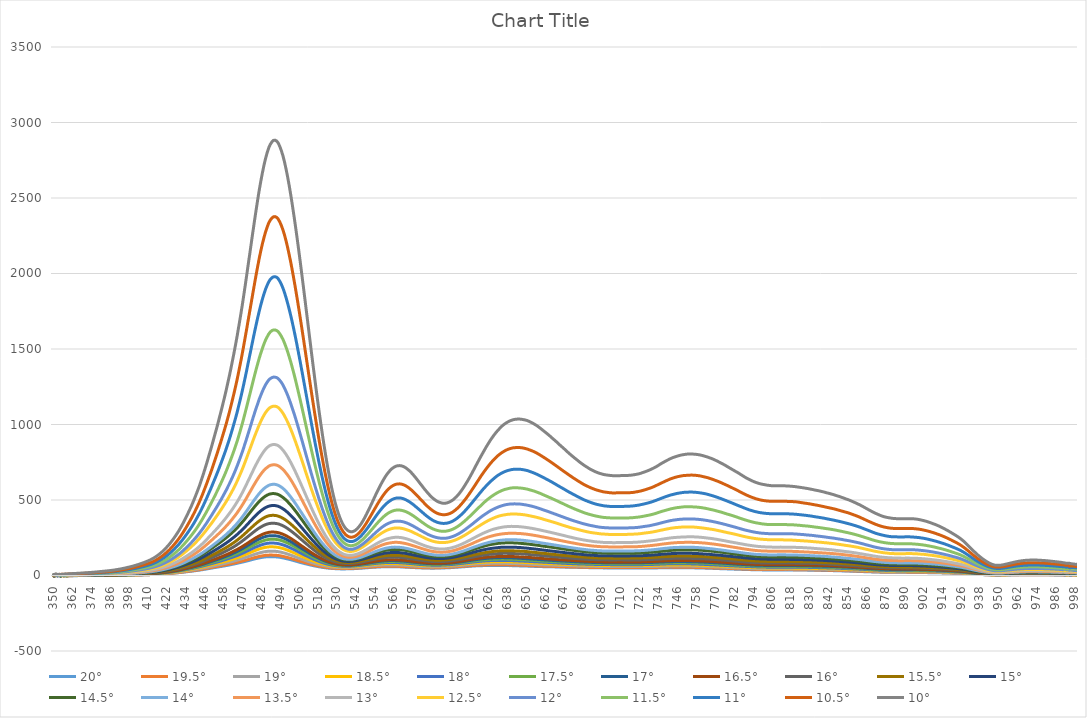
| Category | 20° | 19.5° | 19° | 18.5° | 18° | 17.5° | 17° | 16.5° | 16° | 15.5° | 15° | 14.5° | 14° | 13.5° | 13° | 12.5° | 12° | 11.5° | 11° | 10.5° | 10° |
|---|---|---|---|---|---|---|---|---|---|---|---|---|---|---|---|---|---|---|---|---|---|
| 350.0 | -3.8 | -4.6 | -4.43 | -1.91 | -3.49 | -1.98 | -2.47 | -2.61 | -2.13 | -1.78 | -2.96 | -2.86 | -1.34 | -1.84 | -1.45 | 0.39 | -0.03 | 1.76 | 2.17 | 3.65 | 5.14 |
| 351.0 | -2.59 | -1.88 | -1.63 | -2.56 | -1.35 | -1.81 | -1.64 | -1.21 | -0.99 | 0.06 | -1.39 | 0.5 | 1.16 | -0.02 | 0.41 | 1.13 | 2.72 | 3.41 | 5.08 | 3.66 | 6.78 |
| 352.0 | -0.54 | -1.29 | -0.75 | -0.14 | -0.24 | 0.04 | 0.64 | 1.23 | 2.02 | 0.64 | -0.57 | 2.36 | 0.42 | 1.25 | 1.62 | 4.01 | 4.22 | 3.98 | 5.79 | 7.55 | 10.65 |
| 353.0 | -1.22 | -2.13 | -0.63 | 1.26 | -1.13 | 0.01 | -1.39 | 0.25 | 0.46 | -0.81 | 0.3 | 0.75 | 0.14 | 3.08 | 1.95 | 2.42 | 3.39 | 6.29 | 4.01 | 5.92 | 6.45 |
| 354.0 | -0.59 | 0.29 | 0.73 | 0.08 | -0.95 | 1.05 | 0.68 | -0.36 | 0.46 | 1.74 | 1.89 | 2.37 | 2.81 | 0.76 | 2.65 | 4.52 | 6.3 | 5.73 | 6.57 | 7.53 | 7.84 |
| 355.0 | -4.15 | -2.56 | -2.13 | -1.78 | -2.16 | -3.18 | -1.54 | -1.16 | -0.76 | -0.45 | -1.78 | -1.89 | -0.79 | -0.06 | -0.19 | 1.72 | 3.41 | 2.56 | 4.08 | 7.33 | 5.67 |
| 356.0 | 2.12 | -1.53 | 0.09 | 0.32 | 0.18 | 0.45 | 0.92 | -0.53 | 0.31 | 2.13 | 4.66 | 1.52 | 0.91 | 4.03 | 3.12 | 4.37 | 4.91 | 6.01 | 7.25 | 9.04 | 8.43 |
| 357.0 | -2.07 | -2.23 | -1.25 | -3.31 | -1.07 | -0.15 | -0.63 | 0.37 | -0.02 | -0.28 | -1.48 | 1.65 | 2.5 | 0.69 | 2.95 | 3.8 | 1.18 | 3.75 | 6.34 | 7.11 | 7.34 |
| 358.0 | -2.58 | -1.68 | -1.01 | 0.71 | -0.08 | -0.06 | 0.22 | -0.05 | -0.25 | 0.91 | -0.02 | 1.79 | 1.94 | 1.33 | 1.63 | 3.08 | 2.93 | 3.92 | 6.44 | 8.85 | 11.12 |
| 359.0 | -3.02 | -2.08 | -0.57 | -2.37 | -1.59 | -1.05 | 0.63 | -0.98 | -0.86 | -1.45 | 0.97 | 0.07 | 0.64 | 1.16 | 2.12 | 2.67 | 4.32 | 5.27 | 5.98 | 9.12 | 9.4 |
| 360.0 | -1.5 | -1.32 | -0.93 | -0.48 | -0.77 | -0.09 | 0.18 | 0 | 0.54 | 0.47 | 0.82 | 1.27 | 1.63 | 2.06 | 2.85 | 4 | 4.81 | 6.37 | 7.61 | 9.39 | 11.04 |
| 361.0 | -1.39 | -1.05 | -0.71 | -0.34 | -0.58 | 0 | 0.36 | 0.2 | 0.69 | 0.8 | 1.14 | 1.58 | 1.86 | 2.37 | 3.15 | 4.2 | 5.32 | 6.77 | 8.21 | 10 | 11.64 |
| 362.0 | -1.3 | -0.87 | -0.6 | -0.08 | -0.51 | 0.11 | 0.53 | 0.31 | 0.85 | 0.88 | 1.37 | 1.68 | 1.98 | 2.63 | 3.41 | 4.52 | 5.53 | 7.23 | 8.63 | 10.61 | 12.29 |
| 363.0 | -1.29 | -0.84 | -0.52 | -0.1 | -0.52 | 0.09 | 0.53 | 0.31 | 0.79 | 0.91 | 1.48 | 1.71 | 2.08 | 2.79 | 3.63 | 4.7 | 5.73 | 7.6 | 8.96 | 11 | 12.67 |
| 364.0 | -1.08 | -0.61 | -0.43 | -0.1 | -0.4 | 0.24 | 0.78 | 0.41 | 0.99 | 1.13 | 1.68 | 1.92 | 2.25 | 3 | 3.83 | 5.03 | 6.11 | 7.89 | 9.43 | 11.54 | 13.37 |
| 365.0 | -1.06 | -0.58 | -0.42 | -0.13 | -0.32 | 0.2 | 0.83 | 0.51 | 1.07 | 1.18 | 1.69 | 2.08 | 2.27 | 3.21 | 4.02 | 5.24 | 6.22 | 8.22 | 9.78 | 11.93 | 13.98 |
| 366.0 | -0.79 | -0.4 | -0.27 | 0.01 | -0.17 | 0.52 | 1.03 | 0.6 | 1.25 | 1.35 | 2.01 | 2.24 | 2.53 | 3.47 | 4.41 | 5.63 | 6.54 | 8.69 | 10.26 | 12.47 | 14.68 |
| 367.0 | -0.77 | -0.25 | -0.22 | 0.09 | -0.07 | 0.64 | 1.02 | 0.78 | 1.43 | 1.39 | 2.02 | 2.36 | 2.73 | 3.7 | 4.61 | 5.9 | 6.82 | 9.06 | 10.74 | 12.89 | 15.32 |
| 368.0 | -0.82 | -0.22 | -0.22 | 0.19 | -0.04 | 0.65 | 1.06 | 0.77 | 1.54 | 1.48 | 2.26 | 2.47 | 2.74 | 3.86 | 4.73 | 6.12 | 7.18 | 9.44 | 11.08 | 13.37 | 16.02 |
| 369.0 | -0.77 | -0.11 | -0.16 | 0.24 | 0.02 | 0.73 | 1.17 | 0.86 | 1.61 | 1.53 | 2.34 | 2.56 | 2.86 | 4.07 | 4.97 | 6.38 | 7.61 | 9.89 | 11.6 | 13.85 | 16.52 |
| 370.0 | -0.58 | 0.06 | -0.13 | 0.51 | 0.12 | 0.92 | 1.31 | 0.96 | 1.88 | 1.74 | 2.6 | 2.85 | 3.15 | 4.36 | 5.27 | 6.74 | 8.02 | 10.33 | 12.13 | 14.4 | 17.22 |
| 371.0 | -0.46 | 0.09 | -0.09 | 0.56 | 0.33 | 0.97 | 1.38 | 1.12 | 1.94 | 1.81 | 2.79 | 3.02 | 3.36 | 4.51 | 5.52 | 6.96 | 8.41 | 10.76 | 12.47 | 14.99 | 17.81 |
| 372.0 | -0.36 | 0.24 | 0.02 | 0.73 | 0.63 | 1.13 | 1.54 | 1.23 | 2.13 | 1.92 | 2.9 | 3.29 | 3.65 | 4.91 | 5.86 | 7.45 | 8.9 | 11.25 | 13.13 | 15.64 | 18.6 |
| 373.0 | -0.16 | 0.46 | 0.18 | 0.85 | 0.78 | 1.2 | 1.64 | 1.36 | 2.14 | 2.04 | 3.19 | 3.53 | 3.88 | 5.25 | 6.15 | 7.85 | 9.34 | 11.78 | 13.8 | 16.23 | 19.46 |
| 374.0 | -0.21 | 0.5 | 0.13 | 0.91 | 0.89 | 1.26 | 1.8 | 1.43 | 2.11 | 2.12 | 3.2 | 3.63 | 4.09 | 5.41 | 6.38 | 8.24 | 9.7 | 12.15 | 14.37 | 16.85 | 20.12 |
| 375.0 | -0.11 | 0.51 | 0.22 | 0.99 | 0.99 | 1.37 | 1.89 | 1.6 | 2.29 | 2.42 | 3.42 | 4.02 | 4.26 | 5.62 | 6.67 | 8.57 | 10.06 | 12.69 | 14.93 | 17.43 | 21.01 |
| 376.0 | -0.13 | 0.5 | 0.25 | 0.93 | 1.1 | 1.45 | 1.83 | 1.65 | 2.46 | 2.51 | 3.62 | 4.17 | 4.62 | 5.82 | 6.94 | 8.89 | 10.35 | 13.2 | 15.52 | 18.08 | 21.77 |
| 377.0 | 0.09 | 0.57 | 0.51 | 1.11 | 1.32 | 1.66 | 2.03 | 1.89 | 2.69 | 2.65 | 4.02 | 4.63 | 4.91 | 6.19 | 7.42 | 9.37 | 11.01 | 13.85 | 16.17 | 18.95 | 22.77 |
| 378.0 | 0.04 | 0.62 | 0.63 | 1.16 | 1.35 | 1.75 | 2.16 | 2 | 2.8 | 2.79 | 4.18 | 4.91 | 5.02 | 6.48 | 7.65 | 9.7 | 11.48 | 14.38 | 16.78 | 19.76 | 23.73 |
| 379.0 | 0.12 | 0.69 | 0.85 | 1.17 | 1.33 | 1.87 | 2.28 | 2.15 | 2.87 | 2.9 | 4.24 | 5.3 | 5.13 | 6.8 | 8.02 | 10.18 | 11.86 | 14.88 | 17.35 | 20.4 | 24.79 |
| 380.0 | 0.15 | 0.76 | 0.98 | 1.26 | 1.44 | 2.08 | 2.43 | 2.25 | 3.07 | 3.11 | 4.6 | 5.47 | 5.26 | 7.22 | 8.5 | 10.68 | 12.37 | 15.44 | 18.1 | 21.19 | 25.88 |
| 381.0 | 0.18 | 0.9 | 1.02 | 1.2 | 1.63 | 2.14 | 2.55 | 2.35 | 3.18 | 3.32 | 4.79 | 5.73 | 5.46 | 7.48 | 8.92 | 11.16 | 12.94 | 16 | 18.82 | 22.02 | 26.88 |
| 382.0 | 0.27 | 0.91 | 1.25 | 1.27 | 1.76 | 2.3 | 2.68 | 2.44 | 3.33 | 3.38 | 5 | 5.95 | 5.68 | 7.8 | 9.29 | 11.71 | 13.35 | 16.65 | 19.42 | 22.77 | 28.03 |
| 383.0 | 0.37 | 0.92 | 1.27 | 1.32 | 1.91 | 2.43 | 2.79 | 2.54 | 3.37 | 3.64 | 5.24 | 6.27 | 5.93 | 8.01 | 9.6 | 12.1 | 13.95 | 17.1 | 20.15 | 23.55 | 28.92 |
| 384.0 | 0.35 | 0.94 | 1.23 | 1.5 | 2.02 | 2.59 | 2.88 | 2.61 | 3.55 | 3.85 | 5.43 | 6.57 | 6.22 | 8.32 | 9.91 | 12.6 | 14.49 | 17.63 | 20.85 | 24.3 | 29.87 |
| 385.0 | 0.28 | 0.97 | 1.33 | 1.63 | 2.1 | 2.62 | 3.03 | 2.74 | 3.68 | 4.05 | 5.68 | 6.78 | 6.54 | 8.61 | 10.38 | 13.13 | 14.96 | 18.25 | 21.6 | 25.2 | 30.99 |
| 386.0 | 0.36 | 0.92 | 1.38 | 1.78 | 2.19 | 2.9 | 3.13 | 2.94 | 3.9 | 4.37 | 6.02 | 6.97 | 6.91 | 9.03 | 10.79 | 13.72 | 15.59 | 18.96 | 22.49 | 26.27 | 32.14 |
| 387.0 | 0.38 | 0.96 | 1.54 | 1.92 | 2.3 | 2.93 | 3.26 | 3.15 | 3.96 | 4.58 | 6.22 | 7.42 | 7.22 | 9.36 | 11.18 | 14.23 | 16.31 | 19.72 | 23.47 | 27.25 | 33.55 |
| 388.0 | 0.3 | 1.03 | 1.55 | 1.96 | 2.45 | 2.92 | 3.48 | 3.19 | 4.11 | 4.74 | 6.37 | 7.73 | 7.49 | 9.51 | 11.63 | 14.67 | 16.87 | 20.42 | 24.3 | 28.37 | 34.87 |
| 389.0 | 0.5 | 1.11 | 1.62 | 2.09 | 2.51 | 3.06 | 3.61 | 3.49 | 4.33 | 5.02 | 6.56 | 8 | 7.76 | 9.9 | 12.16 | 15.2 | 17.62 | 21.19 | 25.3 | 29.54 | 36.19 |
| 390.0 | 0.72 | 1.22 | 1.88 | 2.21 | 2.78 | 3.29 | 3.98 | 3.8 | 4.65 | 5.38 | 7.08 | 8.53 | 8.35 | 10.51 | 12.82 | 16.09 | 18.43 | 22.29 | 26.54 | 31.07 | 38 |
| 391.0 | 0.79 | 1.23 | 2.04 | 2.2 | 2.93 | 3.34 | 4.1 | 4.07 | 4.77 | 5.71 | 7.38 | 8.84 | 8.65 | 10.95 | 13.31 | 16.83 | 19.18 | 23.16 | 27.77 | 32.42 | 39.64 |
| 392.0 | 0.86 | 1.37 | 2.23 | 2.43 | 3 | 3.67 | 4.34 | 4.32 | 5.07 | 6.09 | 7.87 | 9.19 | 9.03 | 11.47 | 13.89 | 17.62 | 20.12 | 24.17 | 29.29 | 33.95 | 41.44 |
| 393.0 | 1.11 | 1.58 | 2.49 | 2.75 | 3.17 | 3.95 | 4.55 | 4.66 | 5.5 | 6.56 | 8.38 | 9.68 | 9.56 | 12.02 | 14.56 | 18.43 | 21.1 | 25.38 | 30.62 | 35.62 | 43.46 |
| 394.0 | 1.2 | 1.6 | 2.52 | 2.84 | 3.34 | 4.19 | 4.78 | 4.92 | 5.81 | 6.95 | 8.65 | 10.06 | 10.01 | 12.65 | 15.19 | 19.31 | 22.04 | 26.59 | 31.88 | 37.22 | 45.4 |
| 395.0 | 1.44 | 1.74 | 2.82 | 3.12 | 3.53 | 4.41 | 5.01 | 5.36 | 6.13 | 7.54 | 9.18 | 10.72 | 10.58 | 13.46 | 15.89 | 20.18 | 23.18 | 27.92 | 33.25 | 38.83 | 47.51 |
| 396.0 | 1.4 | 1.84 | 2.8 | 3.25 | 3.71 | 4.57 | 5.13 | 5.46 | 6.34 | 7.75 | 9.64 | 11.05 | 11.13 | 14.08 | 16.55 | 21.23 | 24.3 | 29.22 | 34.76 | 40.65 | 49.88 |
| 397.0 | 1.68 | 2.17 | 3.11 | 3.77 | 4.13 | 4.96 | 5.63 | 5.91 | 6.75 | 8.33 | 10.22 | 11.69 | 11.86 | 14.93 | 17.49 | 22.29 | 25.72 | 30.78 | 36.51 | 42.73 | 52.39 |
| 398.0 | 1.87 | 2.44 | 3.3 | 3.97 | 4.41 | 5.22 | 5.94 | 6.21 | 7.1 | 8.8 | 10.61 | 12.05 | 12.42 | 15.62 | 18.19 | 23.4 | 26.81 | 32.13 | 38.17 | 44.76 | 54.84 |
| 399.0 | 2.13 | 2.51 | 3.33 | 4.19 | 4.68 | 5.38 | 6.09 | 6.46 | 7.49 | 9.24 | 11.12 | 12.56 | 12.98 | 16.27 | 19.04 | 24.41 | 27.85 | 33.66 | 39.87 | 46.72 | 57.22 |
| 400.0 | 2.45 | 2.72 | 3.56 | 4.43 | 4.94 | 5.74 | 6.44 | 6.82 | 7.97 | 9.88 | 11.71 | 13.06 | 13.68 | 16.89 | 19.89 | 25.56 | 29.23 | 35.11 | 41.83 | 48.99 | 59.87 |
| 401.0 | 2.57 | 2.93 | 3.68 | 4.68 | 5.12 | 5.94 | 6.82 | 7.13 | 8.34 | 10.18 | 12.07 | 13.65 | 14.33 | 17.65 | 20.72 | 26.75 | 30.59 | 36.57 | 43.82 | 51.39 | 62.68 |
| 402.0 | 2.81 | 3.18 | 4.1 | 5.11 | 5.69 | 6.48 | 7.27 | 7.67 | 8.8 | 10.75 | 12.71 | 14.41 | 15.2 | 18.63 | 21.79 | 28.02 | 32.01 | 38.36 | 45.91 | 53.95 | 65.9 |
| 403.0 | 3.12 | 3.45 | 4.35 | 5.44 | 6.15 | 6.93 | 7.73 | 8.19 | 9.35 | 11.43 | 13.33 | 15.1 | 16.07 | 19.46 | 22.83 | 29.24 | 33.57 | 40.06 | 48.06 | 56.59 | 68.83 |
| 404.0 | 3.37 | 3.59 | 4.7 | 5.72 | 6.56 | 7.43 | 8.07 | 8.59 | 9.97 | 12.01 | 13.97 | 15.77 | 16.87 | 20.41 | 23.9 | 30.5 | 35.11 | 41.94 | 50.33 | 59.14 | 72.01 |
| 405.0 | 3.67 | 3.9 | 5.04 | 6.09 | 6.98 | 7.93 | 8.63 | 9.12 | 10.58 | 12.62 | 14.64 | 16.43 | 17.67 | 21.36 | 25.01 | 31.85 | 36.67 | 43.94 | 52.68 | 61.96 | 75.52 |
| 406.0 | 3.92 | 3.98 | 5.19 | 6.4 | 7.28 | 8.35 | 9.05 | 9.69 | 10.96 | 13.16 | 15.31 | 17.14 | 18.53 | 22.24 | 26.26 | 33.12 | 38.27 | 45.98 | 55.33 | 64.89 | 79.05 |
| 407.0 | 4.12 | 4.29 | 5.48 | 6.78 | 7.67 | 8.75 | 9.55 | 10.07 | 11.42 | 13.61 | 15.99 | 17.99 | 19.41 | 23.2 | 27.35 | 34.53 | 39.97 | 48.02 | 57.79 | 67.84 | 82.76 |
| 408.0 | 4.43 | 4.66 | 5.81 | 7.18 | 8.19 | 9.28 | 10.2 | 10.61 | 12.29 | 14.32 | 16.9 | 18.93 | 20.4 | 24.37 | 28.52 | 36.18 | 41.84 | 50.17 | 60.41 | 70.98 | 86.58 |
| 409.0 | 4.79 | 4.88 | 6.17 | 7.49 | 8.6 | 9.79 | 10.74 | 11.17 | 12.98 | 14.95 | 17.66 | 19.9 | 21.31 | 25.59 | 29.91 | 37.89 | 43.78 | 52.55 | 63.23 | 74.21 | 90.67 |
| 410.0 | 5.08 | 5.19 | 6.51 | 7.9 | 9.16 | 10.24 | 11.31 | 11.68 | 13.59 | 15.65 | 18.54 | 20.9 | 22.5 | 26.76 | 31.45 | 39.64 | 45.87 | 54.97 | 66.13 | 77.72 | 94.86 |
| 411.0 | 5.41 | 5.53 | 6.81 | 8.4 | 9.5 | 10.78 | 11.7 | 12.13 | 14.33 | 16.48 | 19.37 | 21.86 | 23.5 | 27.97 | 32.83 | 41.39 | 48 | 57.38 | 69.02 | 81.08 | 99.21 |
| 412.0 | 5.93 | 5.99 | 7.38 | 8.89 | 10.23 | 11.5 | 12.32 | 12.82 | 15.21 | 17.39 | 20.26 | 23.1 | 24.79 | 29.43 | 34.55 | 43.44 | 50.38 | 60.39 | 72.49 | 85.17 | 104.28 |
| 413.0 | 6.33 | 6.41 | 7.73 | 9.39 | 10.79 | 11.93 | 13 | 13.38 | 16.09 | 18.39 | 21.18 | 24.35 | 26.06 | 30.96 | 36.29 | 45.56 | 52.75 | 63.38 | 75.95 | 89.19 | 109.61 |
| 414.0 | 6.77 | 6.83 | 8.12 | 9.9 | 11.58 | 12.59 | 13.77 | 14.19 | 17.01 | 19.41 | 22.3 | 25.63 | 27.41 | 32.61 | 38.21 | 47.97 | 55.42 | 66.82 | 80.22 | 93.98 | 115.52 |
| 415.0 | 7.28 | 7.38 | 8.75 | 10.62 | 12.37 | 13.44 | 14.58 | 15.07 | 18.21 | 20.61 | 23.68 | 27.13 | 29.01 | 34.42 | 40.35 | 50.66 | 58.52 | 70.61 | 84.91 | 99.36 | 121.9 |
| 416.0 | 7.9 | 8.1 | 9.4 | 11.3 | 13.26 | 14.32 | 15.53 | 15.85 | 19.46 | 21.68 | 25.02 | 28.63 | 30.58 | 36.41 | 42.9 | 53.64 | 61.8 | 74.63 | 89.93 | 105.27 | 129 |
| 417.0 | 8.61 | 8.75 | 10.36 | 12.14 | 14.15 | 15.43 | 16.63 | 17.06 | 20.79 | 23.17 | 26.54 | 30.54 | 32.53 | 38.7 | 45.55 | 56.86 | 65.63 | 79.07 | 95.6 | 111.86 | 136.77 |
| 418.0 | 9.23 | 9.35 | 11.07 | 12.71 | 15.02 | 16.31 | 17.64 | 18.07 | 22.02 | 24.57 | 28.07 | 32.31 | 34.58 | 40.97 | 48.07 | 60.22 | 69.27 | 83.59 | 101.43 | 118.66 | 144.95 |
| 419.0 | 9.78 | 9.85 | 11.73 | 13.52 | 15.89 | 17.32 | 18.53 | 19.22 | 23.27 | 25.98 | 29.74 | 34.21 | 36.73 | 43.25 | 50.87 | 63.71 | 73.4 | 88.68 | 107.65 | 125.91 | 153.74 |
| 420.0 | 10.32 | 10.59 | 12.58 | 14.39 | 16.9 | 18.49 | 19.77 | 20.35 | 24.52 | 27.39 | 31.61 | 36.16 | 38.94 | 45.95 | 54.05 | 67.77 | 77.89 | 93.97 | 114.08 | 133.72 | 163.15 |
| 421.0 | 10.92 | 11.36 | 13.38 | 15.52 | 17.94 | 19.51 | 21.02 | 21.78 | 26.03 | 28.98 | 33.56 | 38.42 | 41.38 | 48.84 | 57.47 | 71.96 | 82.75 | 99.94 | 121.07 | 142.11 | 173.4 |
| 422.0 | 11.77 | 12.13 | 14.39 | 16.63 | 19.05 | 20.74 | 22.18 | 23.26 | 27.79 | 31.07 | 35.7 | 40.96 | 44.05 | 52.05 | 60.96 | 76.84 | 87.82 | 106.28 | 128.69 | 151.1 | 184.44 |
| 423.0 | 12.5 | 12.88 | 15.33 | 17.84 | 20.17 | 21.92 | 23.65 | 24.74 | 29.64 | 33.02 | 37.9 | 43.23 | 46.78 | 55.17 | 64.67 | 81.33 | 93.27 | 112.95 | 136.73 | 160.54 | 195.5 |
| 424.0 | 13.38 | 13.81 | 16.2 | 18.97 | 21.37 | 23.19 | 25.15 | 26.23 | 31.44 | 34.83 | 40.21 | 45.84 | 49.73 | 58.64 | 68.82 | 86.45 | 99.11 | 119.94 | 145.28 | 170.62 | 207.88 |
| 425.0 | 14.13 | 14.78 | 17.31 | 20.15 | 22.61 | 24.54 | 26.77 | 27.9 | 33.3 | 36.87 | 42.64 | 48.72 | 52.74 | 62.41 | 73 | 92.01 | 105.38 | 127.73 | 154.3 | 181.48 | 221.04 |
| 426.0 | 15.16 | 15.7 | 18.44 | 21.35 | 24.05 | 25.96 | 28.38 | 29.44 | 35.32 | 39.04 | 45.39 | 51.78 | 56.04 | 66.19 | 77.53 | 97.74 | 112.07 | 135.73 | 163.86 | 192.99 | 234.96 |
| 427.0 | 16.05 | 16.68 | 19.65 | 22.61 | 25.62 | 27.47 | 29.84 | 31.16 | 37.36 | 41.48 | 48.05 | 54.92 | 59.25 | 70.26 | 82.04 | 103.78 | 118.92 | 144.19 | 173.84 | 204.96 | 249.34 |
| 428.0 | 17.07 | 17.8 | 20.86 | 24 | 27.19 | 29.17 | 31.7 | 33.1 | 39.58 | 44.05 | 51.01 | 58.09 | 62.73 | 74.6 | 87.19 | 110.23 | 126.19 | 152.9 | 184.53 | 217.48 | 264.43 |
| 429.0 | 17.96 | 18.75 | 21.85 | 25.39 | 28.74 | 30.71 | 33.27 | 34.95 | 41.71 | 46.49 | 53.61 | 61.43 | 66.28 | 78.95 | 92.35 | 116.65 | 133.4 | 162.23 | 195.44 | 230.49 | 280.18 |
| 430.0 | 18.9 | 19.85 | 23.12 | 26.94 | 30.31 | 32.56 | 35.19 | 36.96 | 44 | 49.28 | 56.79 | 65.06 | 70.22 | 83.63 | 97.76 | 123.54 | 141.3 | 171.9 | 206.89 | 244.32 | 296.74 |
| 431.0 | 20.01 | 21.21 | 24.72 | 28.7 | 32.26 | 34.49 | 37.17 | 39.11 | 46.71 | 52.08 | 60.27 | 68.91 | 74.4 | 88.62 | 103.51 | 131.03 | 149.59 | 182.37 | 219.3 | 259.18 | 314.82 |
| 432.0 | 21.18 | 22.5 | 26.18 | 30.22 | 34.18 | 36.34 | 39.23 | 41.55 | 49.4 | 55.11 | 63.71 | 72.81 | 78.58 | 93.87 | 109.59 | 138.77 | 158.51 | 193.08 | 232.24 | 274.54 | 333.54 |
| 433.0 | 22.28 | 23.88 | 27.49 | 32 | 36.13 | 38.38 | 41.53 | 44.02 | 52.25 | 58.19 | 67.33 | 76.95 | 83.08 | 99.54 | 116.03 | 146.97 | 167.81 | 204.32 | 245.85 | 290.7 | 353.23 |
| 434.0 | 23.5 | 25.23 | 29.22 | 33.84 | 38.08 | 40.6 | 43.88 | 46.6 | 55.18 | 61.41 | 71.18 | 81.37 | 87.91 | 105.24 | 122.64 | 155.18 | 177.53 | 216 | 260.04 | 307.47 | 373.69 |
| 435.0 | 24.75 | 26.58 | 30.84 | 35.56 | 39.95 | 42.62 | 46.1 | 49.13 | 58.06 | 64.76 | 74.92 | 85.62 | 92.8 | 111.11 | 129.31 | 163.64 | 187.42 | 227.87 | 274.27 | 324.56 | 394.18 |
| 436.0 | 26.17 | 27.97 | 32.53 | 37.53 | 41.95 | 44.82 | 48.66 | 51.69 | 61.05 | 68.09 | 78.9 | 90.22 | 98.01 | 117.2 | 136.31 | 172.9 | 197.93 | 240.52 | 289.39 | 343.02 | 416.64 |
| 437.0 | 27.43 | 29.25 | 33.93 | 39.46 | 43.84 | 47.02 | 50.91 | 54.12 | 64.09 | 71.55 | 82.89 | 94.77 | 103.01 | 123.22 | 143.2 | 182.02 | 208.37 | 253.28 | 304.77 | 361.15 | 438.89 |
| 438.0 | 28.65 | 30.7 | 35.46 | 41.32 | 46.11 | 49.1 | 53.31 | 56.76 | 67.08 | 75.02 | 86.86 | 99.45 | 108.09 | 129.35 | 150.37 | 191.3 | 219.01 | 266.48 | 320.36 | 379.94 | 461.6 |
| 439.0 | 29.89 | 32.19 | 37.15 | 43.45 | 48.21 | 51.39 | 55.78 | 59.66 | 70.36 | 78.86 | 90.98 | 104.51 | 113.43 | 136 | 158.25 | 201.38 | 230.42 | 280.23 | 337.12 | 399.9 | 486.14 |
| 440.0 | 31.31 | 33.68 | 38.91 | 45.47 | 50.37 | 53.99 | 58.72 | 62.49 | 73.75 | 82.65 | 95.43 | 109.84 | 119 | 142.98 | 166.2 | 211.57 | 242.09 | 294.27 | 354.49 | 420.29 | 511.3 |
| 441.0 | 32.88 | 35.25 | 40.79 | 47.6 | 52.71 | 56.47 | 61.54 | 65.54 | 77.43 | 86.76 | 99.95 | 115.49 | 124.97 | 150.11 | 174.53 | 222.1 | 254.52 | 308.79 | 372.72 | 441.9 | 538.09 |
| 442.0 | 34.16 | 36.85 | 42.7 | 49.73 | 55.11 | 59.2 | 64.39 | 68.4 | 80.95 | 90.79 | 104.76 | 120.99 | 131.18 | 157.61 | 183.11 | 233.26 | 267 | 324.25 | 391.68 | 464.1 | 565.15 |
| 443.0 | 35.62 | 38.42 | 44.59 | 51.9 | 57.62 | 61.87 | 67.12 | 71.38 | 84.58 | 94.84 | 109.53 | 126.65 | 137.24 | 164.92 | 191.91 | 244.09 | 279.98 | 340.19 | 410.37 | 486.93 | 592.87 |
| 444.0 | 37.21 | 40.22 | 46.5 | 54.17 | 60.1 | 64.65 | 70.14 | 74.77 | 88.45 | 99.4 | 114.75 | 133.08 | 143.78 | 173.3 | 201.53 | 256.63 | 294.23 | 357.36 | 431.23 | 511.99 | 623.69 |
| 445.0 | 38.79 | 41.83 | 48.57 | 56.61 | 62.68 | 67.57 | 73.22 | 78.21 | 92.41 | 103.89 | 120.14 | 139.41 | 150.42 | 181.39 | 210.88 | 268.64 | 308.13 | 374.69 | 452.34 | 536.74 | 654.12 |
| 446.0 | 40.71 | 43.82 | 50.59 | 59.18 | 65.6 | 70.84 | 76.61 | 81.89 | 96.67 | 108.96 | 125.95 | 146.33 | 157.54 | 190.04 | 221.22 | 281.86 | 323.34 | 393.02 | 475.09 | 563.95 | 687.26 |
| 447.0 | 42.31 | 45.86 | 52.73 | 61.62 | 68.29 | 73.86 | 79.93 | 85.58 | 100.81 | 113.84 | 131.71 | 152.75 | 164.79 | 198.84 | 231.65 | 294.63 | 338.25 | 411.41 | 497.56 | 590.79 | 720.6 |
| 448.0 | 44.12 | 47.93 | 54.85 | 64.11 | 71.17 | 77.13 | 83.46 | 89.24 | 105.33 | 118.87 | 137.58 | 159.52 | 172.48 | 207.83 | 242.3 | 308.47 | 353.99 | 430.27 | 521.06 | 618.48 | 755.24 |
| 449.0 | 45.9 | 49.82 | 57.15 | 66.64 | 74.05 | 80.19 | 86.86 | 93.13 | 109.86 | 124.05 | 143.62 | 166.66 | 180.16 | 217.16 | 253.26 | 322.45 | 370.43 | 450.5 | 545.13 | 647.68 | 791.52 |
| 450.0 | 47.71 | 51.68 | 59.37 | 69.14 | 76.74 | 83.31 | 90.31 | 96.86 | 114.19 | 129.15 | 149.8 | 173.63 | 187.81 | 226.29 | 263.7 | 335.94 | 386.32 | 469.78 | 568.67 | 675.87 | 826.6 |
| 451.0 | 49.52 | 53.57 | 61.64 | 71.78 | 79.65 | 86.46 | 93.68 | 100.74 | 118.67 | 134.45 | 155.77 | 180.56 | 195.51 | 235.51 | 274.7 | 349.75 | 402.49 | 489.45 | 593.1 | 705.34 | 862.77 |
| 452.0 | 51.5 | 55.72 | 64.08 | 74.47 | 82.62 | 89.9 | 97.56 | 104.75 | 123.39 | 140.03 | 161.96 | 188.21 | 203.76 | 245.61 | 286.23 | 364.67 | 419.88 | 510.49 | 619.15 | 736.87 | 901.16 |
| 453.0 | 53.23 | 57.62 | 66.24 | 77.14 | 85.49 | 93.17 | 101.01 | 108.56 | 127.87 | 145.07 | 168.27 | 195.58 | 211.53 | 254.93 | 297.51 | 379.03 | 436.47 | 531.05 | 644.23 | 767.71 | 938.68 |
| 454.0 | 55.01 | 59.43 | 68.49 | 79.62 | 88.3 | 96.47 | 104.52 | 112.42 | 132.4 | 150.45 | 174.49 | 202.83 | 219.46 | 264.45 | 308.75 | 393.65 | 453.33 | 552.23 | 669.74 | 799.01 | 976.37 |
| 455.0 | 56.7 | 61.19 | 70.63 | 82.02 | 91.17 | 99.64 | 108.03 | 116.35 | 137.02 | 155.95 | 180.73 | 210.13 | 227.6 | 274.19 | 320.4 | 408.91 | 470.95 | 574.07 | 696.23 | 831.93 | 1015.69 |
| 456.0 | 58.36 | 63.08 | 72.82 | 84.72 | 94.18 | 103.13 | 111.86 | 120.14 | 141.8 | 161.56 | 187.26 | 217.8 | 236.03 | 283.96 | 332.34 | 424.35 | 488.54 | 596.25 | 723.68 | 865.26 | 1056.76 |
| 457.0 | 59.95 | 65.02 | 75.24 | 87.13 | 97.26 | 106.5 | 115.44 | 124.1 | 146.64 | 167.31 | 193.88 | 225.5 | 244.15 | 293.96 | 344.33 | 439.63 | 506.66 | 618.39 | 750.98 | 897.83 | 1096.89 |
| 458.0 | 61.8 | 67.16 | 77.79 | 89.77 | 100.62 | 110.17 | 119.58 | 128.53 | 151.59 | 173.24 | 200.8 | 233.46 | 253.34 | 304.67 | 357.11 | 456.1 | 525.97 | 641.91 | 779.57 | 932.75 | 1139.37 |
| 459.0 | 63.69 | 69.09 | 80.1 | 92.42 | 103.75 | 113.87 | 123.54 | 132.83 | 156.85 | 179.01 | 207.79 | 241.51 | 262.24 | 315.38 | 369.84 | 472.23 | 545.22 | 665.52 | 808 | 967.29 | 1182.1 |
| 460.0 | 65.6 | 71.08 | 82.6 | 95.07 | 107 | 117.47 | 127.63 | 137.33 | 162.14 | 184.98 | 214.84 | 249.71 | 271.12 | 326.49 | 382.83 | 488.65 | 564.58 | 690.21 | 838.12 | 1003.16 | 1226.4 |
| 461.0 | 67.58 | 73.43 | 85.21 | 98.07 | 110.37 | 121.3 | 131.75 | 141.97 | 167.61 | 191.5 | 222.33 | 258.26 | 280.91 | 337.98 | 396.72 | 506.37 | 585.64 | 716.44 | 869.42 | 1041.14 | 1273.61 |
| 462.0 | 69.61 | 75.44 | 87.86 | 101.05 | 113.77 | 125.1 | 135.81 | 146.64 | 173.11 | 197.95 | 230.14 | 266.92 | 290.79 | 349.7 | 410.24 | 524.48 | 606.6 | 743.14 | 901.55 | 1079.97 | 1320.47 |
| 463.0 | 71.87 | 77.5 | 90.39 | 104.12 | 117.32 | 129.07 | 140.24 | 151.63 | 178.89 | 204.8 | 237.93 | 276.11 | 300.86 | 361.95 | 424.61 | 543 | 628.74 | 770.53 | 935.2 | 1121.58 | 1370.05 |
| 464.0 | 73.99 | 79.74 | 92.93 | 107.29 | 120.88 | 133.01 | 145.09 | 156.73 | 184.85 | 211.85 | 246.05 | 285.65 | 311.62 | 374.95 | 439.49 | 562.26 | 651.3 | 798.74 | 970.62 | 1164.03 | 1421.73 |
| 465.0 | 76.35 | 82.26 | 95.82 | 110.49 | 124.73 | 137.39 | 149.91 | 161.73 | 190.98 | 218.91 | 254.3 | 295.44 | 322.54 | 388.29 | 454.98 | 582.5 | 675 | 828.04 | 1006.53 | 1207.34 | 1474.99 |
| 466.0 | 78.56 | 84.79 | 98.4 | 113.85 | 128.46 | 141.71 | 154.72 | 166.79 | 197.5 | 226.52 | 262.89 | 305.45 | 333.61 | 401.59 | 471.04 | 603.35 | 699.83 | 858.18 | 1043.69 | 1252.58 | 1530.29 |
| 467.0 | 80.89 | 87.11 | 101.53 | 117.51 | 132.27 | 146.01 | 159.62 | 172.17 | 204.46 | 234.21 | 271.82 | 315.79 | 345.57 | 415.78 | 487.71 | 625.25 | 725.81 | 889.67 | 1082.35 | 1299.98 | 1587.81 |
| 468.0 | 83.41 | 89.68 | 104.8 | 121.51 | 136.8 | 151.06 | 164.98 | 178.22 | 211.73 | 242.73 | 281.33 | 327.43 | 358.14 | 431.21 | 505.74 | 649.2 | 753.76 | 924.4 | 1125.14 | 1351.26 | 1649.37 |
| 469.0 | 85.79 | 92.4 | 108.13 | 125.49 | 141.16 | 156.09 | 170.49 | 184.18 | 219.06 | 250.8 | 290.92 | 339.1 | 370.73 | 446.68 | 524.07 | 672.76 | 781.97 | 959.92 | 1167.61 | 1403 | 1710.92 |
| 470.0 | 88.22 | 95.06 | 111.29 | 129.44 | 145.51 | 161.27 | 176.08 | 190.32 | 226.53 | 259.45 | 300.88 | 350.9 | 384.19 | 462.6 | 543.27 | 697.46 | 811.09 | 996.39 | 1211.98 | 1456.77 | 1775.17 |
| 471.0 | 90.62 | 97.87 | 114.83 | 133.73 | 150.43 | 166.59 | 181.95 | 196.86 | 234.5 | 268.6 | 311.3 | 363.09 | 398.36 | 479.62 | 563.58 | 723.7 | 842.06 | 1035.26 | 1258.77 | 1513.72 | 1843.52 |
| 472.0 | 93.08 | 100.63 | 118.29 | 137.76 | 155.29 | 172.15 | 188.13 | 203.39 | 242.58 | 278.05 | 322.04 | 375.7 | 412.69 | 497.18 | 584.25 | 750.88 | 874.04 | 1075.26 | 1307.58 | 1572.34 | 1913.93 |
| 473.0 | 95.59 | 103.29 | 121.74 | 142 | 160.3 | 177.33 | 194.21 | 210.1 | 250.75 | 287.45 | 333.27 | 388.63 | 427.32 | 514.76 | 605.74 | 778.64 | 907.05 | 1116.29 | 1357.1 | 1631.27 | 1985.59 |
| 474.0 | 98.48 | 106.4 | 125.47 | 146.37 | 165.32 | 183.09 | 200.57 | 217.15 | 259.37 | 297.46 | 344.62 | 402.19 | 442.67 | 533.47 | 627.84 | 807.25 | 940.59 | 1158.16 | 1408.67 | 1692.14 | 2059.2 |
| 475.0 | 101.14 | 109.58 | 129.29 | 150.71 | 170.11 | 188.63 | 206.75 | 223.73 | 267.55 | 307.09 | 355.63 | 415.18 | 457.57 | 551.34 | 649.24 | 835.14 | 973.82 | 1199.11 | 1459.27 | 1751.73 | 2131.52 |
| 476.0 | 104.13 | 112.69 | 132.98 | 155.36 | 175.22 | 194.42 | 213.23 | 230.48 | 276.1 | 316.69 | 366.83 | 428.52 | 472.62 | 569.75 | 671.13 | 863.71 | 1007.83 | 1241.17 | 1510.36 | 1811.76 | 2205.07 |
| 477.0 | 106.93 | 115.6 | 136.55 | 159.63 | 180.08 | 200 | 219.26 | 237.36 | 284.27 | 326.33 | 378.15 | 441.77 | 487.36 | 588.39 | 692.9 | 892.54 | 1042.04 | 1283.26 | 1561.15 | 1872.3 | 2277.91 |
| 478.0 | 109.55 | 118.4 | 139.87 | 163.93 | 184.93 | 205.32 | 225.53 | 244.08 | 292.42 | 335.77 | 388.97 | 454.71 | 502.34 | 606.09 | 714.36 | 920.14 | 1074.87 | 1324.39 | 1611.36 | 1932.11 | 2349.71 |
| 479.0 | 111.95 | 121.05 | 143.18 | 168.05 | 189.52 | 210.43 | 231.25 | 250.44 | 300.36 | 344.74 | 399.64 | 467.46 | 516.35 | 623.48 | 734.99 | 946.79 | 1106.51 | 1364.28 | 1659.7 | 1990.65 | 2419.79 |
| 480.0 | 114.38 | 123.65 | 146.49 | 171.91 | 193.61 | 215.22 | 236.73 | 256.47 | 307.75 | 353.36 | 409.5 | 478.95 | 529.92 | 639.76 | 754.84 | 972.7 | 1137.1 | 1402.13 | 1706.78 | 2046.65 | 2487.6 |
| 481.0 | 116.76 | 126.1 | 149.38 | 175.72 | 197.87 | 220.05 | 241.83 | 262.14 | 314.82 | 361.51 | 419.57 | 490.5 | 543.11 | 655.96 | 773.83 | 998.08 | 1167.3 | 1439.22 | 1750.81 | 2100.81 | 2552.34 |
| 482.0 | 118.61 | 128.05 | 151.91 | 178.95 | 201.63 | 224.21 | 246.61 | 267.35 | 320.94 | 368.77 | 428.24 | 500.77 | 554.78 | 670.56 | 791.13 | 1021.05 | 1194.19 | 1472.81 | 1792.04 | 2150.83 | 2611.47 |
| 483.0 | 120.33 | 130.08 | 154.25 | 181.93 | 205.05 | 228.18 | 251.18 | 272.34 | 326.9 | 375.71 | 436 | 510.3 | 565.45 | 684.27 | 807.6 | 1042.46 | 1219.52 | 1504.39 | 1830.14 | 2196.61 | 2666.48 |
| 484.0 | 121.97 | 132.01 | 156.5 | 184.64 | 208.14 | 231.69 | 254.91 | 276.56 | 332.26 | 382.2 | 443.22 | 518.7 | 575.38 | 696.74 | 822.79 | 1061.74 | 1242.63 | 1533.67 | 1865.19 | 2237.78 | 2717.24 |
| 485.0 | 123.28 | 133.6 | 158.36 | 186.58 | 210.71 | 234.71 | 258.2 | 280.4 | 336.87 | 387.65 | 449.71 | 526.26 | 584.04 | 707.22 | 835.85 | 1079.01 | 1263.04 | 1559.21 | 1896.09 | 2275.29 | 2761.45 |
| 486.0 | 124.11 | 134.26 | 159.52 | 188.31 | 212.69 | 236.97 | 260.57 | 283.14 | 340.53 | 391.91 | 454.88 | 532 | 590.87 | 715.58 | 846.56 | 1092.66 | 1279.82 | 1579.99 | 1921.75 | 2306.8 | 2799.35 |
| 487.0 | 124.59 | 134.83 | 160.71 | 189.45 | 214.16 | 238.82 | 262.4 | 285.66 | 343.49 | 395.15 | 458.76 | 537.04 | 596.94 | 723.6 | 855.89 | 1105.01 | 1294.28 | 1598.97 | 1944.45 | 2334.27 | 2831.88 |
| 488.0 | 124.53 | 135.28 | 161.09 | 189.97 | 215.05 | 239.97 | 263.51 | 287.04 | 344.96 | 397.25 | 461.5 | 540.3 | 600.84 | 728.87 | 862.04 | 1113.16 | 1303.89 | 1612.61 | 1960.99 | 2353.61 | 2855.08 |
| 489.0 | 124.47 | 135.09 | 161.13 | 189.82 | 215.11 | 240.53 | 263.79 | 287.66 | 346.06 | 398.19 | 463.13 | 542.05 | 603.14 | 731.89 | 865.53 | 1118.34 | 1310.16 | 1621.33 | 1971.34 | 2366.72 | 2870.95 |
| 490.0 | 124.06 | 134.59 | 160.71 | 189.58 | 214.65 | 240.27 | 263.47 | 287.62 | 346.03 | 398.5 | 463.76 | 542.6 | 604.2 | 733.58 | 867.73 | 1121.53 | 1313.84 | 1626.37 | 1977.55 | 2375.32 | 2881.47 |
| 491.0 | 123.71 | 134.1 | 160.3 | 188.96 | 214.21 | 239.64 | 263.13 | 286.9 | 345.33 | 397.7 | 463.04 | 541.8 | 603.5 | 733.18 | 867.03 | 1121.2 | 1313.68 | 1626.61 | 1978.51 | 2376.74 | 2883.09 |
| 492.0 | 123.07 | 133.53 | 159.33 | 187.72 | 213.03 | 238.51 | 262.04 | 285.76 | 343.97 | 396.26 | 461.2 | 539.74 | 601.41 | 730.91 | 864.71 | 1118.72 | 1310.91 | 1622.63 | 1975.44 | 2372.12 | 2877.75 |
| 493.0 | 122.08 | 132.47 | 158.01 | 186.24 | 211.35 | 236.79 | 260.04 | 283.83 | 341.88 | 393.18 | 458.56 | 536.35 | 597.63 | 726.66 | 860.05 | 1112.66 | 1304.14 | 1615.04 | 1965.42 | 2360.76 | 2864.62 |
| 494.0 | 120.69 | 131.08 | 156.01 | 184 | 208.84 | 234.54 | 257.16 | 281.08 | 338.44 | 389.57 | 453.93 | 531.12 | 592.02 | 720.29 | 852.24 | 1102.49 | 1292.87 | 1601.25 | 1949.4 | 2342.12 | 2842.41 |
| 495.0 | 118.79 | 129.11 | 153.82 | 181.49 | 206.07 | 231.54 | 253.73 | 277.24 | 334.19 | 384.8 | 448.28 | 524.54 | 585.39 | 712.06 | 842.01 | 1090.17 | 1279.13 | 1584.41 | 1928.82 | 2318.43 | 2813.84 |
| 496.0 | 116.9 | 126.73 | 151.19 | 178.67 | 202.97 | 228.12 | 249.98 | 273.29 | 329.62 | 379.21 | 442.1 | 517.32 | 577.44 | 702.77 | 830.79 | 1075.65 | 1262.55 | 1564.73 | 1904.17 | 2289.98 | 2781.14 |
| 497.0 | 114.65 | 124.44 | 148.46 | 175.23 | 199.43 | 223.98 | 245.49 | 268.75 | 324.02 | 373 | 435 | 508.81 | 567.8 | 691.59 | 817.13 | 1057.92 | 1241.93 | 1540.12 | 1874.6 | 2256.06 | 2739.98 |
| 498.0 | 112.12 | 121.81 | 145.32 | 171.39 | 195.54 | 219.39 | 240.85 | 263.42 | 317.9 | 365.72 | 426.77 | 499.42 | 557.39 | 678.52 | 802.12 | 1037.73 | 1219.18 | 1512.37 | 1840.49 | 2216.33 | 2692.07 |
| 499.0 | 109.64 | 119.04 | 141.84 | 167.61 | 191.09 | 214.74 | 235.57 | 257.8 | 310.96 | 357.6 | 417.84 | 488.98 | 545.61 | 665.14 | 785.56 | 1016.62 | 1194.29 | 1482.12 | 1803.41 | 2172.7 | 2639.96 |
| 500.0 | 107.1 | 116.08 | 138.44 | 163.47 | 186.39 | 209.68 | 229.97 | 251.88 | 303.62 | 349.33 | 407.92 | 477.4 | 533.08 | 649.99 | 767.54 | 993.28 | 1167.04 | 1448.77 | 1763.57 | 2124.16 | 2582.62 |
| 501.0 | 104.42 | 113.09 | 134.9 | 159.37 | 181.85 | 204.6 | 224.28 | 245.61 | 296.05 | 340.76 | 397.91 | 465.91 | 519.88 | 634.33 | 748.77 | 968.94 | 1138.3 | 1413.96 | 1720.55 | 2073.77 | 2520.83 |
| 502.0 | 101.47 | 110 | 131.3 | 154.95 | 176.87 | 199.11 | 218.25 | 238.75 | 287.91 | 331.65 | 387.12 | 453.39 | 505.81 | 617.19 | 728.54 | 942.45 | 1107.33 | 1375.78 | 1674.99 | 2018.45 | 2453.58 |
| 503.0 | 98.73 | 107.03 | 127.5 | 150.47 | 171.8 | 193.38 | 211.81 | 231.88 | 279.91 | 322.29 | 376.13 | 440.46 | 491.26 | 599.4 | 707.38 | 914.68 | 1075.58 | 1336.33 | 1626.58 | 1960.31 | 2383.85 |
| 504.0 | 95.81 | 103.94 | 123.58 | 145.83 | 166.67 | 187.62 | 205.21 | 224.62 | 271.42 | 312.47 | 364.7 | 426.96 | 476.22 | 580.92 | 685.62 | 886 | 1042.35 | 1294.88 | 1576.49 | 1900.67 | 2311.9 |
| 505.0 | 92.79 | 100.63 | 119.54 | 141.11 | 161.22 | 181.67 | 198.67 | 217.34 | 262.56 | 301.96 | 352.87 | 413.15 | 460.67 | 561.61 | 662.83 | 856.46 | 1007.57 | 1251.25 | 1523.62 | 1837.82 | 2236.01 |
| 506.0 | 89.6 | 97.27 | 115.57 | 136.46 | 155.9 | 175.63 | 191.92 | 209.96 | 253.52 | 291.49 | 340.67 | 398.64 | 444.55 | 542.42 | 639.86 | 826.29 | 972.19 | 1207.26 | 1469.27 | 1773.1 | 2158.37 |
| 507.0 | 86.53 | 94.51 | 111.72 | 131.81 | 150.49 | 169.53 | 185.23 | 202.65 | 244.65 | 281.22 | 328.37 | 384.45 | 428.83 | 522.75 | 616.44 | 795.78 | 935.93 | 1162.9 | 1414.66 | 1706.89 | 2078.05 |
| 508.0 | 83.76 | 91.48 | 107.84 | 127.27 | 145.29 | 163.48 | 178.59 | 195.29 | 235.48 | 270.98 | 316.36 | 369.98 | 412.7 | 502.8 | 592.25 | 764.38 | 899.07 | 1116.6 | 1357.98 | 1639.16 | 1995.55 |
| 509.0 | 81.12 | 88.37 | 104.09 | 122.62 | 140 | 157.38 | 172 | 188.28 | 226.57 | 260.66 | 303.93 | 355.48 | 396.55 | 482.75 | 569.06 | 733.02 | 862.25 | 1070.34 | 1301.12 | 1570.68 | 1912.57 |
| 510.0 | 78.35 | 85.48 | 100.41 | 118.12 | 134.81 | 151.2 | 165.77 | 181.1 | 217.43 | 250.23 | 291.56 | 340.82 | 380.21 | 462.6 | 545.21 | 701.3 | 825.16 | 1023.23 | 1243.55 | 1500.93 | 1827.64 |
| 511.0 | 75.87 | 82.65 | 96.83 | 113.68 | 129.92 | 145.3 | 159.59 | 173.96 | 208.78 | 240.25 | 279.25 | 326.39 | 363.95 | 442.44 | 521.1 | 669.41 | 787.89 | 976.4 | 1186.09 | 1430.72 | 1742.79 |
| 512.0 | 73.28 | 79.79 | 93.22 | 109.39 | 124.68 | 139.45 | 152.97 | 166.78 | 200.16 | 230.03 | 267.12 | 311.91 | 347.86 | 422.33 | 497.46 | 638.22 | 750.84 | 929.64 | 1128.66 | 1360.76 | 1657.87 |
| 513.0 | 70.77 | 76.87 | 89.83 | 105.15 | 119.76 | 133.85 | 146.6 | 159.49 | 191.38 | 219.7 | 255.18 | 297.86 | 331.46 | 402.62 | 473.74 | 606.5 | 713.61 | 883.03 | 1070.53 | 1290.92 | 1572.54 |
| 514.0 | 68.31 | 74.12 | 86.43 | 100.99 | 114.84 | 128.15 | 140.38 | 152.53 | 182.76 | 209.87 | 242.81 | 283.71 | 315.54 | 382.93 | 449.89 | 575.53 | 676.86 | 836.38 | 1013.5 | 1221.39 | 1488.02 |
| 515.0 | 65.91 | 71.25 | 83.17 | 97 | 110.03 | 122.77 | 134.45 | 145.35 | 174.29 | 199.95 | 231.34 | 269.75 | 299.71 | 363.62 | 426.79 | 545.31 | 640.75 | 790.96 | 957.22 | 1153.33 | 1404.27 |
| 516.0 | 63.77 | 68.69 | 80.06 | 93.2 | 105.58 | 117.42 | 129.09 | 139.02 | 166.07 | 190.4 | 220.09 | 256.27 | 284.19 | 344.68 | 404.42 | 515.67 | 605.31 | 746.48 | 901.65 | 1086.37 | 1321.83 |
| 517.0 | 61.56 | 66.3 | 77.08 | 89.62 | 101.27 | 112.46 | 123.64 | 132.75 | 158.11 | 181.28 | 209.21 | 243.3 | 269.42 | 326.28 | 382.43 | 486.93 | 571.08 | 702.7 | 847.94 | 1021.36 | 1240.58 |
| 518.0 | 59.48 | 63.84 | 74.16 | 86.23 | 97.12 | 107.8 | 118.2 | 126.65 | 150.45 | 172.17 | 198.46 | 230.48 | 255.17 | 308.35 | 361.24 | 459.19 | 537.62 | 660.46 | 795.41 | 957.12 | 1161.39 |
| 519.0 | 57.68 | 61.87 | 71.69 | 83.18 | 93.05 | 103.56 | 113.05 | 120.93 | 143.24 | 163.68 | 188.15 | 217.82 | 241.02 | 291.22 | 340.47 | 431.92 | 504.71 | 618.8 | 744.8 | 894.78 | 1085.13 |
| 520.0 | 55.85 | 59.97 | 69.4 | 80.01 | 89.31 | 99.31 | 107.96 | 115.41 | 136.39 | 155.7 | 178.19 | 206.05 | 227.46 | 274.47 | 320.49 | 405.29 | 472.88 | 578.61 | 695.19 | 834.6 | 1010.81 |
| 521.0 | 54.06 | 58.06 | 67.02 | 77.03 | 85.77 | 95.16 | 103.2 | 110.08 | 129.84 | 147.87 | 168.78 | 194.93 | 214.43 | 258.2 | 301.09 | 379.9 | 442.5 | 540.19 | 647.05 | 776.74 | 938.59 |
| 522.0 | 52.52 | 56.28 | 64.76 | 74.27 | 82.44 | 91.38 | 98.71 | 105.15 | 123.68 | 140.51 | 159.97 | 184.21 | 202.26 | 243.14 | 282.56 | 355.59 | 413.38 | 503.27 | 601.69 | 720.91 | 869.93 |
| 523.0 | 51.07 | 54.5 | 62.61 | 71.62 | 79.22 | 87.69 | 94.62 | 100.55 | 117.81 | 133.43 | 151.34 | 173.69 | 190.69 | 228.29 | 264.82 | 332.17 | 385.59 | 467.92 | 558.03 | 667.91 | 804.68 |
| 524.0 | 49.75 | 53 | 60.87 | 69.32 | 76.53 | 84.39 | 90.81 | 96.22 | 112.54 | 126.9 | 143.31 | 164.13 | 179.85 | 214.71 | 248.41 | 310.81 | 359.05 | 434.49 | 517.37 | 617.87 | 742.49 |
| 525.0 | 48.68 | 51.61 | 59.16 | 67.21 | 73.94 | 81.21 | 87.6 | 92.34 | 107.69 | 121 | 136.2 | 155.33 | 169.8 | 201.98 | 232.99 | 290.48 | 334.47 | 403.56 | 478.95 | 570.55 | 684.11 |
| 526.0 | 47.6 | 50.44 | 57.72 | 65.21 | 71.64 | 78.29 | 84.4 | 88.89 | 103.03 | 115.59 | 129.44 | 147.21 | 160.23 | 190.09 | 218.32 | 271.69 | 311.61 | 374.4 | 443.06 | 526.38 | 629.13 |
| 527.0 | 46.77 | 49.43 | 56.4 | 63.58 | 69.5 | 75.8 | 81.55 | 85.39 | 98.87 | 110.39 | 123.23 | 139.67 | 151.56 | 178.9 | 205 | 253.99 | 290.65 | 347.62 | 410.24 | 485.05 | 578.2 |
| 528.0 | 46.16 | 48.38 | 55.37 | 62.09 | 67.76 | 73.79 | 79.07 | 82.8 | 95.18 | 105.75 | 117.93 | 132.98 | 143.64 | 169.06 | 192.87 | 238.21 | 271.56 | 323.14 | 379.98 | 447.59 | 531.25 |
| 529.0 | 45.45 | 47.7 | 54.41 | 60.76 | 66.1 | 71.84 | 76.93 | 80.2 | 91.81 | 101.61 | 112.7 | 126.63 | 136.34 | 159.95 | 182.23 | 223.75 | 254.02 | 301.02 | 352.45 | 413.33 | 488.93 |
| 530.0 | 44.93 | 47.16 | 53.61 | 59.84 | 64.88 | 70.24 | 75.08 | 77.82 | 88.97 | 98.08 | 108.41 | 121.14 | 130.07 | 151.95 | 172.17 | 211.02 | 238.28 | 281.05 | 327.83 | 382.67 | 451.07 |
| 531.0 | 44.31 | 46.62 | 52.7 | 59.06 | 63.71 | 68.81 | 73.23 | 75.63 | 86.39 | 94.9 | 104.33 | 116.32 | 124.49 | 144.91 | 163.49 | 199.56 | 224.18 | 263.36 | 305.67 | 355.44 | 417.26 |
| 532.0 | 43.99 | 46.23 | 52.29 | 58.08 | 62.79 | 67.76 | 71.75 | 73.93 | 84.29 | 92.18 | 101.1 | 112.24 | 119.75 | 138.68 | 155.92 | 189.84 | 211.99 | 247.61 | 286.46 | 331.62 | 387.6 |
| 533.0 | 43.7 | 45.92 | 51.92 | 57.41 | 62.16 | 66.86 | 70.45 | 72.6 | 82.51 | 90.01 | 98.33 | 108.91 | 115.58 | 133.56 | 149.41 | 181.23 | 201.61 | 234.36 | 269.74 | 311.16 | 361.94 |
| 534.0 | 43.6 | 45.68 | 51.57 | 56.95 | 61.49 | 66.12 | 69.48 | 71.56 | 81.06 | 88.16 | 96 | 106.11 | 112.39 | 129.19 | 143.94 | 174.21 | 192.7 | 222.92 | 255.59 | 294.13 | 340.52 |
| 535.0 | 43.6 | 45.7 | 51.6 | 56.87 | 61.22 | 65.67 | 68.81 | 70.86 | 80.05 | 86.98 | 94.76 | 104.38 | 110.02 | 125.92 | 139.85 | 168.57 | 185.74 | 213.79 | 244.6 | 280.22 | 322.93 |
| 536.0 | 43.88 | 45.9 | 51.88 | 56.95 | 61.21 | 65.65 | 68.51 | 70.75 | 79.62 | 86.19 | 93.69 | 103.19 | 108.54 | 123.6 | 136.53 | 164.53 | 180.22 | 207.02 | 235.93 | 269.17 | 309.19 |
| 537.0 | 43.96 | 46.14 | 52.12 | 57.04 | 61.19 | 65.75 | 68.08 | 70.47 | 79.41 | 85.78 | 93.23 | 102.28 | 107.51 | 121.9 | 134.72 | 161.5 | 176.18 | 201.74 | 229.8 | 260.91 | 299.3 |
| 538.0 | 44.12 | 46.37 | 52.3 | 57.41 | 61.42 | 65.83 | 67.95 | 70.66 | 79.45 | 85.68 | 93.2 | 101.94 | 107.08 | 121.01 | 133.69 | 159.7 | 173.82 | 198.61 | 226.1 | 255.75 | 293.01 |
| 539.0 | 44.45 | 46.9 | 52.71 | 57.99 | 61.85 | 66.26 | 68.43 | 71.14 | 79.83 | 86.33 | 93.61 | 102.47 | 107.22 | 121.15 | 133.67 | 159.21 | 173.2 | 197.42 | 224.51 | 253.58 | 290.04 |
| 540.0 | 44.84 | 47.28 | 53.13 | 58.49 | 62.44 | 66.67 | 68.71 | 71.88 | 80.53 | 86.99 | 94.48 | 103.39 | 108.05 | 121.86 | 134.58 | 159.93 | 173.93 | 198.04 | 224.96 | 254.01 | 290.2 |
| 541.0 | 45.41 | 47.8 | 53.68 | 59.1 | 63.27 | 67.3 | 69.67 | 72.4 | 81.52 | 88.06 | 95.74 | 104.59 | 109.56 | 123.24 | 136.11 | 161.76 | 176.22 | 200.23 | 227.7 | 256.71 | 293.24 |
| 542.0 | 45.99 | 48.43 | 54.41 | 60.05 | 64.08 | 68.2 | 70.86 | 73.5 | 82.79 | 89.38 | 97.38 | 106.25 | 111.53 | 125.5 | 138.54 | 164.45 | 179.56 | 203.79 | 232.48 | 261.66 | 299.43 |
| 543.0 | 46.64 | 49.14 | 55.18 | 61 | 65.19 | 69.07 | 72.13 | 74.83 | 84.32 | 91.09 | 99.3 | 108.4 | 113.93 | 128.26 | 141.88 | 168.57 | 184.06 | 209.06 | 239.11 | 269.07 | 308.2 |
| 544.0 | 47.24 | 50.07 | 55.98 | 61.9 | 66.26 | 70.23 | 73.4 | 76.32 | 85.97 | 93.05 | 101.45 | 111.05 | 116.45 | 131.45 | 145.77 | 173.41 | 189.44 | 215.77 | 246.87 | 278.18 | 319.48 |
| 545.0 | 47.94 | 50.82 | 56.72 | 62.91 | 67.41 | 71.54 | 74.73 | 77.7 | 87.61 | 95.22 | 103.99 | 113.95 | 119.39 | 135.18 | 150.04 | 178.81 | 195.99 | 223.72 | 256.13 | 289.26 | 333.02 |
| 546.0 | 48.6 | 51.67 | 57.59 | 64 | 68.67 | 72.83 | 76 | 79.22 | 89.26 | 97.26 | 106.36 | 116.93 | 122.78 | 139.06 | 154.59 | 184.8 | 203.01 | 232.47 | 266.81 | 301.92 | 348.3 |
| 547.0 | 49.4 | 52.42 | 58.66 | 65.24 | 70.03 | 74.14 | 77.54 | 80.86 | 91.56 | 99.36 | 109.01 | 120.12 | 126.52 | 143.67 | 159.64 | 191.31 | 210.88 | 242.15 | 278.47 | 316.1 | 365.6 |
| 548.0 | 50.29 | 53.28 | 59.67 | 66.51 | 71.34 | 75.56 | 79.15 | 82.75 | 93.75 | 101.8 | 112.04 | 123.76 | 130.66 | 148.56 | 165.35 | 198.62 | 219.37 | 252.73 | 291.29 | 331.47 | 384.69 |
| 549.0 | 51.01 | 53.92 | 60.41 | 67.58 | 72.49 | 76.67 | 80.75 | 84.41 | 95.92 | 104.32 | 114.78 | 127.1 | 134.64 | 153.46 | 170.97 | 206.03 | 228.09 | 263.83 | 304.34 | 347.61 | 404.6 |
| 550.0 | 51.92 | 54.57 | 61.44 | 68.74 | 73.9 | 78.27 | 82.3 | 86.21 | 98.21 | 106.75 | 118.15 | 130.94 | 138.87 | 158.48 | 176.82 | 214.01 | 237.06 | 275.27 | 318.46 | 364.66 | 425.6 |
| 551.0 | 52.8 | 55.4 | 62.59 | 69.99 | 75.23 | 79.83 | 83.98 | 88.06 | 100.54 | 109.35 | 121.33 | 134.75 | 143 | 163.93 | 183.13 | 222.01 | 246.65 | 287.37 | 332.75 | 382.3 | 447.29 |
| 552.0 | 53.71 | 56.12 | 63.68 | 71.23 | 76.58 | 81.08 | 85.66 | 89.88 | 102.84 | 112.03 | 124.55 | 138.63 | 147.32 | 169.14 | 189.48 | 230.32 | 256.4 | 299.46 | 347.76 | 400.18 | 469.38 |
| 553.0 | 54.19 | 56.9 | 64.61 | 72.59 | 77.73 | 82.44 | 87.21 | 91.75 | 104.93 | 114.46 | 127.58 | 142.25 | 151.6 | 174.37 | 195.73 | 238.3 | 266.18 | 311.45 | 362.65 | 418.39 | 491.69 |
| 554.0 | 54.89 | 57.7 | 65.48 | 73.79 | 79.05 | 83.89 | 88.88 | 93.65 | 107.15 | 117.11 | 130.9 | 146.14 | 155.75 | 179.61 | 201.94 | 246.37 | 275.82 | 323.86 | 377.66 | 436.46 | 514.47 |
| 555.0 | 55.39 | 58.3 | 66.42 | 74.67 | 80.21 | 85.2 | 90.41 | 95.14 | 109.14 | 119.7 | 133.95 | 149.68 | 159.69 | 184.41 | 208.44 | 254.12 | 285.28 | 336.2 | 392.6 | 454.48 | 536.66 |
| 556.0 | 56.11 | 58.96 | 67.34 | 75.68 | 81.39 | 86.55 | 92.04 | 96.96 | 110.96 | 122.29 | 136.83 | 153.02 | 163.65 | 189.21 | 214.15 | 261.74 | 294.84 | 347.99 | 407.1 | 472.53 | 558.07 |
| 557.0 | 56.37 | 59.49 | 67.93 | 76.5 | 82.41 | 87.65 | 93.36 | 98.45 | 112.75 | 124.51 | 139.34 | 155.96 | 167.19 | 193.67 | 219.87 | 269.1 | 303.7 | 359.45 | 420.9 | 489.51 | 579.42 |
| 558.0 | 56.98 | 60.03 | 68.36 | 77.32 | 83.26 | 88.66 | 94.6 | 99.88 | 114.56 | 126.4 | 141.67 | 158.88 | 170.56 | 197.92 | 225.04 | 276.14 | 312.38 | 370.38 | 434.24 | 505.78 | 599.67 |
| 559.0 | 57.58 | 60.56 | 68.91 | 77.8 | 84.18 | 89.65 | 95.71 | 100.9 | 116.16 | 128.37 | 143.95 | 161.61 | 173.9 | 202.05 | 230.12 | 282.84 | 320.48 | 380.79 | 446.92 | 521.42 | 619.05 |
| 560.0 | 58.09 | 60.86 | 69.42 | 78.4 | 84.97 | 90.61 | 96.66 | 101.93 | 117.7 | 129.82 | 146.15 | 164.03 | 177.07 | 205.85 | 234.77 | 288.79 | 327.85 | 390.26 | 458.85 | 536.07 | 637.31 |
| 561.0 | 58.39 | 61.23 | 69.8 | 78.88 | 85.68 | 91.43 | 97.68 | 102.9 | 118.95 | 131.37 | 147.88 | 166.39 | 179.69 | 209.04 | 238.59 | 294.63 | 334.63 | 399.18 | 469.42 | 549.79 | 654.34 |
| 562.0 | 58.56 | 61.38 | 70.12 | 79.25 | 86.11 | 91.96 | 98.3 | 103.8 | 119.81 | 132.43 | 149.38 | 168.37 | 181.87 | 211.7 | 242.25 | 299.48 | 340.5 | 407.02 | 478.99 | 562.07 | 669.76 |
| 563.0 | 58.59 | 61.53 | 70.13 | 79.33 | 86.32 | 92.35 | 98.5 | 104.11 | 120.57 | 133.48 | 150.56 | 169.99 | 183.87 | 214 | 245.19 | 304.07 | 345.57 | 414.01 | 487.53 | 572.81 | 683.13 |
| 564.0 | 58.45 | 61.57 | 70.19 | 79.43 | 86.37 | 92.67 | 98.63 | 104.29 | 120.91 | 134.04 | 151.49 | 171.28 | 185.28 | 215.79 | 247.52 | 307.31 | 349.87 | 419.91 | 494.81 | 581.93 | 695.39 |
| 565.0 | 58.46 | 61.37 | 70.25 | 79.45 | 86.63 | 92.87 | 98.73 | 104.42 | 121.41 | 134.49 | 152.27 | 171.99 | 186.72 | 217.43 | 249.87 | 310.36 | 353.86 | 424.69 | 501.34 | 589.95 | 705.76 |
| 566.0 | 58.38 | 61.25 | 70.34 | 79.3 | 86.49 | 92.83 | 98.84 | 104.58 | 121.58 | 134.56 | 152.56 | 172.48 | 187.55 | 218.62 | 251.41 | 312.74 | 356.75 | 428.6 | 506.5 | 596.65 | 713.76 |
| 567.0 | 58.22 | 61.13 | 70.36 | 79.06 | 86 | 92.94 | 98.59 | 104.47 | 121.73 | 134.72 | 152.92 | 172.83 | 187.98 | 219.58 | 252.55 | 314.35 | 359.08 | 431.57 | 510.2 | 601.63 | 720.14 |
| 568.0 | 57.95 | 60.77 | 69.85 | 78.51 | 85.78 | 92.69 | 98.17 | 103.98 | 121.28 | 134.53 | 152.81 | 172.69 | 187.69 | 219.61 | 253 | 314.83 | 359.99 | 433.3 | 512.68 | 604.74 | 724.71 |
| 569.0 | 57.73 | 60.5 | 69.41 | 78.19 | 85.51 | 92.39 | 97.73 | 103.52 | 120.8 | 134.3 | 152.33 | 172.41 | 187.2 | 219.24 | 252.9 | 314.81 | 360.1 | 433.89 | 513.82 | 606.54 | 727.15 |
| 570.0 | 57.38 | 60.27 | 69.06 | 77.87 | 84.97 | 92 | 97.22 | 103.02 | 120.08 | 133.78 | 151.65 | 171.76 | 186.51 | 218.3 | 252.29 | 314.25 | 359.55 | 433.47 | 513.92 | 606.89 | 727.8 |
| 571.0 | 56.82 | 59.62 | 68.48 | 77.23 | 84.34 | 91.09 | 96.51 | 102.29 | 119.18 | 133.09 | 150.33 | 170.74 | 185.58 | 217.14 | 251.09 | 312.76 | 358.28 | 432.18 | 512.41 | 605.56 | 726.74 |
| 572.0 | 56.07 | 58.99 | 67.66 | 76.39 | 83.51 | 90.16 | 95.77 | 101.39 | 118.1 | 131.97 | 149.04 | 169.26 | 184.2 | 215.14 | 249 | 310.74 | 356.3 | 429.66 | 509.89 | 602.85 | 723.55 |
| 573.0 | 55.64 | 58.48 | 67.04 | 75.59 | 82.92 | 89.62 | 94.92 | 100.67 | 117.1 | 130.77 | 147.71 | 167.69 | 182.59 | 213.41 | 246.79 | 308.15 | 353.67 | 426.71 | 506.34 | 599.12 | 719.41 |
| 574.0 | 55.19 | 57.9 | 66.27 | 74.79 | 82.05 | 88.56 | 93.89 | 99.57 | 115.83 | 129.37 | 146.15 | 165.85 | 180.43 | 211.17 | 244.24 | 304.97 | 350.21 | 422.97 | 501.55 | 593.55 | 712.76 |
| 575.0 | 54.65 | 57.26 | 65.32 | 73.82 | 81.09 | 87.48 | 92.75 | 98.26 | 114.24 | 127.68 | 144.12 | 163.61 | 178.2 | 208.51 | 241.17 | 301.29 | 346.02 | 417.96 | 495.89 | 587 | 704.77 |
| 576.0 | 54.22 | 56.83 | 64.61 | 73.18 | 80.27 | 86.44 | 91.64 | 97.18 | 112.85 | 126 | 142.16 | 161.38 | 176.04 | 205.81 | 237.57 | 297.69 | 341.6 | 412.72 | 489.8 | 579.76 | 696.28 |
| 577.0 | 53.6 | 56.24 | 63.64 | 72.33 | 79.21 | 85.34 | 90.35 | 95.58 | 111.37 | 123.89 | 140.1 | 158.79 | 173.4 | 202.62 | 234.16 | 293.69 | 336.34 | 406.63 | 482.84 | 571.05 | 686.44 |
| 578.0 | 53.23 | 55.61 | 62.86 | 71.53 | 78.28 | 84.24 | 89.18 | 94.29 | 109.93 | 122.05 | 138.01 | 156.56 | 170.77 | 199.39 | 230.4 | 288.76 | 331.18 | 400.16 | 475.26 | 562.08 | 675.29 |
| 579.0 | 52.58 | 54.91 | 62.15 | 70.47 | 77.26 | 83.12 | 88.18 | 93.13 | 108.19 | 120.35 | 135.7 | 153.96 | 167.93 | 196.07 | 226.39 | 283.66 | 325.51 | 393.29 | 467.37 | 552.39 | 663.19 |
| 580.0 | 52.1 | 54.45 | 61.64 | 69.8 | 76.24 | 82.06 | 87.18 | 92.1 | 106.7 | 118.38 | 133.37 | 151.58 | 165.03 | 192.77 | 222.33 | 278.7 | 319.6 | 385.81 | 458.48 | 542 | 650.54 |
| 581.0 | 51.62 | 54.06 | 61.12 | 68.93 | 75.11 | 80.96 | 85.99 | 90.94 | 105.18 | 116.73 | 131.24 | 148.99 | 161.9 | 189.17 | 218.05 | 273.85 | 313.6 | 378.35 | 449.69 | 531.14 | 637.79 |
| 582.0 | 51.18 | 53.37 | 60.41 | 68.15 | 74.06 | 79.85 | 84.82 | 89.55 | 103.49 | 114.77 | 129.14 | 146.33 | 158.96 | 185.78 | 213.81 | 268.44 | 307.34 | 370.55 | 440.87 | 520.07 | 624.06 |
| 583.0 | 50.7 | 52.87 | 59.78 | 67.43 | 73.1 | 78.83 | 83.62 | 88.34 | 101.98 | 113.1 | 127.11 | 143.73 | 156.07 | 182.39 | 209.58 | 263.36 | 301.24 | 363.01 | 431.84 | 508.76 | 610.43 |
| 584.0 | 50.28 | 52.25 | 59.14 | 66.73 | 72.45 | 77.81 | 82.73 | 87.17 | 100.39 | 111.27 | 125.01 | 141.27 | 153.06 | 178.93 | 205.71 | 258 | 295.36 | 355.25 | 422.76 | 497.72 | 597.26 |
| 585.0 | 50 | 51.87 | 58.6 | 66.06 | 71.77 | 76.88 | 81.76 | 86.17 | 99.06 | 109.83 | 123.03 | 138.89 | 150.43 | 175.73 | 201.6 | 252.96 | 289.66 | 347.75 | 413.93 | 486.72 | 583.62 |
| 586.0 | 49.77 | 51.69 | 58.07 | 65.46 | 70.88 | 76.09 | 80.91 | 85.25 | 97.47 | 108.14 | 121.08 | 136.86 | 147.79 | 172.55 | 197.57 | 248.01 | 283.53 | 340.47 | 404.64 | 475.96 | 570.44 |
| 587.0 | 49.49 | 51.39 | 57.73 | 65.14 | 70.12 | 75.37 | 80.17 | 84.39 | 96.47 | 106.79 | 119.41 | 134.75 | 145.41 | 169.42 | 194.01 | 243.01 | 277.97 | 333.36 | 395.94 | 465.31 | 557.96 |
| 588.0 | 49.16 | 51.16 | 57.42 | 64.71 | 69.59 | 74.53 | 79.49 | 83.45 | 95.26 | 105.44 | 117.81 | 132.81 | 143.09 | 166.4 | 190.57 | 238.42 | 272.48 | 326.53 | 387.79 | 455.37 | 545.83 |
| 589.0 | 48.89 | 51.02 | 57.19 | 64.41 | 69.01 | 73.96 | 78.98 | 82.8 | 94.35 | 104.42 | 116.36 | 131.16 | 141.3 | 163.74 | 187.6 | 234.48 | 267.67 | 320.5 | 380.02 | 446.34 | 534.08 |
| 590.0 | 48.7 | 50.86 | 57 | 64.03 | 68.6 | 73.42 | 78.47 | 82.16 | 93.58 | 103.32 | 114.97 | 129.33 | 139.52 | 161.41 | 184.56 | 230.76 | 263.41 | 314.94 | 372.98 | 437.79 | 523.04 |
| 591.0 | 48.65 | 50.67 | 56.96 | 63.73 | 68.34 | 73.14 | 78.03 | 81.48 | 92.78 | 102.38 | 113.97 | 128.01 | 137.84 | 159.62 | 182.03 | 227.41 | 259.3 | 309.53 | 366.42 | 429.73 | 513.48 |
| 592.0 | 48.76 | 51.03 | 57.12 | 63.78 | 68.32 | 73.2 | 77.97 | 81.15 | 92.61 | 101.8 | 113.41 | 127.1 | 136.32 | 157.99 | 179.91 | 224.72 | 256 | 305.38 | 360.99 | 422.81 | 504.99 |
| 593.0 | 49.01 | 51.18 | 57.1 | 63.79 | 68.3 | 73.18 | 77.71 | 80.85 | 92.32 | 101.24 | 112.59 | 126.32 | 135.21 | 156.72 | 178.24 | 222.33 | 252.9 | 301.42 | 356.18 | 416.73 | 497.34 |
| 594.0 | 49.05 | 51.49 | 57.28 | 63.84 | 68.05 | 73.18 | 77.59 | 80.76 | 92.21 | 101.29 | 112.16 | 125.81 | 134.44 | 155.56 | 176.94 | 220.45 | 250.37 | 298.37 | 352.01 | 411.63 | 490.84 |
| 595.0 | 49.28 | 51.8 | 57.42 | 64 | 68.23 | 73.57 | 77.72 | 80.91 | 92.2 | 101.29 | 111.97 | 125.57 | 134.04 | 154.99 | 175.96 | 219.08 | 248.49 | 295.9 | 349.08 | 407.8 | 486.07 |
| 596.0 | 49.49 | 52.06 | 57.88 | 64.39 | 68.51 | 73.88 | 78.01 | 81.31 | 92.46 | 101.48 | 111.92 | 125.49 | 133.87 | 154.63 | 175.55 | 218.32 | 247.34 | 294.08 | 346.92 | 405.17 | 482.38 |
| 597.0 | 49.75 | 52.35 | 58.36 | 64.87 | 68.95 | 74.17 | 78.58 | 81.77 | 92.87 | 102.04 | 112.49 | 125.88 | 133.98 | 154.59 | 175.38 | 217.85 | 246.44 | 293.01 | 345.54 | 403.28 | 479.52 |
| 598.0 | 50.04 | 52.69 | 58.68 | 65.08 | 69.33 | 74.71 | 78.94 | 82.4 | 93.13 | 102.76 | 112.86 | 126.29 | 134.5 | 154.88 | 175.68 | 217.81 | 246.3 | 292.55 | 344.72 | 402.27 | 478.35 |
| 599.0 | 50.51 | 53.21 | 59.15 | 65.58 | 69.82 | 75.14 | 79.51 | 83.11 | 93.79 | 103.43 | 113.68 | 126.96 | 135.03 | 155.73 | 176.32 | 218.76 | 246.6 | 292.98 | 345.54 | 402.85 | 478.62 |
| 600.0 | 51.08 | 53.79 | 59.86 | 66.39 | 70.56 | 75.96 | 80.15 | 83.78 | 94.55 | 104.34 | 114.78 | 128.26 | 136.1 | 156.91 | 177.61 | 220.08 | 247.92 | 294.59 | 346.53 | 404.36 | 480.63 |
| 601.0 | 51.45 | 54.14 | 60.38 | 67.06 | 71.19 | 76.83 | 80.82 | 84.39 | 95.29 | 105.4 | 116.04 | 129.33 | 137.2 | 158.1 | 179.09 | 221.57 | 249.68 | 296.94 | 349.1 | 407.04 | 484.04 |
| 602.0 | 51.85 | 54.56 | 60.77 | 67.7 | 71.91 | 77.67 | 81.73 | 85.14 | 96.19 | 106.27 | 117.24 | 130.58 | 138.77 | 159.78 | 181.06 | 223.62 | 252.25 | 299.66 | 352.13 | 410.82 | 488.43 |
| 603.0 | 52.55 | 55.44 | 61.74 | 68.61 | 72.94 | 78.74 | 82.88 | 86.3 | 97.63 | 107.79 | 118.89 | 132.4 | 140.86 | 161.94 | 183.5 | 226.62 | 255.54 | 303.43 | 356.59 | 415.72 | 494.5 |
| 604.0 | 53.1 | 56.07 | 62.37 | 69.39 | 73.92 | 79.86 | 83.93 | 87.69 | 98.96 | 109.16 | 120.36 | 134.13 | 143.05 | 164.34 | 186.31 | 229.85 | 259.21 | 307.7 | 361.93 | 422.23 | 501.59 |
| 605.0 | 53.88 | 56.87 | 63.14 | 70.34 | 74.8 | 80.92 | 85 | 89.11 | 100.35 | 110.65 | 122.31 | 136.27 | 145.43 | 167.04 | 189.41 | 233.45 | 263.55 | 312.96 | 367.96 | 429.79 | 510.48 |
| 606.0 | 54.52 | 57.72 | 64.04 | 71.35 | 75.96 | 82.23 | 86.45 | 90.58 | 102.02 | 112.36 | 124.53 | 138.71 | 148.03 | 170.14 | 193.05 | 237.73 | 268.18 | 318.87 | 374.88 | 438.33 | 520.62 |
| 607.0 | 55.21 | 58.42 | 65.04 | 72.53 | 77.16 | 83.25 | 87.76 | 91.94 | 104.07 | 114.29 | 126.95 | 141.36 | 150.85 | 173.54 | 196.88 | 242.43 | 273.81 | 325.57 | 383.03 | 447.88 | 531.74 |
| 608.0 | 55.96 | 59.21 | 65.89 | 73.34 | 78.52 | 84.52 | 88.97 | 93.43 | 105.57 | 116.25 | 129.48 | 144.2 | 153.99 | 177.07 | 201.02 | 247.36 | 279.51 | 332.81 | 391.83 | 458.34 | 544.49 |
| 609.0 | 56.84 | 59.91 | 66.71 | 74.36 | 79.84 | 85.88 | 90.47 | 95.15 | 107.4 | 118.4 | 131.82 | 146.95 | 157.25 | 180.77 | 205.4 | 252.73 | 285.76 | 340.61 | 401.02 | 469.72 | 557.95 |
| 610.0 | 57.67 | 60.91 | 67.87 | 75.57 | 81.14 | 87.42 | 92 | 96.88 | 109.43 | 120.55 | 134.49 | 150.06 | 160.62 | 184.97 | 210.15 | 258.61 | 292.65 | 349 | 411.06 | 481.94 | 573 |
| 611.0 | 58.32 | 61.63 | 68.86 | 76.49 | 82.13 | 88.83 | 93.55 | 98.52 | 111.2 | 122.72 | 137.21 | 153.34 | 164.06 | 189.2 | 214.98 | 264.38 | 299.73 | 357.47 | 421.6 | 494.47 | 589.05 |
| 612.0 | 58.95 | 62.48 | 69.81 | 77.66 | 83.52 | 90.05 | 95.12 | 100.49 | 113.36 | 124.9 | 139.75 | 156.53 | 167.82 | 193.43 | 219.99 | 270.52 | 307.09 | 366.75 | 433 | 508.06 | 605.66 |
| 613.0 | 59.77 | 63.31 | 70.67 | 78.82 | 84.74 | 91.38 | 96.65 | 102.2 | 115.32 | 127.38 | 142.49 | 159.82 | 171.58 | 197.7 | 225.58 | 277.04 | 314.97 | 375.99 | 444.73 | 522.05 | 622.68 |
| 614.0 | 60.61 | 64.02 | 71.8 | 79.86 | 86.02 | 92.72 | 98.14 | 104 | 117.35 | 129.88 | 145.51 | 163.28 | 175.35 | 202.23 | 230.87 | 283.64 | 322.93 | 385.84 | 456.66 | 536.8 | 640.48 |
| 615.0 | 61.38 | 64.73 | 72.64 | 80.92 | 87.25 | 93.92 | 99.76 | 105.69 | 119.1 | 131.91 | 148.34 | 166.61 | 179.15 | 206.8 | 236.49 | 290.47 | 330.99 | 395.59 | 469.22 | 552.12 | 659.13 |
| 616.0 | 62.17 | 65.23 | 73.49 | 82.01 | 88.67 | 95.21 | 101.39 | 107.28 | 121.06 | 134.26 | 151.09 | 169.87 | 183.02 | 211.1 | 241.92 | 297.38 | 338.96 | 405.47 | 481.82 | 567.51 | 678.45 |
| 617.0 | 62.83 | 66.14 | 74.39 | 83.01 | 89.89 | 96.47 | 102.96 | 108.86 | 123.14 | 136.75 | 154.05 | 173.46 | 186.83 | 215.85 | 247.32 | 304.08 | 347.28 | 416.11 | 494.67 | 583.04 | 698 |
| 618.0 | 63.55 | 66.85 | 74.97 | 83.76 | 90.92 | 97.78 | 104.28 | 110.67 | 125.26 | 138.86 | 156.7 | 176.81 | 190.6 | 220.7 | 252.99 | 310.9 | 355.96 | 426.28 | 507.61 | 598.84 | 718.27 |
| 619.0 | 64.15 | 67.51 | 75.86 | 84.83 | 91.94 | 98.76 | 105.78 | 112.44 | 127.47 | 141.1 | 159.49 | 180.3 | 194 | 225.44 | 258.44 | 317.87 | 364.35 | 437.02 | 520.52 | 615.24 | 737.73 |
| 620.0 | 64.3 | 68.1 | 76.6 | 85.58 | 93.01 | 100.04 | 107.21 | 113.7 | 129.11 | 143.25 | 162.1 | 183.44 | 197.76 | 229.9 | 263.69 | 324.52 | 372.83 | 447.19 | 532.93 | 631.06 | 757.43 |
| 621.0 | 64.58 | 68.54 | 77.21 | 86.37 | 93.86 | 101.08 | 108.62 | 115.25 | 131.3 | 145.33 | 164.64 | 186.37 | 201.36 | 234.37 | 269.06 | 331.06 | 380.89 | 456.98 | 545.85 | 647.05 | 776.85 |
| 622.0 | 65.12 | 69.16 | 77.96 | 87.11 | 94.98 | 102.16 | 110.05 | 116.74 | 133.18 | 147.57 | 167.24 | 189.59 | 205.03 | 238.84 | 274.54 | 337.91 | 388.9 | 467.1 | 558.26 | 662.89 | 795.84 |
| 623.0 | 65.49 | 69.61 | 78.43 | 87.64 | 95.93 | 102.94 | 111.1 | 118.22 | 134.65 | 149.55 | 169.51 | 192.54 | 208.38 | 242.68 | 279.36 | 344.14 | 396.61 | 476.97 | 570.77 | 677.95 | 814.27 |
| 624.0 | 65.83 | 69.82 | 78.83 | 88.28 | 96.66 | 103.64 | 112.16 | 119.49 | 136.12 | 151.3 | 171.42 | 195.23 | 211.26 | 246.66 | 284.06 | 350.4 | 403.73 | 486.67 | 582.3 | 692.59 | 832.91 |
| 625.0 | 66.13 | 70.13 | 79.28 | 88.85 | 97.24 | 104.48 | 113.23 | 120.56 | 137.53 | 152.99 | 173.45 | 198.09 | 214.09 | 250.29 | 288.39 | 356.24 | 410.84 | 495.73 | 593.53 | 706.7 | 851.11 |
| 626.0 | 66.25 | 70.74 | 79.79 | 89.49 | 98.01 | 105.39 | 114.36 | 121.67 | 138.9 | 154.74 | 175.61 | 200.95 | 217.17 | 254 | 292.73 | 362.02 | 417.64 | 504.58 | 604.48 | 720.1 | 868.23 |
| 627.0 | 66.62 | 70.86 | 80.21 | 90.02 | 98.42 | 106.1 | 115.18 | 122.45 | 140.14 | 156.37 | 177.4 | 203.2 | 219.84 | 257.25 | 296.82 | 367.4 | 424.48 | 512.93 | 614.79 | 733.38 | 884.97 |
| 628.0 | 66.8 | 71.06 | 80.53 | 90.44 | 98.83 | 106.77 | 115.92 | 123.27 | 141.15 | 157.57 | 179.06 | 205.31 | 222.34 | 260.12 | 300.74 | 372.5 | 430.58 | 520.61 | 624.98 | 745.99 | 901.37 |
| 629.0 | 66.84 | 71.05 | 80.58 | 90.57 | 99.01 | 107.06 | 116.5 | 123.93 | 142.14 | 158.77 | 180.27 | 206.81 | 224.5 | 262.79 | 304.15 | 377.16 | 436.16 | 528.17 | 634.25 | 757.87 | 916.11 |
| 630.0 | 66.88 | 71.38 | 80.9 | 90.99 | 99.51 | 107.52 | 116.89 | 124.73 | 143.07 | 159.75 | 181.73 | 208.78 | 226.69 | 265.66 | 307.6 | 381.69 | 441.48 | 535 | 643.23 | 769.15 | 930.54 |
| 631.0 | 66.91 | 71.35 | 80.94 | 91.23 | 99.65 | 107.91 | 117.45 | 125.03 | 143.85 | 160.83 | 182.96 | 210.37 | 228.56 | 267.95 | 310.18 | 385.94 | 446.3 | 541.43 | 651.97 | 779.78 | 943.84 |
| 632.0 | 67.01 | 71.45 | 81.11 | 91.59 | 100.12 | 108.24 | 117.78 | 125.62 | 144.81 | 162.04 | 184.17 | 212.04 | 230.4 | 270.12 | 313.11 | 389.97 | 450.7 | 547.59 | 660.07 | 789.64 | 956.4 |
| 633.0 | 67.05 | 71.38 | 81.03 | 91.61 | 100.1 | 108.53 | 118 | 125.9 | 145.4 | 162.97 | 185.32 | 213.33 | 231.71 | 271.96 | 315.5 | 393.29 | 455.05 | 553.24 | 667.03 | 798.6 | 967.96 |
| 634.0 | 66.92 | 71.28 | 80.97 | 91.55 | 100.16 | 108.6 | 118.27 | 126.24 | 145.81 | 163.37 | 186.19 | 214.18 | 232.98 | 273.73 | 317.36 | 396.13 | 458.78 | 558.22 | 673.37 | 806.66 | 978.81 |
| 635.0 | 66.68 | 71.28 | 80.65 | 91.63 | 100.09 | 108.78 | 118.47 | 126.51 | 146.3 | 163.79 | 186.72 | 214.87 | 234.14 | 275.25 | 319.66 | 398.61 | 462.19 | 562.86 | 679.23 | 814.34 | 989.34 |
| 636.0 | 66.4 | 71.07 | 80.59 | 91.59 | 100.01 | 108.78 | 118.38 | 126.52 | 146.67 | 164.08 | 187.15 | 215.45 | 234.89 | 276.53 | 321.32 | 400.61 | 465.11 | 566.95 | 684.22 | 820.57 | 998.08 |
| 637.0 | 66.08 | 71 | 80.51 | 91.4 | 99.65 | 108.61 | 118.15 | 126.57 | 146.8 | 164.41 | 187.58 | 216.1 | 235.95 | 277.64 | 322.56 | 402.44 | 467.96 | 570.45 | 688.88 | 826.73 | 1005.85 |
| 638.0 | 65.79 | 70.67 | 80.29 | 91.09 | 99.28 | 108.45 | 117.92 | 126.51 | 146.62 | 164.21 | 187.57 | 216.34 | 236.63 | 278.41 | 323.6 | 404.13 | 470.14 | 572.99 | 692.63 | 831.88 | 1012.73 |
| 639.0 | 65.53 | 70.4 | 80.1 | 90.97 | 99 | 108.3 | 117.78 | 126.31 | 146.39 | 164.35 | 187.81 | 216.63 | 237.03 | 279.14 | 324.29 | 405.5 | 471.73 | 575.61 | 695.99 | 836.5 | 1018.31 |
| 640.0 | 65.37 | 70.09 | 79.91 | 90.61 | 98.93 | 108.13 | 117.46 | 125.92 | 146.06 | 164.22 | 187.82 | 216.71 | 237.47 | 279.63 | 324.89 | 406.3 | 473.1 | 577.94 | 698.6 | 839.87 | 1023.72 |
| 641.0 | 65.45 | 69.86 | 79.78 | 90.4 | 98.72 | 107.88 | 117.12 | 125.95 | 146.14 | 164.05 | 187.59 | 216.67 | 237.41 | 279.67 | 325.41 | 407.21 | 473.82 | 579.77 | 701.12 | 842.99 | 1027.86 |
| 642.0 | 65.17 | 69.54 | 79.32 | 89.85 | 98.44 | 107.59 | 116.48 | 125.38 | 145.6 | 163.55 | 187.36 | 216.23 | 237.17 | 279.49 | 325.12 | 407.48 | 474.22 | 580.78 | 702.72 | 845.24 | 1031.21 |
| 643.0 | 64.79 | 69.1 | 78.77 | 89.62 | 97.92 | 107.04 | 115.83 | 125 | 145.11 | 162.99 | 186.92 | 215.61 | 236.69 | 279.09 | 324.6 | 407.35 | 474.39 | 581.25 | 703.81 | 846.3 | 1033.59 |
| 644.0 | 64.4 | 68.84 | 78.5 | 89.36 | 97.43 | 106.58 | 115.45 | 124.47 | 144.71 | 162.53 | 186.41 | 215.2 | 236.22 | 279.06 | 324.32 | 407.24 | 474.23 | 581.36 | 704.02 | 847.36 | 1035.17 |
| 645.0 | 63.96 | 68.66 | 77.99 | 88.86 | 96.97 | 106.05 | 114.93 | 123.73 | 144.2 | 162.02 | 185.98 | 214.61 | 235.79 | 278.59 | 323.84 | 406.25 | 474.15 | 580.46 | 703.95 | 847.93 | 1035.84 |
| 646.0 | 63.73 | 68.49 | 77.72 | 88.54 | 96.61 | 105.59 | 114.48 | 123.23 | 143.82 | 161.74 | 185.68 | 213.97 | 235.2 | 278.32 | 323.56 | 405.61 | 473.47 | 579.95 | 703.55 | 847.61 | 1036.06 |
| 647.0 | 63.58 | 67.87 | 77.2 | 87.74 | 96.11 | 104.93 | 113.7 | 122.68 | 143.29 | 161.14 | 184.79 | 212.7 | 234.32 | 277.5 | 322.47 | 404.65 | 472.44 | 578.92 | 702.93 | 846.52 | 1035.13 |
| 648.0 | 63.3 | 67.53 | 76.69 | 87.17 | 95.52 | 104.14 | 112.93 | 122 | 142.48 | 160.27 | 183.88 | 211.71 | 233.4 | 276.51 | 321.33 | 403.5 | 470.9 | 577.65 | 701.39 | 845.26 | 1033.5 |
| 649.0 | 62.97 | 67.19 | 76.27 | 86.7 | 95.14 | 103.93 | 112.33 | 121.65 | 141.85 | 159.92 | 182.77 | 210.85 | 232.37 | 275.37 | 320.17 | 402.23 | 469.27 | 576.02 | 699.66 | 842.97 | 1031.53 |
| 650.0 | 62.62 | 67.05 | 76 | 86.52 | 94.76 | 103.37 | 111.89 | 121.22 | 141.34 | 159.26 | 181.94 | 210.21 | 231.14 | 274.43 | 318.83 | 400.74 | 467.69 | 574.12 | 697.48 | 840.56 | 1029.48 |
| 651.0 | 62.2 | 66.47 | 75.34 | 85.97 | 94.12 | 102.62 | 111.39 | 120.33 | 140.41 | 158.36 | 180.98 | 209.03 | 229.83 | 273.05 | 317.17 | 398.79 | 465.6 | 572.09 | 695 | 837.58 | 1026.13 |
| 652.0 | 61.82 | 65.89 | 74.69 | 85.23 | 93.6 | 101.8 | 110.36 | 119.83 | 139.49 | 157.23 | 179.84 | 207.85 | 228.42 | 271.54 | 315.89 | 396.5 | 463.41 | 569.12 | 691.67 | 833.84 | 1021.88 |
| 653.0 | 61.42 | 65.32 | 74.21 | 84.66 | 92.86 | 101.05 | 109.68 | 119.07 | 138.4 | 155.73 | 178.68 | 206.15 | 227.07 | 269.92 | 313.77 | 394.53 | 461.22 | 565.98 | 687.73 | 830.15 | 1016.81 |
| 654.0 | 61.12 | 65.08 | 73.76 | 84.31 | 92.47 | 100.62 | 109.25 | 118.32 | 137.62 | 154.86 | 177.72 | 204.9 | 225.68 | 268.45 | 312.23 | 392.3 | 458.79 | 563.5 | 683.97 | 825.87 | 1011.66 |
| 655.0 | 60.66 | 64.64 | 73.37 | 83.74 | 91.84 | 100.01 | 108.24 | 117.52 | 136.66 | 153.9 | 176.47 | 203.66 | 224.29 | 266.84 | 310.42 | 390.05 | 455.96 | 560.25 | 680.04 | 821.53 | 1006.01 |
| 656.0 | 60.22 | 64.1 | 72.97 | 83.09 | 91.28 | 99.37 | 107.59 | 116.57 | 135.64 | 152.9 | 175.19 | 202.48 | 222.76 | 265.06 | 308.29 | 387.76 | 452.97 | 556.84 | 675.82 | 816.36 | 999.73 |
| 657.0 | 59.89 | 63.85 | 72.34 | 82.49 | 90.76 | 98.82 | 106.89 | 115.69 | 134.62 | 151.95 | 174.06 | 201.23 | 221.18 | 263.15 | 306.03 | 385.36 | 449.93 | 552.78 | 671.09 | 811.05 | 993.23 |
| 658.0 | 59.62 | 63.43 | 71.84 | 82 | 90.24 | 98.19 | 106.32 | 115.11 | 133.83 | 150.81 | 172.78 | 199.67 | 219.23 | 261.42 | 303.98 | 382.58 | 446.36 | 548.95 | 666.18 | 805.2 | 985.91 |
| 659.0 | 59.34 | 62.94 | 71.48 | 81.41 | 89.79 | 97.36 | 105.52 | 114.19 | 133.07 | 149.79 | 171.68 | 198.18 | 217.64 | 259.34 | 301.69 | 379.83 | 442.79 | 544.93 | 661.23 | 799.23 | 977.99 |
| 660.0 | 59.06 | 62.47 | 71.09 | 80.74 | 89.16 | 96.77 | 104.7 | 113.26 | 132.01 | 148.48 | 170.13 | 196.28 | 215.78 | 256.94 | 299.21 | 376.83 | 439.1 | 540.75 | 655.64 | 792.5 | 969.74 |
| 661.0 | 58.63 | 62.04 | 70.52 | 80.14 | 88.38 | 95.98 | 103.93 | 112.29 | 131.18 | 147.14 | 168.71 | 194.65 | 213.98 | 255.1 | 297.05 | 373.53 | 435.46 | 535.68 | 650.34 | 786.03 | 961.24 |
| 662.0 | 58.5 | 61.7 | 70.01 | 79.65 | 87.85 | 95.19 | 103.28 | 111.39 | 129.8 | 146 | 167.57 | 193.42 | 212.52 | 253.27 | 294.67 | 370.16 | 431.76 | 530.96 | 645 | 779.27 | 952.93 |
| 663.0 | 58.2 | 61.43 | 69.82 | 79.33 | 87.39 | 94.76 | 102.76 | 110.63 | 128.75 | 145.29 | 166.28 | 192.12 | 210.96 | 251.32 | 292.4 | 367.32 | 428.36 | 526.69 | 639.4 | 772.54 | 944.83 |
| 664.0 | 58.07 | 61.44 | 69.54 | 78.71 | 86.87 | 94.31 | 102.09 | 110.05 | 127.98 | 144.31 | 165.03 | 190.79 | 209.37 | 249.25 | 290.02 | 364.34 | 424.67 | 522.05 | 634.02 | 765.75 | 936.06 |
| 665.0 | 57.93 | 61.1 | 69.08 | 78.13 | 86.39 | 93.71 | 101.39 | 109.3 | 126.88 | 143.08 | 163.63 | 189.26 | 207.74 | 247 | 287.72 | 361.19 | 421.04 | 517.32 | 628.29 | 758.72 | 927.47 |
| 666.0 | 57.86 | 60.94 | 69.01 | 77.89 | 85.91 | 93.36 | 100.85 | 108.95 | 126.01 | 141.99 | 162.71 | 187.94 | 206.17 | 244.92 | 285.4 | 358.42 | 417.03 | 513.19 | 622.92 | 751.49 | 918.41 |
| 667.0 | 57.56 | 60.45 | 68.56 | 77.4 | 85.31 | 92.7 | 100.07 | 108.29 | 125.09 | 140.55 | 161.36 | 186.32 | 204.42 | 242.43 | 282.62 | 355.12 | 413.2 | 508.43 | 616.94 | 744.06 | 908.73 |
| 668.0 | 57.31 | 60.13 | 68.19 | 77.11 | 84.81 | 92.19 | 99.56 | 107.56 | 124.33 | 139.64 | 160.18 | 184.94 | 202.62 | 240.34 | 280.37 | 352.01 | 409.48 | 503.57 | 610.53 | 736.82 | 899.71 |
| 669.0 | 56.87 | 59.89 | 67.82 | 76.68 | 84.36 | 91.7 | 98.99 | 106.92 | 123.58 | 138.77 | 158.84 | 183.56 | 201.15 | 238.1 | 278.03 | 348.8 | 405.8 | 498.76 | 604.78 | 729.39 | 890.87 |
| 670.0 | 56.56 | 59.49 | 67.26 | 76.02 | 83.66 | 90.86 | 98.14 | 105.91 | 122.43 | 137.52 | 157.61 | 181.98 | 199.34 | 236.19 | 275.31 | 345.31 | 401.93 | 493.96 | 598.31 | 722.27 | 881.33 |
| 671.0 | 56.21 | 58.99 | 66.76 | 75.45 | 82.92 | 90.33 | 97.49 | 105.07 | 121.31 | 136.5 | 156.32 | 180.22 | 197.65 | 234.02 | 272.87 | 342 | 397.9 | 488.8 | 592.33 | 714.44 | 871.25 |
| 672.0 | 55.95 | 58.63 | 66.57 | 74.87 | 82.33 | 90.04 | 96.83 | 104.41 | 120.5 | 135.47 | 154.83 | 178.64 | 195.77 | 231.69 | 270.3 | 338.65 | 394.06 | 483.76 | 586.25 | 706.72 | 861.8 |
| 673.0 | 55.87 | 58.58 | 66.46 | 74.57 | 81.78 | 89.44 | 96.5 | 103.69 | 119.7 | 134.64 | 153.74 | 176.95 | 194.31 | 229.86 | 267.82 | 335.24 | 390.23 | 479.32 | 580.35 | 699.2 | 852.53 |
| 674.0 | 55.57 | 58.34 | 66.2 | 74.25 | 81.44 | 89.12 | 95.85 | 103.12 | 119.25 | 133.87 | 152.56 | 175.57 | 192.36 | 227.57 | 265.48 | 331.61 | 386.46 | 474.64 | 574.5 | 691.77 | 843.48 |
| 675.0 | 55.44 | 57.97 | 65.93 | 73.71 | 80.97 | 88.45 | 95.23 | 102.54 | 118.4 | 132.75 | 151.33 | 174.03 | 190.8 | 225.66 | 262.78 | 328.71 | 382.54 | 469.24 | 568.52 | 684.56 | 834.01 |
| 676.0 | 55.24 | 57.66 | 65.54 | 73.28 | 80.27 | 87.89 | 94.68 | 101.83 | 117.48 | 131.62 | 150.03 | 172.42 | 188.95 | 223.34 | 259.92 | 325.35 | 378.71 | 464.35 | 562.14 | 677.1 | 824.19 |
| 677.0 | 55.09 | 57.38 | 65.36 | 72.99 | 79.68 | 87.19 | 93.95 | 101.32 | 116.54 | 130.52 | 148.96 | 170.95 | 187.25 | 221.3 | 257.43 | 322.23 | 375.05 | 459.35 | 555.89 | 669.68 | 814.51 |
| 678.0 | 55.02 | 57 | 65.27 | 72.69 | 79.33 | 86.59 | 93.43 | 100.84 | 115.61 | 129.39 | 147.7 | 169.46 | 185.8 | 219.18 | 255.12 | 318.85 | 371.3 | 454.99 | 550.38 | 662.38 | 805.22 |
| 679.0 | 54.87 | 56.69 | 64.98 | 72.31 | 78.81 | 86.13 | 92.9 | 100.08 | 114.78 | 128.47 | 146.63 | 168.42 | 184.36 | 217.22 | 252.78 | 315.74 | 367.85 | 450.29 | 544.77 | 655.44 | 796.27 |
| 680.0 | 54.54 | 56.33 | 64.46 | 71.94 | 78.28 | 85.6 | 92.32 | 99.44 | 113.96 | 127.61 | 145.51 | 167.02 | 182.57 | 215.39 | 250.18 | 312.76 | 364.25 | 445.66 | 538.83 | 648.1 | 787.6 |
| 681.0 | 54.34 | 56.07 | 64.12 | 71.64 | 77.86 | 85.03 | 91.8 | 98.82 | 113.12 | 126.55 | 144.58 | 165.86 | 181.15 | 213.58 | 247.72 | 310.05 | 360.96 | 441.03 | 533.53 | 641.46 | 778.84 |
| 682.0 | 54.26 | 55.99 | 63.72 | 71.37 | 77.43 | 84.7 | 91.33 | 98.35 | 112.27 | 125.83 | 143.43 | 164.61 | 179.72 | 211.39 | 245.28 | 307.75 | 357.58 | 437 | 528.09 | 634.85 | 770.78 |
| 683.0 | 53.78 | 55.69 | 63.32 | 71.1 | 76.88 | 84.36 | 90.8 | 97.61 | 111.63 | 125.05 | 142.2 | 163.13 | 178.23 | 209.4 | 243.1 | 304.95 | 354.46 | 432.63 | 522.42 | 628.02 | 762.34 |
| 684.0 | 53.64 | 55.58 | 62.94 | 70.72 | 76.5 | 83.62 | 90.27 | 97.1 | 110.85 | 124.13 | 141.2 | 161.99 | 176.92 | 207.75 | 241.02 | 302.24 | 351.18 | 428.52 | 517.21 | 621.59 | 753.74 |
| 685.0 | 53.27 | 55.22 | 62.61 | 70.32 | 76.33 | 83.08 | 89.92 | 96.37 | 110.07 | 123.44 | 140.21 | 160.61 | 175.29 | 206.05 | 239.01 | 299.5 | 348.04 | 424.44 | 511.73 | 615.16 | 745.8 |
| 686.0 | 52.96 | 54.94 | 62.32 | 69.97 | 75.96 | 82.79 | 89.35 | 95.75 | 109.57 | 122.8 | 139.34 | 159.36 | 174.18 | 204.32 | 236.9 | 296.98 | 344.79 | 420.38 | 506.71 | 608.9 | 738.18 |
| 687.0 | 52.53 | 54.34 | 61.87 | 69.42 | 75.54 | 82.2 | 88.6 | 94.99 | 108.67 | 121.96 | 138.11 | 158.12 | 172.66 | 202.53 | 234.95 | 294.46 | 341.96 | 416.32 | 501.71 | 602.52 | 730.85 |
| 688.0 | 52.35 | 54.14 | 61.67 | 68.98 | 75.29 | 81.8 | 88.25 | 94.43 | 107.8 | 121.43 | 137.09 | 157 | 171.62 | 201.14 | 233.21 | 292.12 | 339.43 | 412.67 | 497.21 | 597.17 | 723.9 |
| 689.0 | 52.33 | 54.16 | 61.75 | 68.83 | 74.89 | 81.56 | 87.73 | 94.01 | 107.25 | 120.66 | 136.35 | 156 | 170.51 | 199.83 | 231.68 | 289.71 | 336.69 | 409.61 | 493.16 | 592.36 | 717.46 |
| 690.0 | 52.15 | 53.76 | 61.49 | 68.33 | 74.38 | 81.19 | 87.36 | 93.5 | 106.54 | 119.62 | 135.59 | 154.94 | 169.16 | 198.57 | 230 | 287.47 | 334.19 | 406.24 | 488.82 | 587.26 | 710.63 |
| 691.0 | 51.91 | 53.62 | 61.38 | 68.11 | 73.97 | 80.8 | 87.21 | 93.15 | 106.23 | 118.94 | 134.9 | 153.78 | 168.14 | 197.18 | 228.47 | 285.54 | 331.72 | 403.43 | 485.16 | 582.35 | 704.29 |
| 692.0 | 51.89 | 53.6 | 61.24 | 68.07 | 73.89 | 80.62 | 86.81 | 92.72 | 105.87 | 118.25 | 134.21 | 153.22 | 167.36 | 195.97 | 226.84 | 283.78 | 329.82 | 400.62 | 481.48 | 578.17 | 698.72 |
| 693.0 | 51.77 | 53.54 | 60.85 | 67.8 | 73.81 | 80.04 | 86.51 | 92.28 | 105.48 | 117.8 | 133.51 | 152.43 | 166.73 | 194.87 | 225.38 | 282.24 | 327.84 | 397.74 | 477.94 | 573.88 | 693.6 |
| 694.0 | 51.41 | 53.25 | 60.33 | 67.53 | 73.53 | 79.73 | 86.08 | 92.05 | 104.95 | 117.34 | 132.92 | 151.55 | 165.52 | 193.72 | 223.92 | 280.85 | 325.64 | 395.28 | 474.57 | 570.18 | 688.47 |
| 695.0 | 51.26 | 53.35 | 59.98 | 67.21 | 73.17 | 79.51 | 85.87 | 91.71 | 104.3 | 116.91 | 132.3 | 151.07 | 164.95 | 193.04 | 222.96 | 279.6 | 323.6 | 392.99 | 471.68 | 566.47 | 684.11 |
| 696.0 | 50.92 | 53.2 | 59.88 | 66.97 | 72.67 | 79.27 | 85.54 | 91.27 | 103.96 | 116.43 | 131.47 | 150.71 | 164.26 | 192.08 | 222.08 | 277.95 | 321.79 | 390.9 | 469.17 | 563.37 | 680.02 |
| 697.0 | 50.9 | 53.1 | 59.76 | 66.74 | 72.55 | 78.99 | 85.47 | 90.96 | 103.87 | 116.15 | 131.21 | 150.15 | 163.71 | 191.56 | 221.29 | 276.66 | 320.11 | 388.9 | 466.98 | 560.53 | 676.51 |
| 698.0 | 50.79 | 53.09 | 59.46 | 66.48 | 72.35 | 78.84 | 85.26 | 90.59 | 103.7 | 115.98 | 130.91 | 149.67 | 163.24 | 190.89 | 220.32 | 275.38 | 318.8 | 387.07 | 465.08 | 557.68 | 673.51 |
| 699.0 | 50.51 | 52.97 | 59.12 | 66.23 | 72.15 | 78.65 | 85.17 | 90.28 | 103.57 | 115.86 | 130.63 | 149.08 | 162.67 | 190.34 | 219.48 | 274.6 | 317.95 | 385.3 | 462.73 | 554.95 | 670.37 |
| 700.0 | 50.37 | 53.02 | 59.22 | 66.14 | 72.18 | 78.45 | 84.98 | 90.05 | 103.5 | 115.62 | 130.38 | 148.49 | 162.32 | 190.03 | 218.72 | 274.16 | 317 | 384.14 | 461.05 | 552.94 | 667.99 |
| 701.0 | 50.51 | 53.22 | 59.37 | 66.38 | 72.29 | 78.78 | 85.16 | 90.15 | 103.45 | 115.58 | 130.45 | 148.38 | 162.13 | 189.82 | 218.6 | 273.53 | 316.52 | 383.34 | 460.22 | 551.68 | 666.31 |
| 702.0 | 50.31 | 53.41 | 59.32 | 66.52 | 72.3 | 78.76 | 84.98 | 89.93 | 103.54 | 115.51 | 130.21 | 148.01 | 161.87 | 189.69 | 218.51 | 272.74 | 315.85 | 382.58 | 458.78 | 550.26 | 664.85 |
| 703.0 | 50.27 | 53.31 | 59.55 | 66.54 | 72.32 | 78.6 | 84.94 | 89.84 | 103.33 | 115.29 | 130.3 | 147.6 | 161.83 | 189.36 | 218.3 | 272.01 | 315.14 | 381.83 | 457.91 | 548.85 | 663.38 |
| 704.0 | 50.21 | 53.14 | 59.52 | 66.22 | 71.94 | 78.39 | 84.73 | 89.75 | 103.31 | 115.06 | 130.27 | 147.3 | 161.68 | 189.03 | 217.94 | 271.36 | 314.73 | 381.39 | 457.36 | 547.87 | 662.23 |
| 705.0 | 50.13 | 52.88 | 59.54 | 66.07 | 71.82 | 78.26 | 84.48 | 89.69 | 103.4 | 114.84 | 130.07 | 147.09 | 161.45 | 188.73 | 217.7 | 271.14 | 314.33 | 380.94 | 456.74 | 546.94 | 661.4 |
| 706.0 | 50.15 | 52.86 | 59.5 | 65.92 | 71.48 | 78.21 | 84.37 | 89.7 | 103.16 | 114.66 | 129.87 | 147.18 | 161.67 | 188.67 | 217.55 | 271.16 | 314.38 | 380.73 | 456.68 | 546.7 | 660.93 |
| 707.0 | 50.25 | 52.9 | 59.66 | 65.98 | 71.55 | 78.26 | 84.55 | 89.8 | 103.26 | 114.71 | 129.91 | 147.56 | 161.71 | 188.93 | 217.69 | 271.25 | 314.72 | 380.9 | 456.83 | 546.94 | 660.75 |
| 708.0 | 50.35 | 52.99 | 59.6 | 66.06 | 71.43 | 78.28 | 84.65 | 89.88 | 103.45 | 114.92 | 129.83 | 147.38 | 161.89 | 189.06 | 217.82 | 271.47 | 314.75 | 381.05 | 457.09 | 547.52 | 660.82 |
| 709.0 | 50.26 | 53.15 | 59.67 | 66.25 | 71.48 | 78.36 | 84.52 | 89.72 | 103.63 | 115.06 | 129.95 | 147.59 | 161.86 | 189.19 | 218.03 | 271.6 | 314.6 | 381.29 | 457.22 | 547.53 | 661.36 |
| 710.0 | 50.09 | 52.98 | 59.6 | 66.09 | 71.45 | 78.21 | 84.61 | 89.54 | 103.5 | 115.06 | 129.77 | 147.65 | 162.18 | 189.16 | 218.07 | 271.82 | 314.55 | 381.34 | 457.36 | 547.91 | 661.32 |
| 711.0 | 50.21 | 53.13 | 59.64 | 66.15 | 71.61 | 78.28 | 84.48 | 89.7 | 103.5 | 115.4 | 129.82 | 147.82 | 162.23 | 189.31 | 218.16 | 271.91 | 314.63 | 381.52 | 457.7 | 547.85 | 661.75 |
| 712.0 | 50.16 | 53.14 | 59.66 | 66.25 | 71.73 | 78.35 | 84.56 | 89.61 | 103.43 | 115.45 | 129.82 | 148.11 | 162.41 | 189.58 | 218.33 | 271.93 | 314.91 | 381.34 | 457.72 | 547.7 | 662.01 |
| 713.0 | 49.94 | 53 | 59.57 | 66.08 | 71.54 | 78.14 | 84.37 | 89.5 | 103.43 | 115.44 | 129.7 | 147.83 | 162.28 | 189.61 | 218.3 | 272.04 | 314.71 | 381.1 | 457.8 | 547.64 | 662.18 |
| 714.0 | 49.89 | 52.73 | 59.48 | 65.98 | 71.18 | 77.96 | 84.34 | 89.37 | 103.38 | 115.32 | 129.65 | 147.69 | 162.08 | 189.66 | 218.63 | 272.14 | 314.69 | 381.39 | 458.11 | 547.95 | 662.3 |
| 715.0 | 49.91 | 52.73 | 59.63 | 65.98 | 71.21 | 77.98 | 84.36 | 89.18 | 103.45 | 115.24 | 129.8 | 147.88 | 162.35 | 189.66 | 218.93 | 272.5 | 315.31 | 381.3 | 458.75 | 548.09 | 662.91 |
| 716.0 | 49.97 | 52.52 | 59.66 | 65.92 | 71.1 | 77.71 | 84.3 | 89.12 | 103.38 | 115.31 | 129.85 | 147.74 | 162.29 | 189.85 | 219.06 | 272.81 | 315.57 | 381.67 | 459.26 | 548.58 | 663.52 |
| 717.0 | 49.92 | 52.3 | 59.58 | 65.68 | 71.15 | 77.67 | 84.07 | 89.03 | 103.09 | 115.21 | 130.16 | 147.48 | 162.32 | 190.01 | 218.93 | 273.17 | 315.89 | 382.24 | 459.63 | 549.07 | 664.63 |
| 718.0 | 49.9 | 52.31 | 59.51 | 65.82 | 71.15 | 77.69 | 84.21 | 89.11 | 103 | 115.15 | 130.24 | 147.7 | 162.81 | 190.34 | 219.32 | 273.7 | 316.48 | 382.99 | 460.73 | 549.89 | 666.09 |
| 719.0 | 49.79 | 52.17 | 59.49 | 65.73 | 71.29 | 77.73 | 84.33 | 89.28 | 103.15 | 115.14 | 130.25 | 147.82 | 163.06 | 190.57 | 219.83 | 274.2 | 316.84 | 383.95 | 461.98 | 551.56 | 667.5 |
| 720.0 | 49.97 | 52.32 | 59.67 | 65.78 | 71.42 | 77.98 | 84.24 | 89.33 | 103.28 | 115.55 | 130.46 | 148.08 | 163.35 | 190.96 | 220.29 | 274.82 | 317.58 | 385.25 | 463.72 | 553.64 | 669.54 |
| 721.0 | 49.88 | 52.22 | 59.59 | 65.79 | 71.34 | 78.03 | 84.14 | 89.39 | 103.24 | 115.62 | 130.68 | 148.42 | 163.6 | 191.08 | 220.89 | 275.24 | 318.42 | 386.14 | 464.82 | 555.08 | 671.39 |
| 722.0 | 49.93 | 52.23 | 59.61 | 65.8 | 71.45 | 78 | 84.19 | 89.59 | 103.34 | 115.95 | 130.68 | 148.65 | 164.16 | 191.76 | 221.69 | 276.28 | 319.72 | 387.52 | 466.53 | 557.26 | 673.78 |
| 723.0 | 49.93 | 52.15 | 59.61 | 65.61 | 71.48 | 78.05 | 84.31 | 89.88 | 103.41 | 116.3 | 131.02 | 149.13 | 164.71 | 192.04 | 222.57 | 277.39 | 320.9 | 389.05 | 468.94 | 559.32 | 676.85 |
| 724.0 | 49.86 | 52.32 | 59.56 | 65.76 | 71.72 | 78.32 | 84.63 | 90.37 | 103.99 | 116.82 | 131.4 | 150.1 | 165.34 | 193.05 | 223.39 | 278.69 | 322.85 | 390.9 | 471.13 | 562.32 | 680.44 |
| 725.0 | 49.97 | 52.48 | 59.64 | 65.97 | 72.22 | 78.55 | 85.09 | 90.76 | 104.23 | 117.17 | 131.86 | 150.79 | 166.06 | 193.93 | 224.38 | 280.36 | 324.23 | 392.85 | 473.39 | 565.33 | 683.91 |
| 726.0 | 49.97 | 52.76 | 59.72 | 66.21 | 72.41 | 78.85 | 85.49 | 91.01 | 104.66 | 117.64 | 132.42 | 151.55 | 166.98 | 194.85 | 225.51 | 281.71 | 325.78 | 394.99 | 476.06 | 568.35 | 687.8 |
| 727.0 | 49.91 | 52.78 | 59.84 | 66.45 | 72.59 | 79.09 | 85.79 | 91.27 | 105.13 | 118.12 | 133.01 | 152.31 | 167.61 | 195.98 | 226.67 | 282.91 | 327.12 | 397.11 | 478.6 | 571.78 | 691.72 |
| 728.0 | 49.93 | 52.94 | 59.64 | 66.63 | 72.65 | 79.31 | 85.89 | 91.61 | 105.36 | 118.64 | 133.57 | 152.79 | 168.34 | 196.88 | 227.85 | 284.15 | 328.64 | 399.1 | 481.34 | 575.14 | 695.94 |
| 729.0 | 49.85 | 53.02 | 59.76 | 66.78 | 72.93 | 79.49 | 86.13 | 91.95 | 105.65 | 119.04 | 134.23 | 153.59 | 168.98 | 197.9 | 228.89 | 285.6 | 330.69 | 401.2 | 484.25 | 578.63 | 700.45 |
| 730.0 | 49.9 | 52.94 | 59.7 | 66.94 | 73.15 | 79.58 | 86.56 | 92.51 | 106.14 | 119.48 | 135.1 | 154.04 | 169.99 | 198.78 | 230.09 | 287.27 | 332.83 | 403.82 | 487.21 | 582.63 | 705.31 |
| 731.0 | 49.98 | 53.13 | 59.93 | 67.19 | 73.59 | 80.16 | 86.9 | 93.11 | 106.73 | 120.16 | 135.89 | 155.06 | 171 | 200 | 231.38 | 289.17 | 335.42 | 406.45 | 491.06 | 586.86 | 710.23 |
| 732.0 | 49.96 | 53.3 | 60.07 | 67.64 | 73.92 | 80.53 | 87.55 | 93.37 | 107.37 | 120.53 | 136.68 | 155.77 | 172.05 | 201.28 | 232.86 | 291.17 | 337.63 | 409.48 | 494.81 | 591.61 | 715.63 |
| 733.0 | 50.11 | 53.51 | 60.09 | 67.68 | 74.16 | 80.69 | 87.75 | 93.83 | 107.67 | 121.13 | 137.19 | 156.54 | 173.1 | 202.4 | 234.07 | 293.31 | 340.01 | 412.55 | 498.58 | 596.6 | 721.39 |
| 734.0 | 50.52 | 53.81 | 60.33 | 67.81 | 74.62 | 81.15 | 88.38 | 94.48 | 108.3 | 121.91 | 138.27 | 157.76 | 174.27 | 203.9 | 236.07 | 295.57 | 342.73 | 416.32 | 502.68 | 601.6 | 727.71 |
| 735.0 | 50.68 | 54.21 | 60.71 | 68.25 | 75.22 | 81.88 | 88.73 | 95.19 | 108.98 | 122.8 | 139.27 | 159 | 175.65 | 205.51 | 237.61 | 297.94 | 345.59 | 419.81 | 506.76 | 606.54 | 734.48 |
| 736.0 | 50.93 | 54.51 | 61 | 68.6 | 75.72 | 82.35 | 89.34 | 95.84 | 109.66 | 123.55 | 139.94 | 160.1 | 176.97 | 206.9 | 239.33 | 300.11 | 348.37 | 423.47 | 510.82 | 611.65 | 741.05 |
| 737.0 | 50.98 | 54.72 | 61.21 | 68.77 | 76.03 | 82.55 | 89.67 | 96.18 | 110.32 | 124.03 | 140.78 | 160.86 | 178.14 | 208.17 | 240.84 | 302.12 | 350.99 | 426.27 | 514.63 | 616.59 | 746.85 |
| 738.0 | 51.28 | 55.13 | 61.52 | 69.4 | 76.57 | 83.11 | 90.19 | 96.89 | 111.02 | 124.95 | 141.63 | 162.16 | 179.53 | 209.55 | 242.84 | 304.52 | 353.77 | 429.22 | 518.74 | 621.65 | 752.62 |
| 739.0 | 51.23 | 55.12 | 61.72 | 69.52 | 76.92 | 83.31 | 90.46 | 97.3 | 111.38 | 125.68 | 142.41 | 163.21 | 180.4 | 210.69 | 244.35 | 306.54 | 356.25 | 432.26 | 522.47 | 626.45 | 758.3 |
| 740.0 | 51.26 | 55.35 | 61.98 | 69.74 | 77.24 | 83.63 | 90.69 | 97.69 | 111.82 | 126.35 | 143.33 | 164.11 | 181.43 | 212.03 | 245.92 | 308.72 | 358.93 | 435.16 | 526.2 | 631 | 763.89 |
| 741.0 | 51.36 | 55.4 | 62.11 | 69.94 | 77.39 | 83.76 | 91.14 | 98.06 | 112.35 | 126.65 | 143.88 | 165.19 | 182.66 | 213.33 | 247.38 | 310.74 | 361.18 | 437.83 | 529.51 | 635.63 | 769.17 |
| 742.0 | 51.53 | 55.54 | 62.29 | 70.05 | 77.73 | 84.13 | 91.59 | 98.49 | 112.79 | 127.37 | 144.6 | 166 | 183.58 | 214.39 | 248.86 | 312.8 | 363.57 | 440.99 | 533.07 | 640.15 | 774.37 |
| 743.0 | 51.38 | 55.45 | 62.43 | 70.09 | 77.65 | 84.26 | 91.67 | 98.65 | 113.34 | 127.72 | 145.31 | 166.7 | 184.28 | 215.03 | 250 | 314.3 | 365.23 | 443.27 | 535.51 | 643.64 | 778.94 |
| 744.0 | 51.48 | 55.35 | 62.47 | 70.21 | 77.84 | 84.46 | 91.98 | 98.91 | 113.54 | 128.23 | 145.67 | 167.35 | 184.98 | 216.08 | 251.03 | 315.6 | 367.06 | 445.48 | 538.13 | 647.18 | 782.88 |
| 745.0 | 51.54 | 55.3 | 62.68 | 70.2 | 77.95 | 84.65 | 92.06 | 98.98 | 113.73 | 128.57 | 146.02 | 167.8 | 185.59 | 216.77 | 251.9 | 316.95 | 368.36 | 447.47 | 540.69 | 650.32 | 786.46 |
| 746.0 | 51.48 | 55.46 | 62.86 | 70.26 | 77.88 | 84.89 | 92.13 | 99.17 | 114.07 | 129.01 | 146.5 | 168.16 | 185.89 | 217.67 | 252.66 | 318.16 | 369.91 | 449.29 | 543.17 | 653.17 | 789.98 |
| 747.0 | 51.46 | 55.32 | 62.85 | 70.33 | 77.72 | 84.9 | 92.03 | 99.25 | 114 | 129.15 | 146.8 | 168.55 | 186.06 | 218.17 | 253.37 | 318.8 | 371.02 | 450.49 | 545.15 | 655.72 | 792.9 |
| 748.0 | 51.46 | 55.26 | 62.79 | 70.47 | 77.77 | 84.96 | 91.97 | 99.53 | 114.23 | 129.11 | 146.99 | 168.62 | 186.49 | 218.44 | 253.93 | 319.6 | 372.26 | 451.74 | 546.86 | 657.72 | 795.84 |
| 749.0 | 51.53 | 55.04 | 63 | 70.4 | 77.85 | 84.86 | 92.07 | 99.44 | 114.34 | 129.07 | 147.06 | 168.87 | 186.61 | 218.7 | 254.55 | 320.55 | 372.89 | 453.13 | 548.49 | 659.77 | 798.36 |
| 750.0 | 51.49 | 55 | 62.9 | 70.27 | 77.74 | 84.85 | 92.1 | 99.33 | 114.36 | 129.29 | 147.14 | 169.09 | 187.24 | 219.06 | 254.88 | 320.94 | 373.57 | 454.36 | 549.93 | 661.41 | 800.13 |
| 751.0 | 51.58 | 55.02 | 62.92 | 70.1 | 77.53 | 84.89 | 91.92 | 99.24 | 114.33 | 129.06 | 146.91 | 169.44 | 187.27 | 219.46 | 255.48 | 321.41 | 374.1 | 454.79 | 551.28 | 662.53 | 801.61 |
| 752.0 | 51.43 | 54.92 | 62.59 | 69.91 | 77.47 | 84.7 | 91.87 | 99.1 | 114.15 | 128.88 | 146.84 | 169.48 | 186.91 | 219.47 | 255.75 | 321.82 | 374.41 | 454.88 | 551.67 | 663.11 | 803.41 |
| 753.0 | 51.15 | 54.72 | 62.3 | 69.57 | 77.39 | 84.47 | 91.53 | 99.02 | 113.97 | 128.7 | 146.77 | 169.53 | 186.78 | 219.53 | 255.96 | 321.81 | 374.69 | 455.01 | 551.89 | 663.8 | 804.31 |
| 754.0 | 51.05 | 54.55 | 62.23 | 69.49 | 77.25 | 84.41 | 91.37 | 98.85 | 113.92 | 128.59 | 146.88 | 169.35 | 186.74 | 219.71 | 256.3 | 321.71 | 374.69 | 455.23 | 552.42 | 664.41 | 804.86 |
| 755.0 | 50.73 | 54.27 | 62.16 | 69.35 | 76.98 | 84.13 | 91.17 | 98.62 | 113.69 | 128.29 | 146.78 | 169.12 | 186.82 | 219.58 | 256.03 | 321.59 | 374.74 | 455.01 | 552.48 | 664.9 | 804.65 |
| 756.0 | 50.59 | 54.02 | 61.96 | 69.13 | 76.56 | 83.8 | 90.83 | 98.3 | 113.26 | 127.91 | 146.35 | 168.76 | 186.48 | 219.24 | 255.89 | 321 | 374.31 | 454.5 | 552.16 | 664.7 | 804.1 |
| 757.0 | 50.56 | 53.92 | 62.02 | 68.92 | 76.47 | 83.93 | 90.6 | 98.2 | 113.26 | 127.78 | 146.24 | 168.81 | 186.38 | 219.24 | 255.79 | 320.43 | 373.88 | 454.17 | 551.69 | 664.22 | 803.53 |
| 758.0 | 50.26 | 53.6 | 61.74 | 68.65 | 76.12 | 83.74 | 90.43 | 97.78 | 112.76 | 127.65 | 145.85 | 168.71 | 185.85 | 218.71 | 255.3 | 319.7 | 373.21 | 453.67 | 550.74 | 663.37 | 802.63 |
| 759.0 | 49.9 | 53.41 | 61.35 | 68.09 | 75.71 | 83.28 | 90.29 | 97.43 | 112.37 | 127.35 | 145.34 | 168.31 | 185.19 | 218.18 | 254.84 | 318.43 | 372.61 | 452.54 | 549.85 | 662.11 | 801.35 |
| 760.0 | 49.72 | 53.15 | 61.05 | 67.69 | 75.14 | 83.12 | 89.92 | 97.06 | 112.03 | 126.86 | 144.71 | 167.68 | 184.44 | 217.59 | 254.04 | 317.42 | 371.39 | 451.41 | 548.4 | 660.74 | 799.68 |
| 761.0 | 49.68 | 53.02 | 60.76 | 67.44 | 74.76 | 82.71 | 89.75 | 96.7 | 111.62 | 126.57 | 144.13 | 167.36 | 183.72 | 216.77 | 253.29 | 316.18 | 370.45 | 450.18 | 546.92 | 658.92 | 797.53 |
| 762.0 | 49.44 | 52.7 | 60.43 | 67.04 | 74.32 | 82.31 | 89.19 | 96.3 | 111.2 | 125.98 | 143.6 | 166.72 | 182.7 | 216.02 | 252.18 | 315.09 | 369.25 | 448.88 | 545.32 | 656.44 | 795.21 |
| 763.0 | 49.17 | 52.32 | 60.08 | 66.6 | 73.85 | 81.66 | 88.68 | 95.81 | 110.64 | 125.29 | 142.82 | 166.04 | 181.9 | 215.11 | 251.07 | 313.63 | 367.71 | 446.97 | 543.37 | 653.97 | 792.25 |
| 764.0 | 48.84 | 51.94 | 59.52 | 66.15 | 73.34 | 81.17 | 88.22 | 95.32 | 109.98 | 124.57 | 141.96 | 165.12 | 181.04 | 214.47 | 249.94 | 312.19 | 366.23 | 445.16 | 541.57 | 651.57 | 788.94 |
| 765.0 | 48.48 | 51.73 | 59.07 | 65.73 | 72.81 | 80.71 | 87.5 | 94.72 | 109.52 | 123.74 | 141.24 | 164.21 | 180.01 | 213.25 | 248.59 | 310.79 | 364.54 | 443.04 | 538.96 | 649.11 | 785.92 |
| 766.0 | 48.07 | 51.4 | 58.6 | 65.45 | 72.3 | 80.17 | 86.92 | 94.14 | 108.96 | 122.97 | 140.51 | 163.09 | 178.9 | 212.28 | 247.25 | 309.13 | 362.74 | 440.64 | 536.17 | 646.1 | 782.21 |
| 767.0 | 47.82 | 50.89 | 58.19 | 65.03 | 71.8 | 79.52 | 86.2 | 93.59 | 108.2 | 122.19 | 139.55 | 162.19 | 177.92 | 210.83 | 246.26 | 307.5 | 360.81 | 438.25 | 532.97 | 642.78 | 778.44 |
| 768.0 | 47.42 | 50.58 | 57.79 | 64.54 | 71.33 | 79.04 | 85.86 | 93.05 | 107.71 | 121.45 | 138.78 | 161.15 | 177.02 | 209.7 | 244.91 | 306.13 | 359.08 | 436.05 | 530.06 | 639.34 | 774.8 |
| 769.0 | 47.16 | 50.23 | 57.42 | 63.93 | 70.96 | 78.46 | 85.29 | 92.32 | 106.99 | 120.81 | 137.9 | 160.31 | 175.73 | 208.43 | 243.5 | 304.47 | 356.75 | 433.72 | 526.92 | 635.75 | 770.37 |
| 770.0 | 46.59 | 50.02 | 57 | 63.41 | 70.27 | 77.78 | 84.69 | 91.56 | 106.36 | 120.09 | 136.98 | 159.04 | 174.37 | 207.35 | 241.6 | 302.49 | 354.6 | 431.07 | 523.63 | 631.49 | 765.67 |
| 771.0 | 46.32 | 49.63 | 56.66 | 63.03 | 69.71 | 77.13 | 84.15 | 90.89 | 105.72 | 118.91 | 136.09 | 157.96 | 172.82 | 205.79 | 240.15 | 300.36 | 352.44 | 428.24 | 520.22 | 627.61 | 760.68 |
| 772.0 | 45.89 | 49.23 | 56.17 | 62.59 | 69.24 | 76.54 | 83.72 | 90.09 | 104.93 | 118.25 | 135.11 | 156.74 | 171.53 | 204.25 | 238.02 | 298.14 | 349.99 | 425.39 | 516.32 | 623.86 | 755.49 |
| 773.0 | 45.51 | 48.85 | 55.83 | 62.12 | 68.58 | 75.86 | 83.05 | 89.52 | 104.32 | 117.48 | 134.13 | 155.44 | 170.46 | 202.8 | 236.21 | 295.83 | 347.42 | 422.71 | 512.43 | 619.56 | 750.04 |
| 774.0 | 45.36 | 48.63 | 55.57 | 61.69 | 68.02 | 75.29 | 82.45 | 88.86 | 103.54 | 116.73 | 133.12 | 154.23 | 169.41 | 201.33 | 234.33 | 293.78 | 345.06 | 420.07 | 508.98 | 615.01 | 744.88 |
| 775.0 | 45.11 | 48.33 | 55.12 | 61.17 | 67.43 | 74.88 | 81.89 | 88.08 | 102.74 | 115.85 | 132.12 | 153.18 | 167.87 | 199.53 | 232.43 | 291.3 | 342.47 | 416.87 | 504.88 | 610.46 | 739.2 |
| 776.0 | 44.86 | 47.95 | 54.54 | 60.75 | 67.05 | 74.2 | 81.27 | 87.37 | 101.86 | 114.99 | 130.91 | 151.85 | 166.33 | 197.85 | 230.75 | 288.69 | 339.54 | 413.31 | 500.56 | 605.32 | 733.56 |
| 777.0 | 44.5 | 47.73 | 54.09 | 60.25 | 66.7 | 73.73 | 80.59 | 86.84 | 101.11 | 114.08 | 130.28 | 150.71 | 165.03 | 196.32 | 228.65 | 286.6 | 337.12 | 410.06 | 496.89 | 600.84 | 727.75 |
| 778.0 | 43.7 | 47.1 | 53.25 | 59.67 | 65.69 | 72.61 | 79.69 | 85.74 | 99.77 | 112.91 | 128.8 | 149.11 | 163.11 | 194.18 | 226.37 | 284.05 | 333.95 | 406.46 | 492.37 | 595.9 | 721.09 |
| 779.0 | 43.47 | 46.75 | 52.99 | 59.05 | 65.3 | 71.96 | 78.89 | 85.06 | 99 | 111.93 | 127.8 | 147.65 | 161.81 | 192.64 | 224.48 | 281.94 | 331.31 | 403.74 | 488.42 | 590.85 | 715.23 |
| 780.0 | 43.14 | 46.22 | 52.55 | 58.72 | 64.65 | 71.35 | 78.01 | 84.21 | 98.08 | 110.8 | 126.74 | 145.87 | 160.4 | 190.79 | 222.21 | 279.84 | 328.25 | 400.58 | 484.33 | 585.85 | 708.96 |
| 781.0 | 42.79 | 46.08 | 52.17 | 58.3 | 64.37 | 70.77 | 77.3 | 83.54 | 97.12 | 110.07 | 125.76 | 144.6 | 159.24 | 189.14 | 220.68 | 277.73 | 325.7 | 397.37 | 480.24 | 580.9 | 703 |
| 782.0 | 42.32 | 45.6 | 51.67 | 57.75 | 63.94 | 70.29 | 76.55 | 82.86 | 96.07 | 108.97 | 124.77 | 143.08 | 158.02 | 187.46 | 218.61 | 275.36 | 322.78 | 394.26 | 475.87 | 575.73 | 696.97 |
| 783.0 | 41.85 | 45.25 | 51.19 | 57.28 | 63.37 | 69.75 | 75.87 | 82.13 | 95.14 | 108.15 | 123.81 | 141.74 | 156.69 | 185.62 | 216.85 | 272.86 | 319.83 | 390.59 | 471.4 | 570.99 | 690.76 |
| 784.0 | 41.39 | 44.93 | 50.66 | 56.79 | 62.85 | 69.39 | 75.32 | 81.44 | 94.42 | 107.16 | 122.71 | 140.34 | 155.3 | 184.16 | 215.02 | 270.5 | 316.89 | 387.02 | 467.08 | 565.71 | 684.88 |
| 785.0 | 41.03 | 44.58 | 50.16 | 56.17 | 62.36 | 68.8 | 74.6 | 80.56 | 93.41 | 106.12 | 121.55 | 139.17 | 153.72 | 182.16 | 212.89 | 267.73 | 313.76 | 383.26 | 462.79 | 560.17 | 678.92 |
| 786.0 | 40.75 | 44.1 | 49.77 | 55.75 | 61.72 | 68.09 | 74.14 | 79.9 | 92.49 | 105.11 | 120.56 | 138.01 | 152.33 | 180.64 | 211.05 | 265.01 | 310.7 | 379.76 | 458.48 | 554.5 | 672.03 |
| 787.0 | 40.66 | 43.71 | 49.11 | 55.09 | 61.21 | 67.53 | 73.6 | 79.16 | 91.41 | 104 | 119.45 | 136.84 | 150.94 | 178.68 | 209.34 | 262.62 | 307.69 | 376.29 | 454.71 | 548.91 | 665.6 |
| 788.0 | 40.34 | 43.37 | 48.65 | 54.64 | 60.74 | 66.86 | 72.98 | 78.14 | 90.63 | 102.95 | 118.45 | 135.66 | 149.62 | 177.02 | 207.19 | 259.99 | 304.63 | 372.79 | 450.28 | 543.61 | 659.2 |
| 789.0 | 40.06 | 42.94 | 48.19 | 54.29 | 60.48 | 66.32 | 72.24 | 77.43 | 89.63 | 101.97 | 117.24 | 134.34 | 148.09 | 175.44 | 205.33 | 257.65 | 301.7 | 369.23 | 446.2 | 538.49 | 652.6 |
| 790.0 | 39.79 | 42.68 | 47.77 | 53.79 | 59.95 | 65.7 | 71.71 | 76.82 | 88.63 | 100.96 | 116.17 | 133.19 | 146.77 | 173.93 | 203.52 | 255.22 | 299.16 | 366.02 | 442.03 | 533.56 | 646.28 |
| 791.0 | 39.45 | 42.28 | 47.35 | 53.46 | 59.52 | 65.24 | 71.09 | 76.27 | 87.75 | 100.07 | 115.31 | 132.16 | 145.68 | 172.18 | 201.86 | 253.18 | 296.84 | 362.7 | 438.32 | 528.93 | 640.66 |
| 792.0 | 39.14 | 42.11 | 47.02 | 53.12 | 59.12 | 65.01 | 70.62 | 75.67 | 86.99 | 99.45 | 114.48 | 131.16 | 144.58 | 170.89 | 200.18 | 251.16 | 294.38 | 359.75 | 434.31 | 524.44 | 635.57 |
| 793.0 | 38.8 | 41.65 | 46.64 | 52.65 | 58.71 | 64.61 | 69.87 | 75.25 | 86.32 | 98.52 | 113.61 | 130.09 | 143.4 | 169.43 | 198.8 | 249.33 | 292.12 | 356.91 | 431.37 | 520.07 | 630.39 |
| 794.0 | 38.52 | 41.31 | 46.3 | 52.42 | 58.24 | 64.14 | 69.36 | 74.56 | 85.64 | 97.71 | 112.83 | 128.99 | 142.3 | 168.18 | 197.32 | 247.61 | 289.81 | 354.24 | 428.3 | 516.25 | 625.55 |
| 795.0 | 38.25 | 40.87 | 45.82 | 52 | 57.67 | 63.69 | 68.9 | 73.98 | 85.06 | 97.05 | 112.08 | 128.01 | 141.19 | 166.8 | 195.83 | 245.84 | 287.69 | 351.48 | 425.15 | 512.53 | 620.89 |
| 796.0 | 37.82 | 40.49 | 45.57 | 51.69 | 57.27 | 63.08 | 68.32 | 73.64 | 84.54 | 96.19 | 111.5 | 127.03 | 140.28 | 165.8 | 194.41 | 244.29 | 285.86 | 349.3 | 422.59 | 508.75 | 616.79 |
| 797.0 | 37.57 | 40.35 | 45.39 | 51.34 | 56.8 | 62.89 | 67.87 | 73.25 | 84.11 | 95.68 | 110.86 | 126.42 | 139.5 | 164.78 | 193.14 | 243.06 | 284.23 | 347.38 | 420.27 | 505.77 | 613.1 |
| 798.0 | 37.29 | 40.06 | 45.1 | 50.92 | 56.23 | 62.38 | 67.61 | 72.6 | 83.8 | 95.18 | 110.19 | 125.56 | 138.86 | 163.93 | 192.35 | 241.66 | 282.42 | 345.66 | 417.62 | 502.93 | 609.62 |
| 799.0 | 37.28 | 40.01 | 44.94 | 50.74 | 56.14 | 62.13 | 67.41 | 72.25 | 83.58 | 94.74 | 109.98 | 124.96 | 138.49 | 163.34 | 191.5 | 240.77 | 281.22 | 343.92 | 416.06 | 500.25 | 607.18 |
| 800.0 | 37.23 | 39.99 | 44.66 | 50.78 | 55.89 | 61.96 | 67.22 | 72.14 | 83.3 | 94.28 | 109.77 | 124.73 | 137.93 | 162.62 | 190.67 | 239.74 | 280.11 | 341.95 | 414.62 | 498.13 | 604.41 |
| 801.0 | 37.23 | 39.9 | 44.65 | 50.68 | 55.85 | 61.83 | 67.04 | 71.95 | 83.32 | 94.2 | 109.55 | 124.7 | 137.59 | 162.4 | 190.25 | 239.12 | 279.35 | 340.99 | 413.1 | 496.5 | 602.79 |
| 802.0 | 37.09 | 39.67 | 44.5 | 50.42 | 55.61 | 61.57 | 66.76 | 71.74 | 83.18 | 93.9 | 109.23 | 124.33 | 137.06 | 161.84 | 189.58 | 238.26 | 278.71 | 339.61 | 411.98 | 494.94 | 600.65 |
| 803.0 | 37 | 39.41 | 44.27 | 50.23 | 55.31 | 61.48 | 66.56 | 71.47 | 82.95 | 93.64 | 108.48 | 123.97 | 136.7 | 161.48 | 188.96 | 237.71 | 277.82 | 338.51 | 410.78 | 493.7 | 598.7 |
| 804.0 | 36.89 | 39.28 | 44.21 | 50.27 | 55.29 | 61.21 | 66.65 | 71.38 | 82.74 | 93.34 | 107.97 | 123.68 | 136.37 | 161.24 | 188.52 | 237.09 | 277.28 | 338.15 | 410.05 | 492.73 | 597.27 |
| 805.0 | 36.85 | 39.2 | 44.17 | 50.11 | 55.26 | 61.03 | 66.52 | 71.32 | 82.43 | 93.14 | 107.85 | 123.39 | 136.24 | 160.86 | 188.01 | 236.58 | 276.72 | 337.73 | 409.48 | 491.95 | 595.87 |
| 806.0 | 36.77 | 39.34 | 44.16 | 50.13 | 55.33 | 60.99 | 66.6 | 71.32 | 82.21 | 93.14 | 107.75 | 123.37 | 136.26 | 160.83 | 187.95 | 236.52 | 276.77 | 337.59 | 409 | 491.83 | 594.76 |
| 807.0 | 36.65 | 39.25 | 44.2 | 50.07 | 55.34 | 60.9 | 66.52 | 71.35 | 82.17 | 93.12 | 107.55 | 123.16 | 136.22 | 160.64 | 187.82 | 236.39 | 276.81 | 337.3 | 408.72 | 491.49 | 594.56 |
| 808.0 | 36.6 | 39.24 | 44.3 | 50.05 | 55.35 | 60.77 | 66.3 | 71.31 | 82.42 | 93.13 | 107.39 | 122.95 | 136.45 | 160.57 | 187.68 | 236.24 | 276.56 | 337.11 | 408.52 | 491.55 | 594.11 |
| 809.0 | 36.46 | 39.17 | 44.05 | 49.87 | 55.39 | 60.86 | 66.17 | 71.56 | 82.29 | 93.11 | 107.19 | 122.75 | 136.4 | 160.61 | 187.68 | 236.37 | 276.72 | 337.13 | 408.88 | 491.55 | 594.22 |
| 810.0 | 36.61 | 39.3 | 44.1 | 49.74 | 55.29 | 60.95 | 66.19 | 71.59 | 82.36 | 93.09 | 107.26 | 122.84 | 136.72 | 160.53 | 187.65 | 236.07 | 276.72 | 337.29 | 408.76 | 491.72 | 594.35 |
| 811.0 | 36.57 | 39.24 | 44.06 | 49.85 | 55.39 | 61.12 | 66.2 | 71.53 | 82.62 | 93.32 | 107.34 | 122.8 | 136.89 | 160.69 | 187.84 | 236.25 | 277.07 | 337.23 | 409.39 | 491.89 | 594.83 |
| 812.0 | 36.74 | 39.34 | 44.09 | 49.8 | 55.46 | 61.12 | 66.21 | 71.58 | 82.76 | 93.49 | 107.32 | 122.88 | 136.85 | 160.66 | 187.92 | 236.12 | 277.02 | 337.55 | 409.37 | 491.88 | 594.64 |
| 813.0 | 36.67 | 39.19 | 43.94 | 49.58 | 55.3 | 60.91 | 66.04 | 71.58 | 82.67 | 93.28 | 107.16 | 122.78 | 136.81 | 160.56 | 187.83 | 236.09 | 276.97 | 337.52 | 409.38 | 491.76 | 594.4 |
| 814.0 | 36.57 | 39.36 | 43.89 | 49.47 | 55.24 | 60.77 | 65.99 | 71.37 | 82.53 | 93.39 | 107.21 | 122.71 | 136.84 | 160.63 | 187.62 | 235.76 | 276.9 | 337.24 | 409.06 | 491.5 | 594.01 |
| 815.0 | 36.63 | 39.38 | 43.81 | 49.31 | 55.27 | 60.7 | 65.9 | 71.28 | 82.45 | 93.44 | 107.05 | 122.69 | 136.63 | 160.55 | 187.53 | 235.51 | 276.88 | 337.08 | 408.88 | 491.23 | 593.49 |
| 816.0 | 36.55 | 39.4 | 43.91 | 49.32 | 55.35 | 60.65 | 65.89 | 71.41 | 82.42 | 93.48 | 106.97 | 122.62 | 136.45 | 160.5 | 187.5 | 235.3 | 276.68 | 336.85 | 408.75 | 490.85 | 592.93 |
| 817.0 | 36.65 | 39.26 | 43.79 | 49.26 | 55.45 | 60.66 | 66.02 | 71.35 | 82.52 | 93.7 | 106.86 | 122.64 | 136.37 | 160.32 | 187.63 | 235.16 | 276.67 | 336.69 | 408.22 | 490.82 | 592.31 |
| 818.0 | 36.44 | 39.08 | 43.58 | 49.14 | 55.33 | 60.51 | 65.82 | 71.16 | 82.48 | 93.36 | 106.6 | 122.34 | 136.19 | 160.25 | 187.31 | 234.87 | 276.29 | 336.53 | 407.7 | 490.35 | 591.59 |
| 819.0 | 36.47 | 38.96 | 43.46 | 49.07 | 55.41 | 60.58 | 65.71 | 71.26 | 82.35 | 93.31 | 106.34 | 122.28 | 135.91 | 159.93 | 187.05 | 234.53 | 275.87 | 335.98 | 407.29 | 489.67 | 590.71 |
| 820.0 | 36.39 | 38.86 | 43.44 | 48.78 | 55.33 | 60.46 | 65.56 | 71.06 | 82.09 | 93.16 | 106.25 | 121.93 | 135.54 | 159.39 | 186.66 | 233.73 | 275.64 | 335.39 | 406.56 | 489.09 | 589.6 |
| 821.0 | 36.1 | 38.65 | 43.18 | 48.53 | 55.24 | 60.48 | 65.47 | 70.76 | 81.94 | 92.99 | 105.78 | 121.65 | 135.51 | 159.25 | 186.4 | 233.21 | 275.11 | 334.83 | 405.77 | 488.62 | 588.58 |
| 822.0 | 36.05 | 38.58 | 43.07 | 48.29 | 55.06 | 60.34 | 65.37 | 70.77 | 81.62 | 92.58 | 105.39 | 121.38 | 135.16 | 158.56 | 186.09 | 232.48 | 274.43 | 333.75 | 404.93 | 487.43 | 587.04 |
| 823.0 | 36.03 | 38.41 | 43.03 | 48.34 | 54.95 | 60.12 | 65.34 | 70.59 | 81.58 | 92.21 | 105.25 | 121.01 | 134.93 | 158.3 | 185.53 | 231.69 | 273.5 | 333.11 | 403.83 | 485.95 | 585.61 |
| 824.0 | 35.92 | 38.43 | 43 | 48.3 | 54.86 | 59.71 | 65.24 | 70.41 | 81.45 | 91.92 | 105.33 | 120.68 | 134.28 | 157.72 | 185.13 | 231.06 | 272.71 | 332.15 | 402.73 | 484.42 | 584.06 |
| 825.0 | 35.86 | 38.3 | 42.81 | 47.96 | 54.72 | 59.6 | 65.01 | 70.25 | 81.29 | 91.72 | 105.31 | 120.5 | 134.13 | 157.35 | 184.81 | 230.48 | 271.86 | 330.91 | 401.62 | 482.6 | 582.47 |
| 826.0 | 35.8 | 38.48 | 42.85 | 48.03 | 54.51 | 59.56 | 64.93 | 70.07 | 81.23 | 91.48 | 105.13 | 120.22 | 133.67 | 156.94 | 184.55 | 229.81 | 271.3 | 329.88 | 400.51 | 481.14 | 581.04 |
| 827.0 | 35.84 | 38.19 | 42.61 | 47.85 | 54.25 | 59.32 | 64.54 | 69.8 | 81.16 | 91.11 | 104.84 | 119.56 | 133.24 | 156.19 | 183.9 | 228.93 | 270.1 | 329.01 | 399.28 | 479.41 | 579.38 |
| 828.0 | 35.81 | 38.28 | 42.39 | 47.82 | 54.23 | 59.33 | 64.32 | 69.56 | 81.01 | 90.86 | 104.66 | 119.3 | 132.89 | 155.89 | 183.29 | 228.46 | 269.05 | 328.22 | 398.18 | 478.22 | 577.48 |
| 829.0 | 35.51 | 38.08 | 42.2 | 47.62 | 53.87 | 59.14 | 64.14 | 69.18 | 80.51 | 90.66 | 104.45 | 118.96 | 132.22 | 155.26 | 182.65 | 227.64 | 268.18 | 327.25 | 396.7 | 476.52 | 575.92 |
| 830.0 | 35.39 | 38.12 | 42.21 | 47.59 | 53.65 | 59.02 | 64.2 | 68.85 | 80.38 | 90.52 | 104.23 | 118.81 | 131.87 | 154.74 | 182.09 | 226.6 | 267.31 | 326 | 395.42 | 474.92 | 573.74 |
| 831.0 | 35.16 | 37.86 | 41.86 | 47.37 | 53.32 | 58.64 | 64.01 | 68.6 | 80.14 | 90.3 | 103.81 | 118.46 | 131.22 | 154.27 | 181.51 | 225.84 | 266.63 | 324.81 | 394.03 | 472.89 | 571.53 |
| 832.0 | 34.88 | 37.57 | 41.61 | 47.11 | 52.86 | 58.2 | 63.68 | 68.1 | 79.64 | 89.79 | 103.15 | 117.86 | 130.69 | 153.49 | 180.51 | 225 | 265.37 | 323.36 | 392.12 | 470.85 | 569.64 |
| 833.0 | 34.6 | 37.28 | 41.38 | 46.83 | 52.7 | 58.02 | 63.48 | 67.91 | 79.24 | 89.26 | 102.55 | 117.24 | 130.31 | 152.99 | 179.58 | 223.74 | 264.11 | 321.82 | 390.33 | 469.05 | 567.28 |
| 834.0 | 34.47 | 37.09 | 41.22 | 46.65 | 52.44 | 57.89 | 63.2 | 67.81 | 79.03 | 89.06 | 102.1 | 116.63 | 129.75 | 152.39 | 178.78 | 222.87 | 262.65 | 320.32 | 388.6 | 467.05 | 564.96 |
| 835.0 | 34.36 | 36.88 | 41.24 | 46.65 | 52.3 | 57.61 | 63.06 | 67.65 | 78.86 | 88.61 | 101.75 | 116.22 | 129.38 | 151.88 | 178.03 | 222.28 | 261.48 | 319.34 | 387.08 | 465.32 | 563.21 |
| 836.0 | 34.21 | 36.63 | 41.03 | 46.41 | 52 | 57.29 | 62.8 | 67.4 | 78.43 | 87.9 | 101.4 | 115.69 | 128.99 | 151.17 | 177.25 | 221.17 | 260.35 | 317.92 | 385.41 | 463.17 | 561.13 |
| 837.0 | 34.01 | 36.4 | 40.94 | 46.16 | 51.76 | 57.08 | 62.47 | 67.04 | 77.96 | 87.32 | 100.88 | 115.18 | 128.42 | 150.6 | 176.39 | 220.22 | 259.11 | 316.54 | 383.75 | 461.19 | 558.67 |
| 838.0 | 33.83 | 36.23 | 40.86 | 46.02 | 51.45 | 56.74 | 62.11 | 66.74 | 77.31 | 86.82 | 100.41 | 114.63 | 127.97 | 149.96 | 175.48 | 219.14 | 257.79 | 314.8 | 381.99 | 458.73 | 556.09 |
| 839.0 | 33.79 | 36.11 | 40.75 | 45.88 | 51.26 | 56.55 | 61.87 | 66.45 | 76.91 | 86.47 | 100.09 | 114.32 | 127.27 | 149.27 | 174.72 | 218.1 | 256.43 | 313.34 | 380.11 | 456.73 | 553.71 |
| 840.0 | 33.42 | 35.96 | 40.61 | 45.7 | 50.83 | 56.12 | 61.63 | 66.04 | 76.23 | 85.89 | 99.5 | 113.68 | 126.49 | 148.6 | 173.87 | 216.86 | 255.28 | 311.69 | 378.05 | 454.3 | 550.82 |
| 841.0 | 33.1 | 35.65 | 40.38 | 45.45 | 50.46 | 55.83 | 61.19 | 65.87 | 75.84 | 85.29 | 98.76 | 113.05 | 125.76 | 148.05 | 173.03 | 216.2 | 253.47 | 310.16 | 375.78 | 451.95 | 547.66 |
| 842.0 | 33.11 | 35.55 | 40.12 | 45.3 | 50.29 | 55.49 | 60.9 | 65.62 | 75.46 | 84.87 | 98.21 | 112.44 | 124.98 | 147.24 | 172.14 | 215.07 | 252.07 | 308.9 | 373.82 | 449.76 | 545.38 |
| 843.0 | 32.75 | 35.26 | 39.67 | 44.89 | 49.84 | 54.97 | 60.45 | 64.86 | 74.83 | 84.45 | 97.68 | 111.54 | 124.07 | 146.51 | 170.89 | 213.79 | 250.58 | 307.36 | 371.66 | 447.44 | 542.48 |
| 844.0 | 32.51 | 35.21 | 39.33 | 44.5 | 49.64 | 54.91 | 60.16 | 64.51 | 74.23 | 84.08 | 97.12 | 111.09 | 123.3 | 145.68 | 170.03 | 212.75 | 249.4 | 305.57 | 369.66 | 445.15 | 539.57 |
| 845.0 | 32.33 | 34.92 | 39.18 | 44.21 | 49.25 | 54.71 | 59.82 | 64.05 | 73.86 | 83.61 | 96.56 | 110.44 | 122.72 | 145.08 | 168.99 | 211.6 | 248.24 | 303.85 | 367.75 | 442.91 | 536.76 |
| 846.0 | 31.96 | 34.7 | 38.94 | 43.94 | 48.88 | 54.48 | 59.28 | 63.6 | 73.31 | 83.21 | 95.79 | 109.3 | 121.79 | 144.21 | 167.64 | 210.14 | 246.43 | 301.92 | 365.4 | 440.55 | 533.43 |
| 847.0 | 31.65 | 34.11 | 38.45 | 43.5 | 48.45 | 53.85 | 58.76 | 62.99 | 72.62 | 82.58 | 94.98 | 108.56 | 121 | 143.21 | 166.25 | 208.77 | 244.65 | 300.04 | 363.18 | 437.68 | 529.95 |
| 848.0 | 31.36 | 33.84 | 38.31 | 43.12 | 48.02 | 53.37 | 58.38 | 62.53 | 72.02 | 82 | 94.19 | 107.83 | 120.03 | 142.18 | 165.16 | 207.45 | 242.99 | 297.66 | 360.84 | 434.64 | 526.63 |
| 849.0 | 31.16 | 33.46 | 38.07 | 42.59 | 47.58 | 52.94 | 57.98 | 62.08 | 71.42 | 81.43 | 93.41 | 107.22 | 119.32 | 141.07 | 164.04 | 206.11 | 241.47 | 295.6 | 358.53 | 431.65 | 523.5 |
| 850.0 | 30.82 | 33.16 | 37.78 | 42.3 | 47.25 | 52.46 | 57.49 | 61.64 | 70.9 | 80.62 | 92.65 | 106.55 | 118.38 | 140.16 | 162.75 | 204.55 | 239.98 | 293.48 | 355.99 | 428.59 | 519.74 |
| 851.0 | 30.46 | 32.72 | 37.41 | 41.99 | 46.73 | 51.82 | 56.89 | 61.2 | 70.18 | 79.76 | 91.84 | 105.52 | 117.36 | 139.2 | 161.45 | 202.93 | 238.09 | 291.41 | 353.52 | 425.68 | 516.13 |
| 852.0 | 30.07 | 32.33 | 37.12 | 41.57 | 46.36 | 51.38 | 56.31 | 60.45 | 69.51 | 78.92 | 91.03 | 104.4 | 116.21 | 137.82 | 159.94 | 201.42 | 235.86 | 288.93 | 350.79 | 422.75 | 512.15 |
| 853.0 | 29.81 | 32.13 | 36.84 | 41.25 | 45.98 | 50.98 | 55.87 | 60.17 | 68.98 | 78.22 | 90.51 | 103.5 | 115.3 | 136.51 | 158.82 | 199.61 | 233.95 | 286.72 | 348.09 | 419.86 | 508.1 |
| 854.0 | 29.62 | 31.92 | 36.55 | 40.98 | 45.61 | 50.63 | 55.59 | 59.69 | 68.47 | 77.77 | 89.9 | 102.78 | 114.43 | 135.32 | 157.67 | 198.46 | 232.29 | 284.58 | 345.43 | 416.99 | 504.58 |
| 855.0 | 29.17 | 31.58 | 36.19 | 40.71 | 45.17 | 49.95 | 55.07 | 58.93 | 67.83 | 76.97 | 89.02 | 101.84 | 113.42 | 134.02 | 156.36 | 196.89 | 230.71 | 282.23 | 342.72 | 413.55 | 500.85 |
| 856.0 | 28.79 | 31.16 | 35.77 | 40.26 | 44.74 | 49.5 | 54.39 | 58.41 | 67.1 | 76.26 | 88.11 | 100.89 | 112.18 | 132.65 | 155 | 195.17 | 228.52 | 279.71 | 339.9 | 410.06 | 496.42 |
| 857.0 | 28.38 | 30.83 | 35.39 | 39.94 | 44.24 | 49.12 | 53.7 | 57.73 | 66.28 | 75.73 | 87.26 | 99.99 | 111.06 | 131.66 | 153.41 | 193.52 | 226.35 | 277.34 | 337.01 | 406.44 | 491.99 |
| 858.0 | 28.02 | 30.47 | 34.81 | 39.41 | 43.58 | 48.55 | 53.02 | 57.16 | 65.82 | 75.01 | 86.44 | 98.94 | 109.94 | 130.09 | 152.09 | 191.68 | 224.2 | 274.49 | 333.77 | 402.45 | 487.49 |
| 859.0 | 27.63 | 30.17 | 34.33 | 38.87 | 43.08 | 47.98 | 52.44 | 56.56 | 65.28 | 74.27 | 85.51 | 97.81 | 108.72 | 128.57 | 150.44 | 189.87 | 221.74 | 271.92 | 330.67 | 398.84 | 482.78 |
| 860.0 | 27.31 | 29.84 | 33.89 | 38.36 | 42.62 | 47.45 | 51.81 | 56.06 | 64.42 | 73.47 | 84.59 | 96.55 | 107.58 | 127.1 | 148.84 | 188.01 | 219.64 | 268.85 | 327.49 | 394.58 | 477.6 |
| 861.0 | 27.06 | 29.51 | 33.53 | 38 | 42.4 | 46.9 | 51.19 | 55.38 | 63.74 | 72.76 | 83.76 | 95.49 | 106.59 | 125.64 | 146.86 | 186.1 | 217.28 | 266 | 324.1 | 390.69 | 472.75 |
| 862.0 | 26.77 | 29.16 | 33.02 | 37.56 | 41.86 | 46.32 | 50.54 | 54.72 | 62.8 | 71.92 | 82.71 | 94.43 | 105.46 | 124.18 | 145.13 | 183.64 | 214.97 | 262.87 | 320.62 | 386.17 | 468.24 |
| 863.0 | 26.27 | 28.64 | 32.59 | 37.06 | 41.23 | 45.76 | 49.8 | 53.98 | 62.01 | 71.03 | 81.77 | 92.95 | 103.99 | 122.46 | 143.53 | 181.35 | 212.25 | 259.55 | 316.35 | 381.22 | 462.44 |
| 864.0 | 25.85 | 28.29 | 32.23 | 36.56 | 40.76 | 45.27 | 49.12 | 53.49 | 61.38 | 69.94 | 80.82 | 91.96 | 102.78 | 120.89 | 141.87 | 178.99 | 209.67 | 256.45 | 312.36 | 376.63 | 456.75 |
| 865.0 | 25.38 | 27.65 | 31.76 | 36.06 | 40.19 | 44.42 | 48.41 | 52.75 | 60.5 | 68.89 | 79.42 | 90.56 | 101.3 | 119.18 | 139.91 | 176.54 | 206.62 | 253.07 | 308.34 | 371.75 | 450.97 |
| 866.0 | 24.99 | 27.27 | 31.31 | 35.49 | 39.56 | 43.75 | 47.53 | 52.02 | 59.74 | 67.96 | 78.16 | 89.43 | 100.04 | 117.45 | 137.93 | 173.89 | 203.54 | 249.76 | 304.32 | 366.75 | 445.03 |
| 867.0 | 24.77 | 26.87 | 30.78 | 35.05 | 39.03 | 43.07 | 46.84 | 51.31 | 59.11 | 66.99 | 77.18 | 88.35 | 98.65 | 115.74 | 136.33 | 171.63 | 200.95 | 246.53 | 300.5 | 361.9 | 439.4 |
| 868.0 | 24.47 | 26.49 | 30.31 | 34.64 | 38.52 | 42.56 | 46.18 | 50.73 | 58.34 | 66.24 | 76.13 | 87.11 | 97.27 | 114.09 | 134.61 | 169.33 | 198.21 | 243.14 | 296.31 | 357.27 | 433.63 |
| 869.0 | 24.08 | 26.16 | 29.82 | 34.14 | 38.11 | 41.94 | 45.61 | 50.07 | 57.54 | 65.37 | 75.28 | 86.07 | 96.08 | 112.68 | 132.68 | 166.89 | 195.45 | 240 | 292.29 | 352.85 | 428.07 |
| 870.0 | 23.39 | 25.65 | 29.31 | 33.66 | 37.41 | 41.19 | 44.79 | 49.25 | 56.66 | 64.36 | 74.27 | 84.55 | 94.48 | 110.87 | 130.68 | 164.31 | 192.45 | 236.47 | 288 | 348.22 | 422.1 |
| 871.0 | 23.1 | 25.28 | 28.87 | 33.05 | 36.87 | 40.7 | 44.18 | 48.61 | 55.91 | 63.65 | 73.28 | 83.44 | 93.28 | 109.47 | 128.92 | 162.08 | 189.63 | 233.27 | 283.97 | 343.84 | 417.03 |
| 872.0 | 22.93 | 24.97 | 28.38 | 32.63 | 36.35 | 40.29 | 43.66 | 47.99 | 55.31 | 62.99 | 72.36 | 82.38 | 92.26 | 107.94 | 127.31 | 160.13 | 187.32 | 230.37 | 280.29 | 339.38 | 411.98 |
| 873.0 | 22.75 | 24.65 | 28.07 | 32.26 | 35.89 | 39.66 | 43.13 | 47.68 | 54.65 | 62.4 | 71.46 | 81.43 | 91.13 | 106.68 | 125.84 | 158.08 | 185.12 | 227.76 | 276.92 | 335.48 | 407.44 |
| 874.0 | 22.52 | 24.3 | 27.74 | 31.81 | 35.5 | 39.18 | 42.72 | 47.07 | 53.96 | 61.76 | 70.6 | 80.49 | 90.02 | 105.7 | 124.33 | 156.27 | 182.8 | 225.17 | 273.97 | 331.68 | 402.8 |
| 875.0 | 22.21 | 23.95 | 27.4 | 31.49 | 34.94 | 38.73 | 42.07 | 46.52 | 53.43 | 60.91 | 69.91 | 79.43 | 88.99 | 104.54 | 122.89 | 154.26 | 180.72 | 222.78 | 271.13 | 328.01 | 398.43 |
| 876.0 | 22.13 | 23.92 | 27.25 | 31.04 | 34.72 | 38.48 | 41.66 | 46.12 | 52.89 | 60.46 | 69.36 | 78.77 | 88.15 | 103.63 | 121.72 | 152.65 | 178.72 | 220.82 | 268.61 | 325.18 | 394.36 |
| 877.0 | 21.97 | 23.73 | 26.86 | 30.73 | 34.12 | 38.08 | 41.48 | 45.59 | 52.49 | 59.85 | 68.78 | 78.09 | 87.35 | 102.68 | 120.65 | 150.98 | 177.16 | 218.96 | 266.11 | 322.32 | 390.83 |
| 878.0 | 21.77 | 23.5 | 26.52 | 30.37 | 33.89 | 37.65 | 41.26 | 45.31 | 52.23 | 59.34 | 68.16 | 77.48 | 86.53 | 101.66 | 119.73 | 149.69 | 175.86 | 217.04 | 263.83 | 319.76 | 387.75 |
| 879.0 | 21.66 | 23.53 | 26.5 | 30.36 | 33.75 | 37.53 | 41.26 | 45 | 51.86 | 59.1 | 67.73 | 77.27 | 86.08 | 101.27 | 118.75 | 148.71 | 174.67 | 215.74 | 261.72 | 317.78 | 385.39 |
| 880.0 | 21.57 | 23.33 | 26.24 | 30.12 | 33.46 | 37.29 | 40.89 | 44.56 | 51.65 | 58.67 | 67.28 | 76.89 | 85.57 | 100.72 | 118.07 | 147.7 | 173.63 | 214.24 | 259.94 | 315.82 | 383.26 |
| 881.0 | 21.28 | 23.08 | 25.98 | 29.85 | 33.12 | 36.92 | 40.47 | 44.07 | 51.29 | 58.25 | 66.82 | 76.33 | 84.87 | 99.99 | 117.36 | 146.34 | 172.27 | 212.99 | 258.34 | 314.42 | 381.52 |
| 882.0 | 21.15 | 22.91 | 25.78 | 29.58 | 32.76 | 36.64 | 40.33 | 43.83 | 51.23 | 57.96 | 66.31 | 75.94 | 84.35 | 99.4 | 117.05 | 145.52 | 171.48 | 212.06 | 257.14 | 313.02 | 379.72 |
| 883.0 | 21.09 | 22.81 | 25.56 | 29.45 | 32.5 | 36.41 | 40.24 | 43.54 | 51.18 | 57.71 | 66.08 | 75.58 | 83.96 | 98.99 | 116.5 | 145.14 | 170.97 | 211.39 | 256.16 | 312.13 | 378.22 |
| 884.0 | 21.02 | 22.74 | 25.51 | 29.29 | 32.41 | 36.2 | 40.08 | 43.26 | 50.9 | 57.42 | 65.96 | 75.63 | 83.77 | 98.77 | 116.08 | 144.81 | 170.63 | 210.97 | 256.02 | 311.45 | 377.24 |
| 885.0 | 20.99 | 22.6 | 25.27 | 29.25 | 32.23 | 35.94 | 40.05 | 43.09 | 50.75 | 57.37 | 65.55 | 75.36 | 83.64 | 98.71 | 115.64 | 144.66 | 170.11 | 210.29 | 255.85 | 310.95 | 376.64 |
| 886.0 | 21.06 | 22.58 | 25.19 | 29.2 | 32.12 | 35.91 | 39.95 | 42.95 | 50.9 | 57.3 | 65.67 | 75.25 | 83.57 | 98.52 | 115.48 | 144.43 | 170.25 | 210.14 | 255.75 | 310.79 | 376.56 |
| 887.0 | 21.04 | 22.5 | 25.08 | 29.23 | 32.26 | 35.91 | 39.91 | 42.95 | 50.72 | 57.28 | 65.77 | 74.98 | 83.42 | 98.4 | 115.47 | 144.56 | 170.29 | 210.09 | 255.51 | 310.96 | 376.59 |
| 888.0 | 20.94 | 22.34 | 25.06 | 29.09 | 32.19 | 35.71 | 40.04 | 42.86 | 50.55 | 56.96 | 65.55 | 74.96 | 83.3 | 98.36 | 115.13 | 144.5 | 170.34 | 209.91 | 255.44 | 310.99 | 376.49 |
| 889.0 | 20.78 | 22.38 | 25.04 | 28.92 | 32.09 | 35.59 | 39.93 | 42.72 | 50.38 | 56.69 | 65.53 | 74.83 | 83.14 | 98.43 | 114.82 | 144.44 | 170.38 | 209.94 | 255.46 | 311.27 | 376.27 |
| 890.0 | 20.71 | 22.38 | 25.04 | 29.02 | 31.98 | 35.59 | 39.91 | 42.83 | 50.48 | 56.71 | 65.5 | 74.77 | 83.12 | 98.49 | 114.96 | 144.63 | 170.59 | 210.18 | 255.6 | 311.51 | 376.22 |
| 891.0 | 20.76 | 22.37 | 25.05 | 28.97 | 31.97 | 35.64 | 39.95 | 42.84 | 50.52 | 56.75 | 65.48 | 74.92 | 83.19 | 98.82 | 115.08 | 144.81 | 170.93 | 210.22 | 255.96 | 311.52 | 376.57 |
| 892.0 | 20.68 | 22.31 | 24.95 | 28.96 | 31.92 | 35.67 | 40.03 | 42.87 | 50.41 | 56.67 | 65.49 | 74.79 | 83.1 | 98.75 | 115.06 | 145.03 | 171.15 | 210.23 | 256.21 | 311.66 | 376.3 |
| 893.0 | 20.65 | 22.25 | 24.95 | 28.88 | 32.01 | 35.7 | 39.9 | 42.87 | 50.42 | 56.61 | 65.54 | 74.67 | 83 | 98.74 | 115.2 | 145.13 | 171.08 | 210.11 | 256.21 | 312 | 376.48 |
| 894.0 | 20.59 | 22.33 | 24.9 | 28.89 | 31.91 | 35.79 | 39.9 | 42.79 | 50.53 | 56.54 | 65.61 | 74.71 | 83.11 | 98.71 | 115 | 145.09 | 170.82 | 209.81 | 255.81 | 311.66 | 376.52 |
| 895.0 | 20.52 | 22.33 | 24.91 | 28.9 | 31.77 | 35.69 | 39.81 | 42.77 | 50.62 | 56.45 | 65.47 | 74.65 | 83.08 | 98.46 | 114.97 | 144.93 | 170.82 | 209.65 | 255.32 | 311.33 | 376.34 |
| 896.0 | 20.42 | 22.26 | 24.84 | 28.66 | 31.74 | 35.52 | 39.69 | 42.53 | 50.38 | 56.1 | 65.27 | 74.49 | 82.74 | 98.42 | 114.84 | 144.74 | 170.32 | 208.96 | 254.45 | 310.71 | 375.66 |
| 897.0 | 20.13 | 21.89 | 24.57 | 28.58 | 31.66 | 35.17 | 39.48 | 42.31 | 50.1 | 55.78 | 64.91 | 74.17 | 82.46 | 98.04 | 114.3 | 144.22 | 169.76 | 208.17 | 253.48 | 309.69 | 374.57 |
| 898.0 | 20 | 21.81 | 24.52 | 28.39 | 31.68 | 35.06 | 39.25 | 42.09 | 49.88 | 55.62 | 64.62 | 73.89 | 82.18 | 97.75 | 113.9 | 143.74 | 169.19 | 207.14 | 252.71 | 308.7 | 373.38 |
| 899.0 | 19.89 | 21.78 | 24.59 | 28.25 | 31.59 | 35.01 | 39.13 | 41.89 | 49.56 | 55.39 | 64.31 | 73.47 | 81.94 | 97.18 | 113.38 | 143.02 | 168.31 | 206.35 | 251.66 | 307.59 | 371.77 |
| 900.0 | 19.75 | 21.38 | 24.36 | 27.97 | 31.41 | 34.76 | 38.73 | 41.6 | 49.1 | 54.88 | 63.76 | 72.88 | 81.34 | 96.55 | 112.75 | 141.99 | 167.34 | 205.11 | 250.61 | 306.11 | 369.63 |
| 901.0 | 19.64 | 21.21 | 24.35 | 27.71 | 31.23 | 34.56 | 38.41 | 41.47 | 48.65 | 54.6 | 63.36 | 72.38 | 80.93 | 96.03 | 111.95 | 141.19 | 166.26 | 203.98 | 248.95 | 304.37 | 367.55 |
| 902.0 | 19.43 | 20.93 | 24.17 | 27.51 | 31.04 | 34.36 | 38.29 | 41.22 | 48.48 | 54.3 | 62.83 | 71.97 | 80.59 | 95.44 | 111.2 | 140.6 | 165.4 | 202.65 | 247.31 | 302 | 364.91 |
| 903.0 | 19.39 | 20.75 | 23.99 | 27.4 | 30.9 | 34.32 | 38.05 | 41.08 | 48.19 | 53.93 | 62.45 | 71.51 | 80.01 | 94.88 | 110.61 | 139.68 | 164.01 | 201.05 | 245.48 | 299.74 | 362.39 |
| 904.0 | 19.3 | 20.56 | 23.89 | 27.07 | 30.75 | 34.18 | 37.71 | 41.02 | 48.01 | 53.57 | 62.04 | 71.07 | 79.5 | 94.1 | 109.77 | 138.53 | 162.7 | 199.46 | 243.58 | 297.58 | 359.67 |
| 905.0 | 19.02 | 20.4 | 23.57 | 26.83 | 30.34 | 33.92 | 37.49 | 40.78 | 47.58 | 53.21 | 61.33 | 70.43 | 78.78 | 93.31 | 108.53 | 137.13 | 161.22 | 197.27 | 241.07 | 294.91 | 356.22 |
| 906.0 | 18.93 | 20.17 | 23.4 | 26.65 | 30.15 | 33.81 | 37.16 | 40.36 | 47.19 | 52.79 | 60.71 | 69.83 | 78.08 | 92.33 | 107.67 | 135.78 | 159.84 | 195.59 | 238.72 | 292.19 | 352.99 |
| 907.0 | 18.64 | 20.02 | 23.18 | 26.45 | 29.85 | 33.54 | 36.79 | 39.91 | 46.64 | 52.29 | 60.06 | 69.14 | 77.44 | 91.53 | 106.39 | 134.65 | 158.2 | 193.65 | 236.03 | 289.28 | 349.19 |
| 908.0 | 18.44 | 19.94 | 22.98 | 26.13 | 29.52 | 33.12 | 36.41 | 39.52 | 46.21 | 51.72 | 59.37 | 68.46 | 76.65 | 90.65 | 105.09 | 133.18 | 156.51 | 191.45 | 233.64 | 285.86 | 345.19 |
| 909.0 | 18.25 | 19.83 | 22.77 | 25.91 | 29.25 | 32.96 | 35.99 | 39.25 | 45.63 | 51.38 | 58.8 | 67.74 | 75.89 | 89.53 | 103.88 | 131.73 | 154.64 | 189.31 | 230.82 | 282.69 | 341.22 |
| 910.0 | 18.19 | 19.65 | 22.53 | 25.78 | 29.05 | 32.69 | 35.87 | 38.88 | 45.45 | 50.97 | 58.25 | 66.99 | 75.21 | 88.52 | 102.96 | 130.27 | 152.66 | 186.87 | 228.1 | 279.05 | 337.53 |
| 911.0 | 17.99 | 19.42 | 22.32 | 25.43 | 28.81 | 32.33 | 35.36 | 38.29 | 44.85 | 50.29 | 57.54 | 66.19 | 74.39 | 87.33 | 101.59 | 128.48 | 150.72 | 184.21 | 225.13 | 275.44 | 333.26 |
| 912.0 | 17.83 | 19.21 | 22.01 | 25.15 | 28.46 | 32.01 | 35.01 | 37.81 | 44.31 | 49.55 | 56.75 | 65.39 | 73.43 | 85.99 | 100.23 | 126.71 | 148.68 | 181.8 | 221.82 | 271.84 | 328.66 |
| 913.0 | 17.84 | 19.21 | 21.88 | 24.98 | 28.25 | 31.63 | 34.72 | 37.44 | 43.95 | 49.16 | 56.08 | 64.63 | 72.59 | 84.94 | 98.98 | 124.83 | 146.53 | 179.51 | 218.7 | 268 | 324.06 |
| 914.0 | 17.48 | 18.99 | 21.59 | 24.72 | 27.86 | 31.24 | 34.21 | 36.99 | 43.37 | 48.52 | 55.33 | 63.79 | 71.43 | 83.82 | 97.19 | 122.91 | 144.24 | 176.71 | 215.29 | 263.69 | 318.81 |
| 915.0 | 17.1 | 18.64 | 21.25 | 24.25 | 27.43 | 30.84 | 33.69 | 36.37 | 42.6 | 47.71 | 54.51 | 62.83 | 70.21 | 82.54 | 95.61 | 120.93 | 141.97 | 173.94 | 212.08 | 259.62 | 313.6 |
| 916.0 | 16.89 | 18.31 | 20.84 | 23.86 | 27.12 | 30.45 | 33.12 | 35.83 | 41.9 | 47 | 53.71 | 61.88 | 69.02 | 81.37 | 93.96 | 118.92 | 139.48 | 170.92 | 208.54 | 255.06 | 307.95 |
| 917.0 | 16.59 | 17.96 | 20.37 | 23.52 | 26.57 | 29.93 | 32.51 | 35.12 | 41.23 | 46.41 | 52.8 | 60.94 | 67.95 | 79.81 | 92.07 | 116.61 | 137.04 | 167.8 | 204.85 | 250.35 | 302.06 |
| 918.0 | 16.46 | 17.86 | 20.1 | 23.1 | 26.05 | 29.51 | 32.02 | 34.59 | 40.62 | 45.74 | 51.98 | 60.05 | 66.79 | 78.42 | 90.5 | 114.34 | 134.52 | 164.73 | 201.12 | 245.61 | 296.61 |
| 919.0 | 16.27 | 17.48 | 19.66 | 22.73 | 25.55 | 28.98 | 31.42 | 34.01 | 39.91 | 44.88 | 50.98 | 58.85 | 65.39 | 76.86 | 88.69 | 112.22 | 131.9 | 161.53 | 196.78 | 240.61 | 290.47 |
| 920.0 | 15.94 | 17.08 | 19.15 | 22.26 | 24.99 | 28.4 | 30.7 | 33.35 | 39.28 | 43.99 | 50.1 | 57.65 | 63.94 | 75.35 | 86.89 | 109.91 | 129.03 | 158.06 | 192.57 | 235.45 | 284.34 |
| 921.0 | 15.64 | 16.72 | 18.59 | 21.67 | 24.35 | 27.71 | 30.02 | 32.66 | 38.49 | 43.14 | 49.08 | 56.32 | 62.6 | 73.56 | 84.94 | 107.51 | 126.18 | 154.59 | 188.25 | 230.12 | 277.85 |
| 922.0 | 15.34 | 16.52 | 18.2 | 21.46 | 23.95 | 27.11 | 29.52 | 31.87 | 37.8 | 42.19 | 48.06 | 55.13 | 61.23 | 71.91 | 83.02 | 105.13 | 123.46 | 151.13 | 184.27 | 224.85 | 271.65 |
| 923.0 | 15.19 | 16.25 | 17.86 | 20.98 | 23.47 | 26.62 | 28.93 | 31.25 | 36.92 | 41.21 | 47.12 | 53.91 | 59.79 | 70.28 | 81.1 | 102.64 | 120.64 | 147.54 | 179.96 | 219.56 | 265.18 |
| 924.0 | 14.79 | 15.93 | 17.42 | 20.52 | 22.98 | 25.89 | 28.14 | 30.48 | 36.04 | 40.28 | 46.07 | 52.74 | 58.29 | 68.57 | 78.96 | 100.16 | 117.8 | 144.03 | 175.42 | 213.85 | 258.67 |
| 925.0 | 14.48 | 15.65 | 17.02 | 20.18 | 22.52 | 25.22 | 27.57 | 29.61 | 35.1 | 39.37 | 44.95 | 51.47 | 56.84 | 67.03 | 77.08 | 97.52 | 114.62 | 140.1 | 170.63 | 207.83 | 251.23 |
| 926.0 | 14.19 | 15.19 | 16.7 | 19.7 | 21.93 | 24.51 | 26.8 | 28.84 | 34.13 | 38.2 | 43.66 | 49.96 | 55.36 | 65.14 | 74.94 | 94.59 | 111.2 | 135.95 | 165.59 | 201.41 | 243.87 |
| 927.0 | 13.66 | 14.78 | 16.18 | 18.99 | 21.26 | 23.72 | 25.92 | 27.87 | 32.97 | 36.8 | 42.42 | 48.26 | 53.37 | 63.01 | 72.35 | 91.42 | 107.24 | 131.15 | 159.88 | 194.18 | 235.5 |
| 928.0 | 13.18 | 14.3 | 15.53 | 18.26 | 20.44 | 22.78 | 24.97 | 26.92 | 31.7 | 35.41 | 40.87 | 46.48 | 51.38 | 60.57 | 69.81 | 87.9 | 103 | 126.08 | 153.8 | 186.7 | 226.49 |
| 929.0 | 12.56 | 13.62 | 14.8 | 17.54 | 19.58 | 21.92 | 24.04 | 25.87 | 30.4 | 33.89 | 39.26 | 44.6 | 49.31 | 58.09 | 67.06 | 84.35 | 98.63 | 120.69 | 147.34 | 178.99 | 216.9 |
| 930.0 | 11.81 | 12.89 | 13.98 | 16.6 | 18.47 | 20.74 | 22.72 | 24.52 | 28.87 | 32.26 | 37.44 | 42.49 | 47.12 | 55.49 | 64.06 | 80.36 | 94 | 115.09 | 140.57 | 170.34 | 206.74 |
| 931.0 | 11.09 | 12.11 | 13.24 | 15.58 | 17.37 | 19.69 | 21.36 | 23.24 | 27.23 | 30.6 | 35.44 | 40.49 | 44.66 | 52.71 | 60.77 | 76.22 | 89.41 | 109.47 | 133.47 | 161.75 | 196.21 |
| 932.0 | 10.42 | 11.34 | 12.38 | 14.65 | 16.3 | 18.55 | 20.15 | 22.01 | 25.71 | 29.02 | 33.58 | 38.26 | 42.14 | 50.01 | 57.41 | 72.27 | 84.58 | 103.68 | 126.33 | 152.91 | 185.69 |
| 933.0 | 9.91 | 10.73 | 11.7 | 13.88 | 15.39 | 17.54 | 19 | 20.87 | 24.4 | 27.61 | 31.84 | 36.16 | 39.71 | 47.39 | 54.21 | 68.31 | 79.9 | 97.98 | 119.32 | 144.24 | 175.09 |
| 934.0 | 9.16 | 9.89 | 10.94 | 12.99 | 14.38 | 16.44 | 17.8 | 19.55 | 22.85 | 25.87 | 29.93 | 34 | 37.43 | 44.6 | 50.92 | 64.29 | 75.2 | 91.92 | 112.2 | 135.63 | 164.76 |
| 935.0 | 8.61 | 9.3 | 10.31 | 12.11 | 13.45 | 15.38 | 16.71 | 18.22 | 21.45 | 24.35 | 28.06 | 31.97 | 35.18 | 41.82 | 47.93 | 60.48 | 70.63 | 86.31 | 105.27 | 127.29 | 154.77 |
| 936.0 | 8.15 | 8.65 | 9.73 | 11.31 | 12.68 | 14.4 | 15.62 | 17.05 | 20.07 | 22.96 | 26.31 | 29.97 | 33.05 | 39.26 | 45.07 | 56.73 | 66.37 | 80.97 | 98.6 | 119.16 | 144.9 |
| 937.0 | 7.63 | 8.12 | 9.1 | 10.57 | 11.9 | 13.44 | 14.63 | 15.82 | 18.74 | 21.46 | 24.7 | 28.09 | 30.95 | 36.68 | 42.12 | 53.08 | 62.13 | 75.66 | 92.25 | 111.47 | 135.52 |
| 938.0 | 7.1 | 7.47 | 8.53 | 9.81 | 11.1 | 12.49 | 13.62 | 14.89 | 17.45 | 20.05 | 23.06 | 26.21 | 28.96 | 34.26 | 39.48 | 49.72 | 58.02 | 70.76 | 86.37 | 104.06 | 126.8 |
| 939.0 | 6.58 | 6.79 | 7.97 | 9.13 | 10.39 | 11.75 | 12.66 | 13.87 | 16.33 | 18.61 | 21.63 | 24.47 | 27.08 | 31.98 | 36.92 | 46.73 | 54.23 | 66.01 | 80.53 | 97.13 | 118.27 |
| 940.0 | 5.94 | 6.26 | 7.35 | 8.28 | 9.66 | 10.87 | 11.67 | 12.92 | 15.08 | 17.31 | 20.21 | 22.91 | 25.43 | 29.81 | 34.43 | 43.36 | 50.57 | 61.6 | 75.12 | 90.48 | 110.28 |
| 941.0 | 5.53 | 5.83 | 6.85 | 7.82 | 8.93 | 10.18 | 10.83 | 12.02 | 13.99 | 16.25 | 18.79 | 21.52 | 23.92 | 27.91 | 32.25 | 40.57 | 47.42 | 57.55 | 70.13 | 84.38 | 102.79 |
| 942.0 | 5.19 | 5.46 | 6.45 | 7.41 | 8.42 | 9.48 | 10.11 | 11.18 | 13.17 | 15.16 | 17.63 | 20.23 | 22.5 | 26.31 | 30.13 | 38.02 | 44.31 | 53.78 | 65.39 | 78.83 | 96.02 |
| 943.0 | 4.67 | 5 | 5.89 | 6.81 | 7.76 | 8.89 | 9.49 | 10.45 | 12.17 | 14.22 | 16.45 | 18.87 | 20.98 | 24.65 | 28.19 | 35.45 | 41.33 | 50.1 | 60.98 | 73.49 | 89.41 |
| 944.0 | 4.26 | 4.65 | 5.47 | 6.35 | 7.2 | 8.24 | 8.87 | 9.73 | 11.41 | 13.46 | 15.35 | 17.73 | 19.75 | 23.22 | 26.47 | 33.29 | 38.73 | 47.04 | 57.17 | 68.79 | 83.7 |
| 945.0 | 3.87 | 4.22 | 5.13 | 5.78 | 6.63 | 7.64 | 8.17 | 9 | 10.59 | 12.49 | 14.5 | 16.51 | 18.62 | 21.81 | 24.87 | 31.16 | 36.27 | 44.06 | 53.95 | 64.61 | 78.37 |
| 946.0 | 3.46 | 3.86 | 4.74 | 5.33 | 6.12 | 7.29 | 7.53 | 8.46 | 9.89 | 11.69 | 13.64 | 15.54 | 17.55 | 20.36 | 23.38 | 29.45 | 34.15 | 41.63 | 51.1 | 61.07 | 74.06 |
| 947.0 | 3.2 | 3.69 | 4.4 | 4.99 | 5.91 | 7.04 | 7.11 | 8.14 | 9.58 | 11.3 | 13.08 | 15 | 16.65 | 19.38 | 22.45 | 28.37 | 32.63 | 39.81 | 48.95 | 58.5 | 70.54 |
| 948.0 | 3.06 | 3.53 | 4.2 | 4.82 | 5.71 | 6.82 | 6.83 | 7.98 | 9.3 | 11.05 | 12.73 | 14.71 | 16.22 | 18.64 | 21.8 | 27.53 | 31.74 | 38.69 | 47.53 | 56.74 | 68.26 |
| 949.0 | 2.91 | 3.3 | 4.08 | 4.7 | 5.52 | 6.65 | 6.65 | 7.85 | 8.99 | 10.79 | 12.5 | 14.49 | 15.88 | 18.27 | 21.38 | 27.07 | 31.13 | 37.9 | 46.62 | 55.78 | 67.12 |
| 950.0 | 2.88 | 3.31 | 4.02 | 4.76 | 5.44 | 6.6 | 6.56 | 7.76 | 8.99 | 10.69 | 12.25 | 14.36 | 15.77 | 18.05 | 21.26 | 26.83 | 31.04 | 37.74 | 46.28 | 55.65 | 67.14 |
| 951.0 | 3.12 | 3.41 | 4.21 | 4.98 | 5.57 | 6.81 | 6.8 | 7.95 | 9.26 | 10.88 | 12.5 | 14.59 | 15.93 | 18.2 | 21.56 | 27.15 | 31.47 | 38.14 | 46.61 | 56.33 | 67.87 |
| 952.0 | 3.33 | 3.65 | 4.29 | 5.31 | 5.85 | 7.07 | 7.01 | 8.27 | 9.64 | 11.11 | 12.86 | 14.88 | 16.37 | 18.65 | 21.99 | 27.81 | 32.21 | 38.89 | 47.59 | 57.6 | 69.19 |
| 953.0 | 3.48 | 3.84 | 4.42 | 5.43 | 6.05 | 7.4 | 7.33 | 8.52 | 9.88 | 11.43 | 13.09 | 15.47 | 16.8 | 19.12 | 22.77 | 28.47 | 32.99 | 39.97 | 48.85 | 59.06 | 70.97 |
| 954.0 | 3.52 | 3.96 | 4.58 | 5.52 | 6.27 | 7.51 | 7.7 | 8.71 | 10.2 | 11.7 | 13.42 | 15.75 | 17.51 | 19.8 | 23.47 | 29.24 | 33.77 | 41.18 | 50.25 | 60.74 | 73.29 |
| 955.0 | 3.58 | 4.15 | 4.73 | 5.71 | 6.52 | 7.72 | 7.88 | 8.97 | 10.55 | 11.95 | 13.71 | 16.22 | 17.94 | 20.44 | 24.16 | 30.23 | 34.91 | 42.62 | 51.89 | 62.68 | 75.73 |
| 956.0 | 3.68 | 4.13 | 4.83 | 5.73 | 6.72 | 7.91 | 8.1 | 9.32 | 10.89 | 12.23 | 14.08 | 16.65 | 18.45 | 21.16 | 24.91 | 31.15 | 36 | 43.95 | 53.5 | 64.81 | 78.17 |
| 957.0 | 3.88 | 4.41 | 4.89 | 6.03 | 7.03 | 8.2 | 8.49 | 9.68 | 11.27 | 12.66 | 14.59 | 17.21 | 19.11 | 21.86 | 25.72 | 32.26 | 37.14 | 45.47 | 55.22 | 66.85 | 80.67 |
| 958.0 | 4.13 | 4.55 | 5.1 | 6.3 | 7.18 | 8.36 | 8.88 | 10.11 | 11.67 | 13.1 | 14.94 | 17.71 | 19.77 | 22.59 | 26.59 | 33.25 | 38.26 | 47.1 | 56.97 | 68.94 | 83.15 |
| 959.0 | 4.17 | 4.74 | 5.18 | 6.53 | 7.4 | 8.6 | 9.3 | 10.43 | 12.08 | 13.41 | 15.41 | 18.19 | 20.26 | 23.32 | 27.4 | 34.24 | 39.42 | 48.45 | 58.67 | 71.21 | 85.53 |
| 960.0 | 4.14 | 4.88 | 5.21 | 6.81 | 7.52 | 8.74 | 9.62 | 10.63 | 12.31 | 13.73 | 15.75 | 18.63 | 20.78 | 23.96 | 28.22 | 34.94 | 40.53 | 49.66 | 60.34 | 73.11 | 87.93 |
| 961.0 | 4.36 | 4.98 | 5.47 | 7.1 | 7.75 | 8.96 | 10.01 | 11 | 12.6 | 14.1 | 16.14 | 19.05 | 21.32 | 24.63 | 29.04 | 36 | 41.57 | 50.95 | 62.04 | 74.91 | 90.33 |
| 962.0 | 4.44 | 5.21 | 5.65 | 7.2 | 8.06 | 9.18 | 10.33 | 11.37 | 12.98 | 14.43 | 16.55 | 19.5 | 21.9 | 25.16 | 29.55 | 36.81 | 42.49 | 52.09 | 63.39 | 76.6 | 92.48 |
| 963.0 | 4.62 | 5.36 | 5.77 | 7.29 | 8.3 | 9.35 | 10.62 | 11.6 | 13.2 | 14.73 | 16.78 | 19.96 | 22.41 | 25.59 | 30.23 | 37.47 | 43.27 | 53.18 | 64.63 | 78.02 | 94.44 |
| 964.0 | 4.76 | 5.37 | 5.94 | 7.46 | 8.55 | 9.58 | 10.69 | 11.94 | 13.56 | 14.93 | 17.08 | 20.41 | 22.8 | 26.05 | 30.88 | 38.21 | 43.98 | 54.11 | 65.79 | 79.43 | 96.26 |
| 965.0 | 4.91 | 5.48 | 6.08 | 7.69 | 8.78 | 9.81 | 10.89 | 12.1 | 13.73 | 15.2 | 17.41 | 20.75 | 23.24 | 26.46 | 31.34 | 38.78 | 44.71 | 54.91 | 66.65 | 80.68 | 97.68 |
| 966.0 | 4.94 | 5.54 | 6.08 | 7.91 | 8.84 | 10 | 11.16 | 12.27 | 13.97 | 15.51 | 17.65 | 21.1 | 23.6 | 26.8 | 31.6 | 39.27 | 45.38 | 55.71 | 67.36 | 81.83 | 98.95 |
| 967.0 | 4.97 | 5.67 | 6.23 | 8.07 | 8.94 | 10.09 | 11.36 | 12.47 | 14.14 | 15.8 | 17.88 | 21.39 | 23.89 | 27.26 | 32.06 | 39.71 | 45.86 | 56.4 | 68.15 | 82.67 | 100.12 |
| 968.0 | 4.95 | 5.61 | 6.24 | 8.14 | 8.92 | 10 | 11.4 | 12.52 | 14.15 | 15.85 | 18.07 | 21.45 | 24.25 | 27.62 | 32.19 | 39.93 | 46.2 | 57.02 | 68.55 | 83.48 | 100.97 |
| 969.0 | 4.8 | 5.49 | 6.22 | 8.15 | 8.86 | 9.93 | 11.37 | 12.42 | 14.15 | 15.86 | 18.06 | 21.31 | 24.3 | 27.79 | 32.38 | 39.99 | 46.52 | 57.14 | 68.73 | 84.03 | 101.41 |
| 970.0 | 4.76 | 5.48 | 6.24 | 8.05 | 8.83 | 9.88 | 11.38 | 12.4 | 14.37 | 15.98 | 18.16 | 21.28 | 24.23 | 28.01 | 32.45 | 40.2 | 46.77 | 57.51 | 69.13 | 84.45 | 101.95 |
| 971.0 | 4.95 | 5.58 | 6.33 | 7.97 | 8.78 | 9.88 | 11.46 | 12.56 | 14.38 | 16.12 | 18.4 | 21.47 | 24.35 | 28.2 | 32.71 | 40.34 | 47 | 57.74 | 69.54 | 84.67 | 102.3 |
| 972.0 | 4.88 | 5.6 | 6.18 | 7.93 | 8.8 | 9.86 | 11.43 | 12.45 | 14.4 | 16.04 | 18.45 | 21.41 | 24.27 | 28.2 | 32.69 | 40.35 | 47.06 | 57.73 | 69.67 | 84.64 | 102.38 |
| 973.0 | 4.8 | 5.49 | 6.22 | 7.82 | 8.68 | 9.74 | 11.41 | 12.31 | 14.3 | 16.14 | 18.3 | 21.38 | 24.15 | 27.96 | 32.68 | 40.2 | 46.83 | 57.67 | 69.63 | 84.58 | 102.38 |
| 974.0 | 4.76 | 5.47 | 6.21 | 7.87 | 8.66 | 9.74 | 11.38 | 12.28 | 14.41 | 16.14 | 18.42 | 21.2 | 24.21 | 27.9 | 32.58 | 40.09 | 46.79 | 57.5 | 69.49 | 84.42 | 102.15 |
| 975.0 | 4.65 | 5.48 | 6.11 | 7.84 | 8.61 | 9.73 | 11.25 | 12.33 | 14.33 | 16.12 | 18.26 | 21.17 | 24.02 | 27.82 | 32.36 | 39.78 | 46.79 | 57.24 | 69.17 | 84.13 | 101.73 |
| 976.0 | 4.63 | 5.3 | 6.03 | 7.67 | 8.48 | 9.71 | 11.24 | 12.17 | 14 | 16.01 | 18.12 | 20.97 | 23.9 | 27.69 | 32.29 | 39.45 | 46.54 | 57.01 | 68.74 | 83.62 | 101.13 |
| 977.0 | 4.68 | 5.27 | 6.05 | 7.76 | 8.52 | 9.59 | 11.25 | 12.15 | 13.91 | 15.97 | 18.07 | 20.96 | 23.86 | 27.6 | 32.15 | 39.34 | 46.21 | 56.71 | 68.56 | 83.04 | 100.55 |
| 978.0 | 4.58 | 5.17 | 6.09 | 7.57 | 8.33 | 9.43 | 11.03 | 12.01 | 13.74 | 15.73 | 17.83 | 20.71 | 23.58 | 27.28 | 31.95 | 38.93 | 45.75 | 56.17 | 68.03 | 82.61 | 99.66 |
| 979.0 | 4.38 | 5.09 | 6.02 | 7.36 | 8.2 | 9.42 | 10.78 | 11.79 | 13.65 | 15.51 | 17.73 | 20.51 | 23.38 | 27.01 | 31.68 | 38.61 | 45.39 | 55.52 | 67.41 | 82.01 | 99.16 |
| 980.0 | 4.57 | 5.1 | 6.03 | 7.3 | 8.25 | 9.4 | 10.58 | 11.75 | 13.54 | 15.51 | 17.63 | 20.44 | 23.22 | 26.87 | 31.44 | 38.35 | 45.1 | 55.26 | 66.85 | 81.28 | 98.4 |
| 981.0 | 4.71 | 5.05 | 6 | 7.14 | 8.2 | 9.39 | 10.5 | 11.75 | 13.49 | 15.49 | 17.52 | 20.25 | 23.07 | 26.68 | 31.04 | 37.91 | 44.56 | 54.91 | 66.21 | 80.6 | 97.34 |
| 982.0 | 4.62 | 5.05 | 5.84 | 7.17 | 8.04 | 9.43 | 10.32 | 11.57 | 13.43 | 15.58 | 17.38 | 20.07 | 22.87 | 26.45 | 30.7 | 37.45 | 44.22 | 54.09 | 65.5 | 79.77 | 96.36 |
| 983.0 | 4.53 | 4.77 | 5.69 | 6.97 | 7.82 | 9.19 | 10.16 | 11.39 | 13.18 | 15.33 | 17.13 | 19.72 | 22.43 | 26.23 | 30.35 | 36.93 | 43.74 | 53.43 | 64.77 | 78.8 | 95.22 |
| 984.0 | 4.29 | 4.68 | 5.63 | 6.85 | 7.69 | 9.11 | 9.93 | 11.27 | 13.03 | 15.22 | 17.07 | 19.39 | 22.01 | 25.94 | 29.98 | 36.61 | 43.35 | 52.65 | 64.17 | 78.12 | 94.12 |
| 985.0 | 4.14 | 4.63 | 5.44 | 6.6 | 7.51 | 8.8 | 9.78 | 10.83 | 12.77 | 15.05 | 16.84 | 19.04 | 21.72 | 25.49 | 29.53 | 36.09 | 42.8 | 52.01 | 63.24 | 76.96 | 92.9 |
| 986.0 | 4.04 | 4.56 | 5.28 | 6.54 | 7.17 | 8.55 | 9.55 | 10.65 | 12.5 | 14.74 | 16.57 | 18.81 | 21.4 | 25.08 | 29.16 | 35.55 | 42.19 | 51.24 | 62.39 | 75.9 | 91.79 |
| 987.0 | 4 | 4.45 | 5.17 | 6.33 | 7.15 | 8.47 | 9.47 | 10.48 | 12.35 | 14.41 | 16.29 | 18.4 | 21.04 | 24.67 | 28.79 | 35.09 | 41.59 | 50.42 | 61.55 | 74.81 | 90.58 |
| 988.0 | 3.98 | 4.28 | 5.09 | 6.18 | 7.01 | 8.32 | 9.36 | 10.24 | 12.17 | 14.21 | 15.94 | 17.95 | 20.72 | 24.31 | 28.27 | 34.46 | 40.94 | 49.61 | 60.58 | 73.72 | 89.3 |
| 989.0 | 3.91 | 4.22 | 5.06 | 6.02 | 6.94 | 8.24 | 9.25 | 10.05 | 12.03 | 13.99 | 15.61 | 17.66 | 20.36 | 23.85 | 27.89 | 33.85 | 40.36 | 48.76 | 59.85 | 72.47 | 88.06 |
| 990.0 | 3.97 | 4.24 | 5.06 | 5.86 | 6.83 | 8.05 | 9.15 | 9.98 | 11.9 | 13.81 | 15.41 | 17.41 | 20.06 | 23.63 | 27.45 | 33.43 | 39.64 | 48.16 | 59.2 | 71.35 | 86.88 |
| 991.0 | 4.24 | 3.64 | 4.98 | 6.44 | 6.95 | 8.35 | 10.47 | 10.77 | 12.58 | 14.26 | 15.93 | 17.71 | 21.4 | 24.55 | 26.32 | 31.42 | 38.09 | 49.05 | 57.89 | 71.69 | 84.84 |
| 992.0 | 3.12 | 3.99 | 3.4 | 7.82 | 5.33 | 8.67 | 8.4 | 9.74 | 11.08 | 15.82 | 15.42 | 17.24 | 20.32 | 23.35 | 27.19 | 31.57 | 40.66 | 41.99 | 57.71 | 68.68 | 83.33 |
| 993.0 | 2.83 | 2.72 | 4.33 | 4.05 | 6.07 | 7.13 | 7.95 | 10.21 | 10.98 | 12.73 | 14.01 | 16.18 | 18.17 | 23.59 | 24.87 | 31.15 | 38.72 | 45.45 | 55.09 | 66.74 | 81.34 |
| 994.0 | 3.98 | 4.18 | 5.03 | 4.65 | 7.81 | 8.02 | 7.83 | 9.59 | 11.05 | 13.16 | 15.63 | 16.59 | 17.68 | 21.88 | 25.63 | 32.61 | 38.26 | 42.96 | 56.64 | 70.66 | 81.76 |
| 995.0 | 3.14 | 4.21 | 4.32 | 4.52 | 6.83 | 5.62 | 7.43 | 5.88 | 11.02 | 13.49 | 14.32 | 15.61 | 19.29 | 19.96 | 24.51 | 31.47 | 35.28 | 44.52 | 52.08 | 61.63 | 80.92 |
| 996.0 | 4.91 | 5.18 | 3.68 | 7.87 | 3.49 | 6.38 | 7.53 | 8.46 | 9.5 | 11.88 | 14.85 | 17.33 | 18.71 | 20.5 | 25.93 | 30.67 | 36.8 | 43.09 | 52.06 | 63.46 | 78.33 |
| 997.0 | 3.64 | 2.59 | 4.59 | 4.73 | 7.52 | 8.33 | 9.07 | 8.05 | 11.63 | 11.35 | 14.89 | 14.13 | 18.02 | 20.56 | 23.73 | 29.61 | 34.47 | 42.47 | 53.61 | 63.05 | 76.96 |
| 998.0 | 4.23 | 4.3 | 5.11 | 5.61 | 6.65 | 8.41 | 9.66 | 9.47 | 11.44 | 13.47 | 12.67 | 14.4 | 18.69 | 21.17 | 24.7 | 28.43 | 33.41 | 42.25 | 52.82 | 61.82 | 76.15 |
| 999.0 | 2.15 | 3.01 | 4.76 | 4.45 | 6.42 | 6.91 | 8.35 | 8.71 | 10.91 | 11.69 | 12.7 | 15.19 | 17.6 | 20.5 | 23.45 | 27.11 | 33.54 | 42.41 | 51.12 | 59.34 | 73.07 |
| 1000.0 | 2.9 | 2.98 | 4.09 | 3.23 | 5.48 | 4.74 | 6.77 | 8.07 | 10.07 | 10.51 | 12.39 | 13.48 | 14.43 | 21.05 | 22.73 | 28.13 | 31.55 | 39.98 | 51.68 | 59.17 | 74.7 |